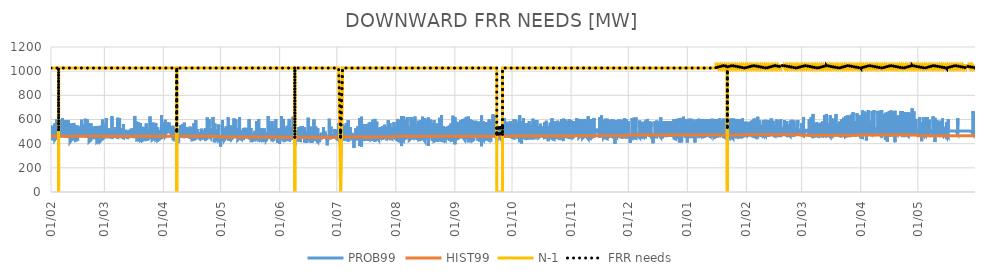
| Category | PROB99 | HIST99 | N-1 | FRR needs |
|---|---|---|---|---|
| 2019-02-01 | 463 | 461 | 1026 | 1026 |
| 2019-02-01 | 550 | 461 | 1026 | 1026 |
| 2019-02-01 | 533 | 461 | 1026 | 1026 |
| 2019-02-01 | 531 | 461 | 1026 | 1026 |
| 2019-02-01 | 492 | 461 | 1026 | 1026 |
| 2019-02-01 | 532 | 461 | 1026 | 1026 |
| 2019-02-02 | 429 | 461 | 1026 | 1026 |
| 2019-02-02 | 518 | 461 | 1026 | 1026 |
| 2019-02-02 | 534 | 461 | 1026 | 1026 |
| 2019-02-02 | 536 | 461 | 1026 | 1026 |
| 2019-02-02 | 517 | 461 | 1026 | 1026 |
| 2019-02-02 | 474 | 461 | 1026 | 1026 |
| 2019-02-03 | 460 | 461 | 1026 | 1026 |
| 2019-02-03 | 528 | 461 | 1026 | 1026 |
| 2019-02-03 | 566 | 461 | 1026 | 1026 |
| 2019-02-03 | 571 | 461 | 1026 | 1026 |
| 2019-02-03 | 517 | 461 | 1026 | 1026 |
| 2019-02-03 | 432 | 461 | 1026 | 1026 |
| 2019-02-04 | 455 | 461 | 1026 | 1026 |
| 2019-02-04 | 537 | 461 | 1026 | 1026 |
| 2019-02-04 | 601 | 461 | 1026 | 1026 |
| 2019-02-04 | 596 | 461 | 1026 | 1026 |
| 2019-02-04 | 525 | 461 | 1026 | 1026 |
| 2019-02-04 | 475 | 461 | 1026 | 1026 |
| 2019-02-05 | 465 | 461 | 1026 | 1026 |
| 2019-02-05 | 547 | 461 | 1026 | 1026 |
| 2019-02-05 | 516 | 461 | 0 | 516 |
| 2019-02-05 | 564 | 461 | 1026 | 1026 |
| 2019-02-05 | 507 | 461 | 1026 | 1026 |
| 2019-02-05 | 467 | 461 | 1026 | 1026 |
| 2019-02-06 | 465 | 461 | 1026 | 1026 |
| 2019-02-06 | 569 | 461 | 1026 | 1026 |
| 2019-02-06 | 597 | 461 | 1026 | 1026 |
| 2019-02-06 | 590 | 461 | 1026 | 1026 |
| 2019-02-06 | 515 | 461 | 1026 | 1026 |
| 2019-02-06 | 478 | 461 | 1026 | 1026 |
| 2019-02-07 | 470 | 461 | 1026 | 1026 |
| 2019-02-07 | 585 | 461 | 1026 | 1026 |
| 2019-02-07 | 611 | 461 | 1026 | 1026 |
| 2019-02-07 | 610 | 461 | 1026 | 1026 |
| 2019-02-07 | 522 | 461 | 1026 | 1026 |
| 2019-02-07 | 467 | 461 | 1026 | 1026 |
| 2019-02-08 | 463 | 461 | 1026 | 1026 |
| 2019-02-08 | 585 | 461 | 1026 | 1026 |
| 2019-02-08 | 596 | 461 | 1026 | 1026 |
| 2019-02-08 | 595 | 461 | 1026 | 1026 |
| 2019-02-08 | 522 | 461 | 1026 | 1026 |
| 2019-02-08 | 500 | 461 | 1026 | 1026 |
| 2019-02-09 | 454 | 461 | 1026 | 1026 |
| 2019-02-09 | 497 | 461 | 1026 | 1026 |
| 2019-02-09 | 593 | 461 | 1026 | 1026 |
| 2019-02-09 | 592 | 461 | 1026 | 1026 |
| 2019-02-09 | 530 | 461 | 1026 | 1026 |
| 2019-02-09 | 497 | 461 | 1026 | 1026 |
| 2019-02-10 | 473 | 461 | 1026 | 1026 |
| 2019-02-10 | 518 | 461 | 1026 | 1026 |
| 2019-02-10 | 593 | 461 | 1026 | 1026 |
| 2019-02-10 | 601 | 461 | 1026 | 1026 |
| 2019-02-10 | 536 | 461 | 1026 | 1026 |
| 2019-02-10 | 460 | 461 | 1026 | 1026 |
| 2019-02-11 | 464 | 461 | 1026 | 1026 |
| 2019-02-11 | 551 | 461 | 1026 | 1026 |
| 2019-02-11 | 567 | 461 | 1026 | 1026 |
| 2019-02-11 | 571 | 461 | 1026 | 1026 |
| 2019-02-11 | 518 | 461 | 1026 | 1026 |
| 2019-02-11 | 414 | 461 | 1026 | 1026 |
| 2019-02-12 | 436 | 461 | 1026 | 1026 |
| 2019-02-12 | 547 | 461 | 1026 | 1026 |
| 2019-02-12 | 567 | 461 | 1026 | 1026 |
| 2019-02-12 | 569 | 461 | 1026 | 1026 |
| 2019-02-12 | 513 | 461 | 1026 | 1026 |
| 2019-02-12 | 450 | 461 | 1026 | 1026 |
| 2019-02-13 | 438 | 461 | 1026 | 1026 |
| 2019-02-13 | 550 | 461 | 1026 | 1026 |
| 2019-02-13 | 572 | 461 | 1026 | 1026 |
| 2019-02-13 | 576 | 461 | 1026 | 1026 |
| 2019-02-13 | 523 | 461 | 1026 | 1026 |
| 2019-02-13 | 515 | 461 | 1026 | 1026 |
| 2019-02-14 | 434 | 461 | 1026 | 1026 |
| 2019-02-14 | 542 | 461 | 1026 | 1026 |
| 2019-02-14 | 554 | 461 | 1026 | 1026 |
| 2019-02-14 | 550 | 461 | 1026 | 1026 |
| 2019-02-14 | 510 | 461 | 1026 | 1026 |
| 2019-02-14 | 426 | 461 | 1026 | 1026 |
| 2019-02-15 | 433 | 461 | 1026 | 1026 |
| 2019-02-15 | 549 | 461 | 1026 | 1026 |
| 2019-02-15 | 549 | 461 | 1026 | 1026 |
| 2019-02-15 | 545 | 461 | 1026 | 1026 |
| 2019-02-15 | 511 | 461 | 1026 | 1026 |
| 2019-02-15 | 544 | 461 | 1026 | 1026 |
| 2019-02-16 | 466 | 461 | 1026 | 1026 |
| 2019-02-16 | 520 | 461 | 1026 | 1026 |
| 2019-02-16 | 538 | 461 | 1026 | 1026 |
| 2019-02-16 | 540 | 461 | 1026 | 1026 |
| 2019-02-16 | 514 | 461 | 1026 | 1026 |
| 2019-02-16 | 510 | 461 | 1026 | 1026 |
| 2019-02-17 | 465 | 461 | 1026 | 1026 |
| 2019-02-17 | 502 | 461 | 1026 | 1026 |
| 2019-02-17 | 598 | 461 | 1026 | 1026 |
| 2019-02-17 | 597 | 461 | 1026 | 1026 |
| 2019-02-17 | 527 | 461 | 1026 | 1026 |
| 2019-02-17 | 473 | 461 | 1026 | 1026 |
| 2019-02-18 | 473 | 461 | 1026 | 1026 |
| 2019-02-18 | 556 | 461 | 1026 | 1026 |
| 2019-02-18 | 542 | 461 | 1026 | 1026 |
| 2019-02-18 | 550 | 461 | 1026 | 1026 |
| 2019-02-18 | 507 | 461 | 1026 | 1026 |
| 2019-02-18 | 466 | 461 | 1026 | 1026 |
| 2019-02-19 | 469 | 461 | 1026 | 1026 |
| 2019-02-19 | 568 | 461 | 1026 | 1026 |
| 2019-02-19 | 606 | 461 | 1026 | 1026 |
| 2019-02-19 | 606 | 461 | 1026 | 1026 |
| 2019-02-19 | 512 | 461 | 1026 | 1026 |
| 2019-02-19 | 464 | 461 | 1026 | 1026 |
| 2019-02-20 | 461 | 461 | 1026 | 1026 |
| 2019-02-20 | 552 | 461 | 1026 | 1026 |
| 2019-02-20 | 564 | 461 | 1026 | 1026 |
| 2019-02-20 | 601 | 461 | 1026 | 1026 |
| 2019-02-20 | 528 | 461 | 1026 | 1026 |
| 2019-02-20 | 512 | 461 | 1026 | 1026 |
| 2019-02-21 | 457 | 461 | 1026 | 1026 |
| 2019-02-21 | 554 | 461 | 1026 | 1026 |
| 2019-02-21 | 568 | 461 | 1026 | 1026 |
| 2019-02-21 | 552 | 461 | 1026 | 1026 |
| 2019-02-21 | 497 | 461 | 1026 | 1026 |
| 2019-02-21 | 416 | 461 | 1026 | 1026 |
| 2019-02-22 | 431 | 461 | 1026 | 1026 |
| 2019-02-22 | 547 | 461 | 1026 | 1026 |
| 2019-02-22 | 567 | 461 | 1026 | 1026 |
| 2019-02-22 | 554 | 461 | 1026 | 1026 |
| 2019-02-22 | 508 | 461 | 1026 | 1026 |
| 2019-02-22 | 501 | 461 | 1026 | 1026 |
| 2019-02-23 | 440 | 461 | 1026 | 1026 |
| 2019-02-23 | 524 | 461 | 1026 | 1026 |
| 2019-02-23 | 525 | 461 | 1026 | 1026 |
| 2019-02-23 | 540 | 461 | 1026 | 1026 |
| 2019-02-23 | 513 | 461 | 1026 | 1026 |
| 2019-02-23 | 499 | 461 | 1026 | 1026 |
| 2019-02-24 | 438 | 461 | 1026 | 1026 |
| 2019-02-24 | 512 | 461 | 1026 | 1026 |
| 2019-02-24 | 527 | 461 | 1026 | 1026 |
| 2019-02-24 | 542 | 461 | 1026 | 1026 |
| 2019-02-24 | 512 | 461 | 1026 | 1026 |
| 2019-02-24 | 503 | 461 | 1026 | 1026 |
| 2019-02-25 | 437 | 461 | 1026 | 1026 |
| 2019-02-25 | 516 | 461 | 1026 | 1026 |
| 2019-02-25 | 529 | 461 | 1026 | 1026 |
| 2019-02-25 | 546 | 461 | 1026 | 1026 |
| 2019-02-25 | 521 | 461 | 1026 | 1026 |
| 2019-02-25 | 415 | 461 | 1026 | 1026 |
| 2019-02-26 | 431 | 461 | 1026 | 1026 |
| 2019-02-26 | 547 | 461 | 1026 | 1026 |
| 2019-02-26 | 548 | 461 | 1026 | 1026 |
| 2019-02-26 | 541 | 461 | 1026 | 1026 |
| 2019-02-26 | 510 | 461 | 1026 | 1026 |
| 2019-02-26 | 418 | 461 | 1026 | 1026 |
| 2019-02-27 | 435 | 461 | 1026 | 1026 |
| 2019-02-27 | 549 | 461 | 1026 | 1026 |
| 2019-02-27 | 548 | 461 | 1026 | 1026 |
| 2019-02-27 | 542 | 461 | 1026 | 1026 |
| 2019-02-27 | 517 | 461 | 1026 | 1026 |
| 2019-02-27 | 423 | 461 | 1026 | 1026 |
| 2019-02-28 | 442 | 461 | 1026 | 1026 |
| 2019-02-28 | 549 | 461 | 1026 | 1026 |
| 2019-02-28 | 599 | 461 | 1026 | 1026 |
| 2019-02-28 | 598 | 461 | 1026 | 1026 |
| 2019-02-28 | 542 | 461 | 1026 | 1026 |
| 2019-02-28 | 432 | 461 | 1026 | 1026 |
| 2019-03-01 | 468 | 461 | 1026 | 1026 |
| 2019-03-01 | 530 | 461 | 1026 | 1026 |
| 2019-03-01 | 556 | 461 | 1026 | 1026 |
| 2019-03-01 | 566 | 461 | 1026 | 1026 |
| 2019-03-01 | 504 | 461 | 1026 | 1026 |
| 2019-03-01 | 495 | 461 | 1026 | 1026 |
| 2019-03-02 | 457 | 461 | 1026 | 1026 |
| 2019-03-02 | 518 | 461 | 1026 | 1026 |
| 2019-03-02 | 611 | 461 | 1026 | 1026 |
| 2019-03-02 | 615 | 461 | 1026 | 1026 |
| 2019-03-02 | 484 | 461 | 1026 | 1026 |
| 2019-03-02 | 455 | 461 | 1026 | 1026 |
| 2019-03-03 | 458 | 461 | 1026 | 1026 |
| 2019-03-03 | 452 | 461 | 1026 | 1026 |
| 2019-03-03 | 508 | 461 | 1026 | 1026 |
| 2019-03-03 | 530 | 461 | 1026 | 1026 |
| 2019-03-03 | 494 | 461 | 1026 | 1026 |
| 2019-03-03 | 458 | 461 | 1026 | 1026 |
| 2019-03-04 | 458 | 461 | 1026 | 1026 |
| 2019-03-04 | 503 | 461 | 1026 | 1026 |
| 2019-03-04 | 514 | 461 | 1026 | 1026 |
| 2019-03-04 | 521 | 461 | 1026 | 1026 |
| 2019-03-04 | 497 | 461 | 1026 | 1026 |
| 2019-03-04 | 455 | 461 | 1026 | 1026 |
| 2019-03-05 | 451 | 461 | 1026 | 1026 |
| 2019-03-05 | 504 | 461 | 1026 | 1026 |
| 2019-03-05 | 579 | 461 | 1026 | 1026 |
| 2019-03-05 | 627 | 461 | 1026 | 1026 |
| 2019-03-05 | 507 | 461 | 1026 | 1026 |
| 2019-03-05 | 465 | 461 | 1026 | 1026 |
| 2019-03-06 | 466 | 461 | 1026 | 1026 |
| 2019-03-06 | 512 | 461 | 1026 | 1026 |
| 2019-03-06 | 515 | 461 | 1026 | 1026 |
| 2019-03-06 | 519 | 461 | 1026 | 1026 |
| 2019-03-06 | 481 | 461 | 1026 | 1026 |
| 2019-03-06 | 461 | 461 | 1026 | 1026 |
| 2019-03-07 | 471 | 461 | 1026 | 1026 |
| 2019-03-07 | 513 | 461 | 1026 | 1026 |
| 2019-03-07 | 536 | 461 | 1026 | 1026 |
| 2019-03-07 | 521 | 461 | 1026 | 1026 |
| 2019-03-07 | 491 | 461 | 1026 | 1026 |
| 2019-03-07 | 456 | 461 | 1026 | 1026 |
| 2019-03-08 | 451 | 461 | 1026 | 1026 |
| 2019-03-08 | 531 | 461 | 1026 | 1026 |
| 2019-03-08 | 577 | 461 | 1026 | 1026 |
| 2019-03-08 | 614 | 461 | 1026 | 1026 |
| 2019-03-08 | 519 | 461 | 1026 | 1026 |
| 2019-03-08 | 492 | 461 | 1026 | 1026 |
| 2019-03-09 | 452 | 461 | 1026 | 1026 |
| 2019-03-09 | 480 | 461 | 1026 | 1026 |
| 2019-03-09 | 519 | 461 | 1026 | 1026 |
| 2019-03-09 | 611 | 461 | 1026 | 1026 |
| 2019-03-09 | 504 | 461 | 1026 | 1026 |
| 2019-03-09 | 467 | 461 | 1026 | 1026 |
| 2019-03-10 | 471 | 461 | 1026 | 1026 |
| 2019-03-10 | 469 | 461 | 1026 | 1026 |
| 2019-03-10 | 508 | 461 | 1026 | 1026 |
| 2019-03-10 | 527 | 461 | 1026 | 1026 |
| 2019-03-10 | 494 | 461 | 1026 | 1026 |
| 2019-03-10 | 455 | 461 | 1026 | 1026 |
| 2019-03-11 | 448 | 461 | 1026 | 1026 |
| 2019-03-11 | 498 | 461 | 1026 | 1026 |
| 2019-03-11 | 562 | 461 | 1026 | 1026 |
| 2019-03-11 | 564 | 461 | 1026 | 1026 |
| 2019-03-11 | 510 | 461 | 1026 | 1026 |
| 2019-03-11 | 511 | 461 | 1026 | 1026 |
| 2019-03-12 | 456 | 461 | 1026 | 1026 |
| 2019-03-12 | 500 | 461 | 1026 | 1026 |
| 2019-03-12 | 515 | 461 | 1026 | 1026 |
| 2019-03-12 | 519 | 461 | 1026 | 1026 |
| 2019-03-12 | 478 | 461 | 1026 | 1026 |
| 2019-03-12 | 457 | 461 | 1026 | 1026 |
| 2019-03-13 | 451 | 461 | 1026 | 1026 |
| 2019-03-13 | 501 | 461 | 1026 | 1026 |
| 2019-03-13 | 514 | 461 | 1026 | 1026 |
| 2019-03-13 | 517 | 461 | 1026 | 1026 |
| 2019-03-13 | 478 | 461 | 1026 | 1026 |
| 2019-03-13 | 456 | 461 | 1026 | 1026 |
| 2019-03-14 | 456 | 461 | 1026 | 1026 |
| 2019-03-14 | 499 | 461 | 1026 | 1026 |
| 2019-03-14 | 514 | 461 | 1026 | 1026 |
| 2019-03-14 | 517 | 461 | 1026 | 1026 |
| 2019-03-14 | 487 | 461 | 1026 | 1026 |
| 2019-03-14 | 460 | 461 | 1026 | 1026 |
| 2019-03-15 | 468 | 461 | 1026 | 1026 |
| 2019-03-15 | 500 | 461 | 1026 | 1026 |
| 2019-03-15 | 513 | 461 | 1026 | 1026 |
| 2019-03-15 | 523 | 461 | 1026 | 1026 |
| 2019-03-15 | 472 | 461 | 1026 | 1026 |
| 2019-03-15 | 469 | 461 | 1026 | 1026 |
| 2019-03-16 | 480 | 461 | 1026 | 1026 |
| 2019-03-16 | 474 | 461 | 1026 | 1026 |
| 2019-03-16 | 513 | 461 | 1026 | 1026 |
| 2019-03-16 | 528 | 461 | 1026 | 1026 |
| 2019-03-16 | 504 | 461 | 1026 | 1026 |
| 2019-03-16 | 457 | 461 | 1026 | 1026 |
| 2019-03-17 | 456 | 461 | 1026 | 1026 |
| 2019-03-17 | 449 | 461 | 1026 | 1026 |
| 2019-03-17 | 547 | 461 | 1026 | 1026 |
| 2019-03-17 | 630 | 461 | 1026 | 1026 |
| 2019-03-17 | 507 | 461 | 1026 | 1026 |
| 2019-03-17 | 464 | 461 | 1026 | 1026 |
| 2019-03-18 | 461 | 461 | 1026 | 1026 |
| 2019-03-18 | 535 | 461 | 1026 | 1026 |
| 2019-03-18 | 582 | 461 | 1026 | 1026 |
| 2019-03-18 | 546 | 461 | 1026 | 1026 |
| 2019-03-18 | 528 | 461 | 1026 | 1026 |
| 2019-03-18 | 432 | 461 | 1026 | 1026 |
| 2019-03-19 | 439 | 461 | 1026 | 1026 |
| 2019-03-19 | 538 | 461 | 1026 | 1026 |
| 2019-03-19 | 575 | 461 | 1026 | 1026 |
| 2019-03-19 | 539 | 461 | 1026 | 1026 |
| 2019-03-19 | 526 | 461 | 1026 | 1026 |
| 2019-03-19 | 432 | 461 | 1026 | 1026 |
| 2019-03-20 | 442 | 461 | 1026 | 1026 |
| 2019-03-20 | 539 | 461 | 1026 | 1026 |
| 2019-03-20 | 571 | 461 | 1026 | 1026 |
| 2019-03-20 | 542 | 461 | 1026 | 1026 |
| 2019-03-20 | 519 | 461 | 1026 | 1026 |
| 2019-03-20 | 427 | 461 | 1026 | 1026 |
| 2019-03-21 | 437 | 461 | 1026 | 1026 |
| 2019-03-21 | 539 | 461 | 1026 | 1026 |
| 2019-03-21 | 547 | 461 | 1026 | 1026 |
| 2019-03-21 | 531 | 461 | 1026 | 1026 |
| 2019-03-21 | 523 | 461 | 1026 | 1026 |
| 2019-03-21 | 426 | 461 | 1026 | 1026 |
| 2019-03-22 | 437 | 461 | 1026 | 1026 |
| 2019-03-22 | 538 | 461 | 1026 | 1026 |
| 2019-03-22 | 531 | 461 | 1026 | 1026 |
| 2019-03-22 | 526 | 461 | 1026 | 1026 |
| 2019-03-22 | 524 | 461 | 1026 | 1026 |
| 2019-03-22 | 489 | 461 | 1026 | 1026 |
| 2019-03-23 | 439 | 461 | 1026 | 1026 |
| 2019-03-23 | 506 | 461 | 1026 | 1026 |
| 2019-03-23 | 567 | 461 | 1026 | 1026 |
| 2019-03-23 | 532 | 461 | 1026 | 1026 |
| 2019-03-23 | 503 | 461 | 1026 | 1026 |
| 2019-03-23 | 433 | 461 | 1026 | 1026 |
| 2019-03-24 | 438 | 461 | 1026 | 1026 |
| 2019-03-24 | 467 | 461 | 1026 | 1026 |
| 2019-03-24 | 521 | 461 | 1026 | 1026 |
| 2019-03-24 | 528 | 461 | 1026 | 1026 |
| 2019-03-24 | 525 | 461 | 1026 | 1026 |
| 2019-03-24 | 443 | 461 | 1026 | 1026 |
| 2019-03-25 | 453 | 461 | 1026 | 1026 |
| 2019-03-25 | 524 | 461 | 1026 | 1026 |
| 2019-03-25 | 625 | 461 | 1026 | 1026 |
| 2019-03-25 | 624 | 461 | 1026 | 1026 |
| 2019-03-25 | 517 | 461 | 1026 | 1026 |
| 2019-03-25 | 465 | 461 | 1026 | 1026 |
| 2019-03-26 | 450 | 461 | 1026 | 1026 |
| 2019-03-26 | 536 | 461 | 1026 | 1026 |
| 2019-03-26 | 573 | 461 | 1026 | 1026 |
| 2019-03-26 | 573 | 461 | 1026 | 1026 |
| 2019-03-26 | 530 | 461 | 1026 | 1026 |
| 2019-03-26 | 431 | 461 | 1026 | 1026 |
| 2019-03-27 | 444 | 461 | 1026 | 1026 |
| 2019-03-27 | 547 | 461 | 1026 | 1026 |
| 2019-03-27 | 574 | 461 | 1026 | 1026 |
| 2019-03-27 | 541 | 461 | 1026 | 1026 |
| 2019-03-27 | 532 | 461 | 1026 | 1026 |
| 2019-03-27 | 474 | 461 | 1026 | 1026 |
| 2019-03-28 | 437 | 461 | 1026 | 1026 |
| 2019-03-28 | 542 | 461 | 1026 | 1026 |
| 2019-03-28 | 571 | 461 | 1026 | 1026 |
| 2019-03-28 | 541 | 461 | 1026 | 1026 |
| 2019-03-28 | 531 | 461 | 1026 | 1026 |
| 2019-03-28 | 432 | 461 | 1026 | 1026 |
| 2019-03-29 | 444 | 461 | 1026 | 1026 |
| 2019-03-29 | 534 | 461 | 1026 | 1026 |
| 2019-03-29 | 524 | 461 | 1026 | 1026 |
| 2019-03-29 | 529 | 461 | 1026 | 1026 |
| 2019-03-29 | 523 | 461 | 1026 | 1026 |
| 2019-03-29 | 426 | 461 | 1026 | 1026 |
| 2019-03-30 | 438 | 461 | 1026 | 1026 |
| 2019-03-30 | 512 | 461 | 1026 | 1026 |
| 2019-03-30 | 511 | 461 | 1026 | 1026 |
| 2019-03-30 | 515 | 461 | 1026 | 1026 |
| 2019-03-30 | 494 | 461 | 1026 | 1026 |
| 2019-03-30 | 439 | 461 | 1026 | 1026 |
| 2019-03-31 | 449 | 461 | 1026 | 1026 |
| 2019-03-31 | 478 | 461 | 1026 | 1026 |
| 2019-03-31 | 625 | 461 | 1026 | 1026 |
| 2019-03-31 | 636 | 461 | 1026 | 1026 |
| 2019-03-31 | 618 | 461 | 1026 | 1026 |
| 2019-03-31 | 487 | 461 | 1026 | 1026 |
| 2019-04-01 | 465 | 461 | 1026 | 1026 |
| 2019-04-01 | 528 | 461 | 1026 | 1026 |
| 2019-04-01 | 578 | 461 | 1026 | 1026 |
| 2019-04-01 | 523 | 461 | 1026 | 1026 |
| 2019-04-01 | 527 | 461 | 1026 | 1026 |
| 2019-04-01 | 512 | 461 | 1026 | 1026 |
| 2019-04-02 | 445 | 461 | 1026 | 1026 |
| 2019-04-02 | 528 | 461 | 1026 | 1026 |
| 2019-04-02 | 571 | 461 | 1026 | 1026 |
| 2019-04-02 | 598 | 461 | 1026 | 1026 |
| 2019-04-02 | 589 | 461 | 1026 | 1026 |
| 2019-04-02 | 498 | 461 | 1026 | 1026 |
| 2019-04-03 | 513 | 461 | 1026 | 1026 |
| 2019-04-03 | 526 | 461 | 1026 | 1026 |
| 2019-04-03 | 576 | 461 | 1026 | 1026 |
| 2019-04-03 | 578 | 461 | 1026 | 1026 |
| 2019-04-03 | 546 | 461 | 1026 | 1026 |
| 2019-04-03 | 495 | 461 | 1026 | 1026 |
| 2019-04-04 | 509 | 461 | 1026 | 1026 |
| 2019-04-04 | 525 | 461 | 1026 | 1026 |
| 2019-04-04 | 575 | 461 | 1026 | 1026 |
| 2019-04-04 | 576 | 461 | 1026 | 1026 |
| 2019-04-04 | 541 | 461 | 1026 | 1026 |
| 2019-04-04 | 498 | 461 | 1026 | 1026 |
| 2019-04-05 | 485 | 461 | 1026 | 1026 |
| 2019-04-05 | 527 | 461 | 1026 | 1026 |
| 2019-04-05 | 545 | 461 | 1026 | 1026 |
| 2019-04-05 | 526 | 461 | 1026 | 1026 |
| 2019-04-05 | 527 | 461 | 1026 | 1026 |
| 2019-04-05 | 499 | 461 | 1026 | 1026 |
| 2019-04-06 | 447 | 461 | 1026 | 1026 |
| 2019-04-06 | 518 | 461 | 1026 | 1026 |
| 2019-04-06 | 548 | 461 | 1026 | 1026 |
| 2019-04-06 | 516 | 461 | 1026 | 1026 |
| 2019-04-06 | 507 | 461 | 1026 | 1026 |
| 2019-04-06 | 439 | 461 | 1026 | 1026 |
| 2019-04-07 | 441 | 461 | 1026 | 1026 |
| 2019-04-07 | 522 | 461 | 1026 | 1026 |
| 2019-04-07 | 500 | 461 | 1026 | 1026 |
| 2019-04-07 | 510 | 461 | 1026 | 1026 |
| 2019-04-07 | 493 | 461 | 1026 | 1026 |
| 2019-04-07 | 432 | 461 | 1026 | 1026 |
| 2019-04-08 | 436 | 461 | 1026 | 1026 |
| 2019-04-08 | 524 | 461 | 1026 | 1026 |
| 2019-04-08 | 521 | 461 | 0 | 521 |
| 2019-04-08 | 504 | 461 | 0 | 504 |
| 2019-04-08 | 476 | 461 | 1026 | 1026 |
| 2019-04-08 | 403 | 461 | 1026 | 1026 |
| 2019-04-09 | 415 | 461 | 1026 | 1026 |
| 2019-04-09 | 493 | 461 | 1026 | 1026 |
| 2019-04-09 | 529 | 461 | 1026 | 1026 |
| 2019-04-09 | 529 | 461 | 1026 | 1026 |
| 2019-04-09 | 485 | 461 | 1026 | 1026 |
| 2019-04-09 | 458 | 461 | 1026 | 1026 |
| 2019-04-10 | 459 | 461 | 1026 | 1026 |
| 2019-04-10 | 522 | 461 | 1026 | 1026 |
| 2019-04-10 | 529 | 461 | 1026 | 1026 |
| 2019-04-10 | 552 | 461 | 1026 | 1026 |
| 2019-04-10 | 538 | 461 | 1026 | 1026 |
| 2019-04-10 | 496 | 461 | 1026 | 1026 |
| 2019-04-11 | 455 | 461 | 1026 | 1026 |
| 2019-04-11 | 527 | 461 | 1026 | 1026 |
| 2019-04-11 | 562 | 461 | 1026 | 1026 |
| 2019-04-11 | 562 | 461 | 1026 | 1026 |
| 2019-04-11 | 525 | 461 | 1026 | 1026 |
| 2019-04-11 | 506 | 461 | 1026 | 1026 |
| 2019-04-12 | 446 | 461 | 1026 | 1026 |
| 2019-04-12 | 527 | 461 | 1026 | 1026 |
| 2019-04-12 | 574 | 461 | 1026 | 1026 |
| 2019-04-12 | 544 | 461 | 1026 | 1026 |
| 2019-04-12 | 545 | 461 | 1026 | 1026 |
| 2019-04-12 | 502 | 461 | 1026 | 1026 |
| 2019-04-13 | 448 | 461 | 1026 | 1026 |
| 2019-04-13 | 511 | 461 | 1026 | 1026 |
| 2019-04-13 | 537 | 461 | 1026 | 1026 |
| 2019-04-13 | 537 | 461 | 1026 | 1026 |
| 2019-04-13 | 532 | 461 | 1026 | 1026 |
| 2019-04-13 | 511 | 461 | 1026 | 1026 |
| 2019-04-14 | 450 | 461 | 1026 | 1026 |
| 2019-04-14 | 513 | 461 | 1026 | 1026 |
| 2019-04-14 | 518 | 461 | 1026 | 1026 |
| 2019-04-14 | 527 | 461 | 1026 | 1026 |
| 2019-04-14 | 530 | 461 | 1026 | 1026 |
| 2019-04-14 | 491 | 461 | 1026 | 1026 |
| 2019-04-15 | 442 | 461 | 1026 | 1026 |
| 2019-04-15 | 526 | 461 | 1026 | 1026 |
| 2019-04-15 | 541 | 461 | 1026 | 1026 |
| 2019-04-15 | 534 | 461 | 1026 | 1026 |
| 2019-04-15 | 529 | 461 | 1026 | 1026 |
| 2019-04-15 | 461 | 461 | 1026 | 1026 |
| 2019-04-16 | 467 | 461 | 1026 | 1026 |
| 2019-04-16 | 522 | 461 | 1026 | 1026 |
| 2019-04-16 | 533 | 461 | 1026 | 1026 |
| 2019-04-16 | 530 | 461 | 1026 | 1026 |
| 2019-04-16 | 526 | 461 | 1026 | 1026 |
| 2019-04-16 | 431 | 461 | 1026 | 1026 |
| 2019-04-17 | 435 | 461 | 1026 | 1026 |
| 2019-04-17 | 522 | 461 | 1026 | 1026 |
| 2019-04-17 | 570 | 461 | 1026 | 1026 |
| 2019-04-17 | 529 | 461 | 1026 | 1026 |
| 2019-04-17 | 507 | 461 | 1026 | 1026 |
| 2019-04-17 | 439 | 461 | 1026 | 1026 |
| 2019-04-18 | 442 | 461 | 1026 | 1026 |
| 2019-04-18 | 526 | 461 | 1026 | 1026 |
| 2019-04-18 | 521 | 461 | 1026 | 1026 |
| 2019-04-18 | 595 | 461 | 1026 | 1026 |
| 2019-04-18 | 591 | 461 | 1026 | 1026 |
| 2019-04-18 | 466 | 461 | 1026 | 1026 |
| 2019-04-19 | 471 | 461 | 1026 | 1026 |
| 2019-04-19 | 521 | 461 | 1026 | 1026 |
| 2019-04-19 | 510 | 461 | 1026 | 1026 |
| 2019-04-19 | 494 | 461 | 1026 | 1026 |
| 2019-04-19 | 481 | 461 | 1026 | 1026 |
| 2019-04-19 | 454 | 461 | 1026 | 1026 |
| 2019-04-20 | 441 | 461 | 1026 | 1026 |
| 2019-04-20 | 454 | 461 | 1026 | 1026 |
| 2019-04-20 | 495 | 461 | 1026 | 1026 |
| 2019-04-20 | 493 | 461 | 1026 | 1026 |
| 2019-04-20 | 483 | 461 | 1026 | 1026 |
| 2019-04-20 | 455 | 461 | 1026 | 1026 |
| 2019-04-21 | 460 | 461 | 1026 | 1026 |
| 2019-04-21 | 524 | 461 | 1026 | 1026 |
| 2019-04-21 | 488 | 461 | 1026 | 1026 |
| 2019-04-21 | 506 | 461 | 1026 | 1026 |
| 2019-04-21 | 492 | 461 | 1026 | 1026 |
| 2019-04-21 | 442 | 461 | 1026 | 1026 |
| 2019-04-22 | 447 | 461 | 1026 | 1026 |
| 2019-04-22 | 462 | 461 | 1026 | 1026 |
| 2019-04-22 | 492 | 461 | 1026 | 1026 |
| 2019-04-22 | 511 | 461 | 1026 | 1026 |
| 2019-04-22 | 491 | 461 | 1026 | 1026 |
| 2019-04-22 | 476 | 461 | 1026 | 1026 |
| 2019-04-23 | 474 | 461 | 1026 | 1026 |
| 2019-04-23 | 527 | 461 | 1026 | 1026 |
| 2019-04-23 | 517 | 461 | 1026 | 1026 |
| 2019-04-23 | 503 | 461 | 1026 | 1026 |
| 2019-04-23 | 483 | 461 | 1026 | 1026 |
| 2019-04-23 | 437 | 461 | 1026 | 1026 |
| 2019-04-24 | 443 | 461 | 1026 | 1026 |
| 2019-04-24 | 535 | 461 | 1026 | 1026 |
| 2019-04-24 | 606 | 461 | 1026 | 1026 |
| 2019-04-24 | 617 | 461 | 1026 | 1026 |
| 2019-04-24 | 591 | 461 | 1026 | 1026 |
| 2019-04-24 | 454 | 461 | 1026 | 1026 |
| 2019-04-25 | 478 | 461 | 1026 | 1026 |
| 2019-04-25 | 522 | 461 | 1026 | 1026 |
| 2019-04-25 | 602 | 461 | 1026 | 1026 |
| 2019-04-25 | 607 | 461 | 1026 | 1026 |
| 2019-04-25 | 592 | 461 | 1026 | 1026 |
| 2019-04-25 | 463 | 461 | 1026 | 1026 |
| 2019-04-26 | 443 | 461 | 1026 | 1026 |
| 2019-04-26 | 523 | 461 | 1026 | 1026 |
| 2019-04-26 | 513 | 461 | 1026 | 1026 |
| 2019-04-26 | 518 | 461 | 1026 | 1026 |
| 2019-04-26 | 521 | 461 | 1026 | 1026 |
| 2019-04-26 | 464 | 461 | 1026 | 1026 |
| 2019-04-27 | 463 | 461 | 1026 | 1026 |
| 2019-04-27 | 457 | 461 | 1026 | 1026 |
| 2019-04-27 | 565 | 461 | 1026 | 1026 |
| 2019-04-27 | 621 | 461 | 1026 | 1026 |
| 2019-04-27 | 545 | 461 | 1026 | 1026 |
| 2019-04-27 | 500 | 461 | 1026 | 1026 |
| 2019-04-28 | 461 | 461 | 1026 | 1026 |
| 2019-04-28 | 469 | 461 | 1026 | 1026 |
| 2019-04-28 | 566 | 461 | 1026 | 1026 |
| 2019-04-28 | 536 | 461 | 1026 | 1026 |
| 2019-04-28 | 411 | 461 | 1026 | 1026 |
| 2019-04-28 | 435 | 461 | 1026 | 1026 |
| 2019-04-29 | 432 | 461 | 1026 | 1026 |
| 2019-04-29 | 519 | 461 | 1026 | 1026 |
| 2019-04-29 | 527 | 461 | 1026 | 1026 |
| 2019-04-29 | 521 | 461 | 1026 | 1026 |
| 2019-04-29 | 524 | 461 | 1026 | 1026 |
| 2019-04-29 | 434 | 461 | 1026 | 1026 |
| 2019-04-30 | 436 | 461 | 1026 | 1026 |
| 2019-04-30 | 525 | 461 | 1026 | 1026 |
| 2019-04-30 | 558 | 461 | 1026 | 1026 |
| 2019-04-30 | 554 | 461 | 1026 | 1026 |
| 2019-04-30 | 496 | 461 | 1026 | 1026 |
| 2019-04-30 | 429 | 461 | 1026 | 1026 |
| 2019-05-01 | 447 | 455 | 1026 | 1026 |
| 2019-05-01 | 424 | 455 | 1026 | 1026 |
| 2019-05-01 | 442 | 455 | 1026 | 1026 |
| 2019-05-01 | 438 | 455 | 1026 | 1026 |
| 2019-05-01 | 377 | 455 | 1026 | 1026 |
| 2019-05-01 | 431 | 455 | 1026 | 1026 |
| 2019-05-02 | 432 | 455 | 1026 | 1026 |
| 2019-05-02 | 527 | 455 | 1026 | 1026 |
| 2019-05-02 | 530 | 455 | 1026 | 1026 |
| 2019-05-02 | 594 | 455 | 1026 | 1026 |
| 2019-05-02 | 593 | 455 | 1026 | 1026 |
| 2019-05-02 | 432 | 455 | 1026 | 1026 |
| 2019-05-03 | 434 | 455 | 1026 | 1026 |
| 2019-05-03 | 529 | 455 | 1026 | 1026 |
| 2019-05-03 | 519 | 455 | 1026 | 1026 |
| 2019-05-03 | 517 | 455 | 1026 | 1026 |
| 2019-05-03 | 490 | 455 | 1026 | 1026 |
| 2019-05-03 | 431 | 455 | 1026 | 1026 |
| 2019-05-04 | 455 | 455 | 1026 | 1026 |
| 2019-05-04 | 524 | 455 | 1026 | 1026 |
| 2019-05-04 | 526 | 455 | 1026 | 1026 |
| 2019-05-04 | 545 | 455 | 1026 | 1026 |
| 2019-05-04 | 523 | 455 | 1026 | 1026 |
| 2019-05-04 | 456 | 455 | 1026 | 1026 |
| 2019-05-05 | 454 | 455 | 1026 | 1026 |
| 2019-05-05 | 460 | 455 | 1026 | 1026 |
| 2019-05-05 | 609 | 455 | 1026 | 1026 |
| 2019-05-05 | 619 | 455 | 1026 | 1026 |
| 2019-05-05 | 605 | 455 | 1026 | 1026 |
| 2019-05-05 | 435 | 455 | 1026 | 1026 |
| 2019-05-06 | 432 | 455 | 1026 | 1026 |
| 2019-05-06 | 529 | 455 | 1026 | 1026 |
| 2019-05-06 | 552 | 455 | 1026 | 1026 |
| 2019-05-06 | 550 | 455 | 1026 | 1026 |
| 2019-05-06 | 538 | 455 | 1026 | 1026 |
| 2019-05-06 | 473 | 455 | 1026 | 1026 |
| 2019-05-07 | 436 | 455 | 1026 | 1026 |
| 2019-05-07 | 531 | 455 | 1026 | 1026 |
| 2019-05-07 | 546 | 455 | 1026 | 1026 |
| 2019-05-07 | 524 | 455 | 1026 | 1026 |
| 2019-05-07 | 534 | 455 | 1026 | 1026 |
| 2019-05-07 | 444 | 455 | 1026 | 1026 |
| 2019-05-08 | 468 | 455 | 1026 | 1026 |
| 2019-05-08 | 533 | 455 | 1026 | 1026 |
| 2019-05-08 | 609 | 455 | 1026 | 1026 |
| 2019-05-08 | 610 | 455 | 1026 | 1026 |
| 2019-05-08 | 544 | 455 | 1026 | 1026 |
| 2019-05-08 | 467 | 455 | 1026 | 1026 |
| 2019-05-09 | 471 | 455 | 1026 | 1026 |
| 2019-05-09 | 529 | 455 | 1026 | 1026 |
| 2019-05-09 | 519 | 455 | 1026 | 1026 |
| 2019-05-09 | 600 | 455 | 1026 | 1026 |
| 2019-05-09 | 591 | 455 | 1026 | 1026 |
| 2019-05-09 | 462 | 455 | 1026 | 1026 |
| 2019-05-10 | 453 | 455 | 1026 | 1026 |
| 2019-05-10 | 525 | 455 | 1026 | 1026 |
| 2019-05-10 | 518 | 455 | 1026 | 1026 |
| 2019-05-10 | 519 | 455 | 1026 | 1026 |
| 2019-05-10 | 478 | 455 | 1026 | 1026 |
| 2019-05-10 | 430 | 455 | 1026 | 1026 |
| 2019-05-11 | 446 | 455 | 1026 | 1026 |
| 2019-05-11 | 529 | 455 | 1026 | 1026 |
| 2019-05-11 | 589 | 455 | 1026 | 1026 |
| 2019-05-11 | 618 | 455 | 1026 | 1026 |
| 2019-05-11 | 612 | 455 | 1026 | 1026 |
| 2019-05-11 | 449 | 455 | 1026 | 1026 |
| 2019-05-12 | 436 | 455 | 1026 | 1026 |
| 2019-05-12 | 448 | 455 | 1026 | 1026 |
| 2019-05-12 | 509 | 455 | 1026 | 1026 |
| 2019-05-12 | 510 | 455 | 1026 | 1026 |
| 2019-05-12 | 497 | 455 | 1026 | 1026 |
| 2019-05-12 | 440 | 455 | 1026 | 1026 |
| 2019-05-13 | 440 | 455 | 1026 | 1026 |
| 2019-05-13 | 530 | 455 | 1026 | 1026 |
| 2019-05-13 | 507 | 455 | 1026 | 1026 |
| 2019-05-13 | 520 | 455 | 1026 | 1026 |
| 2019-05-13 | 506 | 455 | 1026 | 1026 |
| 2019-05-13 | 457 | 455 | 1026 | 1026 |
| 2019-05-14 | 456 | 455 | 1026 | 1026 |
| 2019-05-14 | 531 | 455 | 1026 | 1026 |
| 2019-05-14 | 512 | 455 | 1026 | 1026 |
| 2019-05-14 | 513 | 455 | 1026 | 1026 |
| 2019-05-14 | 509 | 455 | 1026 | 1026 |
| 2019-05-14 | 456 | 455 | 1026 | 1026 |
| 2019-05-15 | 456 | 455 | 1026 | 1026 |
| 2019-05-15 | 529 | 455 | 1026 | 1026 |
| 2019-05-15 | 502 | 455 | 1026 | 1026 |
| 2019-05-15 | 513 | 455 | 1026 | 1026 |
| 2019-05-15 | 505 | 455 | 1026 | 1026 |
| 2019-05-15 | 457 | 455 | 1026 | 1026 |
| 2019-05-16 | 455 | 455 | 1026 | 1026 |
| 2019-05-16 | 526 | 455 | 1026 | 1026 |
| 2019-05-16 | 512 | 455 | 1026 | 1026 |
| 2019-05-16 | 603 | 455 | 1026 | 1026 |
| 2019-05-16 | 491 | 455 | 1026 | 1026 |
| 2019-05-16 | 446 | 455 | 1026 | 1026 |
| 2019-05-17 | 447 | 455 | 1026 | 1026 |
| 2019-05-17 | 530 | 455 | 1026 | 1026 |
| 2019-05-17 | 514 | 455 | 1026 | 1026 |
| 2019-05-17 | 517 | 455 | 1026 | 1026 |
| 2019-05-17 | 480 | 455 | 1026 | 1026 |
| 2019-05-17 | 427 | 455 | 1026 | 1026 |
| 2019-05-18 | 434 | 455 | 1026 | 1026 |
| 2019-05-18 | 459 | 455 | 1026 | 1026 |
| 2019-05-18 | 487 | 455 | 1026 | 1026 |
| 2019-05-18 | 483 | 455 | 1026 | 1026 |
| 2019-05-18 | 472 | 455 | 1026 | 1026 |
| 2019-05-18 | 426 | 455 | 1026 | 1026 |
| 2019-05-19 | 434 | 455 | 1026 | 1026 |
| 2019-05-19 | 458 | 455 | 1026 | 1026 |
| 2019-05-19 | 492 | 455 | 1026 | 1026 |
| 2019-05-19 | 506 | 455 | 1026 | 1026 |
| 2019-05-19 | 487 | 455 | 1026 | 1026 |
| 2019-05-19 | 442 | 455 | 1026 | 1026 |
| 2019-05-20 | 448 | 455 | 1026 | 1026 |
| 2019-05-20 | 541 | 455 | 1026 | 1026 |
| 2019-05-20 | 524 | 455 | 1026 | 1026 |
| 2019-05-20 | 587 | 455 | 1026 | 1026 |
| 2019-05-20 | 582 | 455 | 1026 | 1026 |
| 2019-05-20 | 441 | 455 | 1026 | 1026 |
| 2019-05-21 | 457 | 455 | 1026 | 1026 |
| 2019-05-21 | 534 | 455 | 1026 | 1026 |
| 2019-05-21 | 545 | 455 | 1026 | 1026 |
| 2019-05-21 | 603 | 455 | 1026 | 1026 |
| 2019-05-21 | 589 | 455 | 1026 | 1026 |
| 2019-05-21 | 428 | 455 | 1026 | 1026 |
| 2019-05-22 | 432 | 455 | 1026 | 1026 |
| 2019-05-22 | 527 | 455 | 1026 | 1026 |
| 2019-05-22 | 504 | 455 | 1026 | 1026 |
| 2019-05-22 | 497 | 455 | 1026 | 1026 |
| 2019-05-22 | 494 | 455 | 1026 | 1026 |
| 2019-05-22 | 428 | 455 | 1026 | 1026 |
| 2019-05-23 | 433 | 455 | 1026 | 1026 |
| 2019-05-23 | 525 | 455 | 1026 | 1026 |
| 2019-05-23 | 500 | 455 | 1026 | 1026 |
| 2019-05-23 | 480 | 455 | 1026 | 1026 |
| 2019-05-23 | 473 | 455 | 1026 | 1026 |
| 2019-05-23 | 428 | 455 | 1026 | 1026 |
| 2019-05-24 | 437 | 455 | 1026 | 1026 |
| 2019-05-24 | 526 | 455 | 1026 | 1026 |
| 2019-05-24 | 494 | 455 | 1026 | 1026 |
| 2019-05-24 | 494 | 455 | 1026 | 1026 |
| 2019-05-24 | 484 | 455 | 1026 | 1026 |
| 2019-05-24 | 427 | 455 | 1026 | 1026 |
| 2019-05-25 | 433 | 455 | 1026 | 1026 |
| 2019-05-25 | 492 | 455 | 1026 | 1026 |
| 2019-05-25 | 494 | 455 | 1026 | 1026 |
| 2019-05-25 | 489 | 455 | 1026 | 1026 |
| 2019-05-25 | 486 | 455 | 1026 | 1026 |
| 2019-05-25 | 429 | 455 | 1026 | 1026 |
| 2019-05-26 | 453 | 455 | 1026 | 1026 |
| 2019-05-26 | 471 | 455 | 1026 | 1026 |
| 2019-05-26 | 615 | 455 | 1026 | 1026 |
| 2019-05-26 | 623 | 455 | 1026 | 1026 |
| 2019-05-26 | 626 | 455 | 1026 | 1026 |
| 2019-05-26 | 479 | 455 | 1026 | 1026 |
| 2019-05-27 | 472 | 455 | 1026 | 1026 |
| 2019-05-27 | 535 | 455 | 1026 | 1026 |
| 2019-05-27 | 505 | 455 | 1026 | 1026 |
| 2019-05-27 | 506 | 455 | 1026 | 1026 |
| 2019-05-27 | 484 | 455 | 1026 | 1026 |
| 2019-05-27 | 450 | 455 | 1026 | 1026 |
| 2019-05-28 | 435 | 455 | 1026 | 1026 |
| 2019-05-28 | 533 | 455 | 1026 | 1026 |
| 2019-05-28 | 516 | 455 | 1026 | 1026 |
| 2019-05-28 | 588 | 455 | 1026 | 1026 |
| 2019-05-28 | 589 | 455 | 1026 | 1026 |
| 2019-05-28 | 431 | 455 | 1026 | 1026 |
| 2019-05-29 | 434 | 455 | 1026 | 1026 |
| 2019-05-29 | 528 | 455 | 1026 | 1026 |
| 2019-05-29 | 504 | 455 | 1026 | 1026 |
| 2019-05-29 | 497 | 455 | 1026 | 1026 |
| 2019-05-29 | 496 | 455 | 1026 | 1026 |
| 2019-05-29 | 459 | 455 | 1026 | 1026 |
| 2019-05-30 | 465 | 455 | 1026 | 1026 |
| 2019-05-30 | 474 | 455 | 1026 | 1026 |
| 2019-05-30 | 528 | 455 | 1026 | 1026 |
| 2019-05-30 | 603 | 455 | 1026 | 1026 |
| 2019-05-30 | 515 | 455 | 1026 | 1026 |
| 2019-05-30 | 460 | 455 | 1026 | 1026 |
| 2019-05-31 | 468 | 455 | 1026 | 1026 |
| 2019-05-31 | 523 | 455 | 1026 | 1026 |
| 2019-05-31 | 513 | 455 | 1026 | 1026 |
| 2019-05-31 | 429 | 455 | 1026 | 1026 |
| 2019-05-31 | 408 | 455 | 1026 | 1026 |
| 2019-05-31 | 443 | 455 | 1026 | 1026 |
| 2019-06-01 | 527 | 454 | 1026 | 1026 |
| 2019-06-01 | 419 | 454 | 1026 | 1026 |
| 2019-06-01 | 510 | 454 | 1026 | 1026 |
| 2019-06-01 | 411 | 454 | 1026 | 1026 |
| 2019-06-01 | 397 | 454 | 1026 | 1026 |
| 2019-06-01 | 431 | 454 | 1026 | 1026 |
| 2019-06-02 | 460 | 454 | 1026 | 1026 |
| 2019-06-02 | 480 | 454 | 1026 | 1026 |
| 2019-06-02 | 626 | 454 | 1026 | 1026 |
| 2019-06-02 | 633 | 454 | 1026 | 1026 |
| 2019-06-02 | 620 | 454 | 1026 | 1026 |
| 2019-06-02 | 444 | 454 | 1026 | 1026 |
| 2019-06-03 | 454 | 454 | 1026 | 1026 |
| 2019-06-03 | 540 | 454 | 1026 | 1026 |
| 2019-06-03 | 506 | 454 | 1026 | 1026 |
| 2019-06-03 | 605 | 454 | 1026 | 1026 |
| 2019-06-03 | 613 | 454 | 1026 | 1026 |
| 2019-06-03 | 428 | 454 | 1026 | 1026 |
| 2019-06-04 | 429 | 454 | 1026 | 1026 |
| 2019-06-04 | 537 | 454 | 1026 | 1026 |
| 2019-06-04 | 479 | 454 | 1026 | 1026 |
| 2019-06-04 | 479 | 454 | 1026 | 1026 |
| 2019-06-04 | 473 | 454 | 1026 | 1026 |
| 2019-06-04 | 429 | 454 | 1026 | 1026 |
| 2019-06-05 | 438 | 454 | 1026 | 1026 |
| 2019-06-05 | 548 | 454 | 1026 | 1026 |
| 2019-06-05 | 513 | 454 | 1026 | 1026 |
| 2019-06-05 | 482 | 454 | 1026 | 1026 |
| 2019-06-05 | 483 | 454 | 1026 | 1026 |
| 2019-06-05 | 427 | 454 | 1026 | 1026 |
| 2019-06-06 | 482 | 454 | 1026 | 1026 |
| 2019-06-06 | 534 | 454 | 1026 | 1026 |
| 2019-06-06 | 593 | 454 | 1026 | 1026 |
| 2019-06-06 | 605 | 454 | 1026 | 1026 |
| 2019-06-06 | 504 | 454 | 1026 | 1026 |
| 2019-06-06 | 419 | 454 | 1026 | 1026 |
| 2019-06-07 | 451 | 454 | 1026 | 1026 |
| 2019-06-07 | 535 | 454 | 1026 | 1026 |
| 2019-06-07 | 528 | 454 | 1026 | 1026 |
| 2019-06-07 | 530 | 454 | 1026 | 1026 |
| 2019-06-07 | 539 | 454 | 1026 | 1026 |
| 2019-06-07 | 470 | 454 | 1026 | 1026 |
| 2019-06-08 | 449 | 454 | 1026 | 1026 |
| 2019-06-08 | 474 | 454 | 1026 | 1026 |
| 2019-06-08 | 551 | 454 | 1026 | 1026 |
| 2019-06-08 | 622 | 454 | 1026 | 1026 |
| 2019-06-08 | 613 | 454 | 1026 | 1026 |
| 2019-06-08 | 452 | 454 | 1026 | 1026 |
| 2019-06-09 | 465 | 454 | 1026 | 1026 |
| 2019-06-09 | 401 | 454 | 0 | 454 |
| 2019-06-09 | 506 | 454 | 1026 | 1026 |
| 2019-06-09 | 408 | 454 | 1026 | 1026 |
| 2019-06-09 | 380 | 454 | 1026 | 1026 |
| 2019-06-09 | 416 | 454 | 1026 | 1026 |
| 2019-06-10 | 435 | 454 | 1026 | 1026 |
| 2019-06-10 | 502 | 454 | 1026 | 1026 |
| 2019-06-10 | 477 | 454 | 1026 | 1026 |
| 2019-06-10 | 499 | 454 | 1026 | 1026 |
| 2019-06-10 | 490 | 454 | 1026 | 1026 |
| 2019-06-10 | 433 | 454 | 1026 | 1026 |
| 2019-06-11 | 429 | 454 | 1026 | 1026 |
| 2019-06-11 | 538 | 454 | 1026 | 1026 |
| 2019-06-11 | 534 | 454 | 1026 | 1026 |
| 2019-06-11 | 506 | 454 | 1026 | 1026 |
| 2019-06-11 | 490 | 454 | 1026 | 1026 |
| 2019-06-11 | 427 | 454 | 1026 | 1026 |
| 2019-06-12 | 424 | 454 | 1026 | 1026 |
| 2019-06-12 | 542 | 454 | 1026 | 1026 |
| 2019-06-12 | 535 | 454 | 1026 | 1026 |
| 2019-06-12 | 504 | 454 | 1026 | 1026 |
| 2019-06-12 | 520 | 454 | 1026 | 1026 |
| 2019-06-12 | 452 | 454 | 1026 | 1026 |
| 2019-06-13 | 481 | 454 | 1026 | 1026 |
| 2019-06-13 | 486 | 454 | 1026 | 1026 |
| 2019-06-13 | 531 | 454 | 1026 | 1026 |
| 2019-06-13 | 546 | 454 | 1026 | 1026 |
| 2019-06-13 | 541 | 454 | 1026 | 1026 |
| 2019-06-13 | 454 | 454 | 1026 | 1026 |
| 2019-06-14 | 450 | 454 | 1026 | 1026 |
| 2019-06-14 | 536 | 454 | 1026 | 1026 |
| 2019-06-14 | 488 | 454 | 1026 | 1026 |
| 2019-06-14 | 482 | 454 | 1026 | 1026 |
| 2019-06-14 | 476 | 454 | 1026 | 1026 |
| 2019-06-14 | 421 | 454 | 1026 | 1026 |
| 2019-06-15 | 421 | 454 | 1026 | 1026 |
| 2019-06-15 | 406 | 454 | 1026 | 1026 |
| 2019-06-15 | 501 | 454 | 1026 | 1026 |
| 2019-06-15 | 483 | 454 | 1026 | 1026 |
| 2019-06-15 | 478 | 454 | 1026 | 1026 |
| 2019-06-15 | 431 | 454 | 1026 | 1026 |
| 2019-06-16 | 474 | 454 | 1026 | 1026 |
| 2019-06-16 | 447 | 454 | 1026 | 1026 |
| 2019-06-16 | 529 | 454 | 1026 | 1026 |
| 2019-06-16 | 615 | 454 | 1026 | 1026 |
| 2019-06-16 | 467 | 454 | 1026 | 1026 |
| 2019-06-16 | 431 | 454 | 1026 | 1026 |
| 2019-06-17 | 425 | 454 | 1026 | 1026 |
| 2019-06-17 | 543 | 454 | 1026 | 1026 |
| 2019-06-17 | 486 | 454 | 1026 | 1026 |
| 2019-06-17 | 466 | 454 | 1026 | 1026 |
| 2019-06-17 | 470 | 454 | 1026 | 1026 |
| 2019-06-17 | 420 | 454 | 1026 | 1026 |
| 2019-06-18 | 421 | 454 | 1026 | 1026 |
| 2019-06-18 | 536 | 454 | 1026 | 1026 |
| 2019-06-18 | 501 | 454 | 1026 | 1026 |
| 2019-06-18 | 417 | 454 | 1026 | 1026 |
| 2019-06-18 | 408 | 454 | 1026 | 1026 |
| 2019-06-18 | 441 | 454 | 1026 | 1026 |
| 2019-06-19 | 437 | 454 | 1026 | 1026 |
| 2019-06-19 | 541 | 454 | 1026 | 1026 |
| 2019-06-19 | 474 | 454 | 1026 | 1026 |
| 2019-06-19 | 599 | 454 | 1026 | 1026 |
| 2019-06-19 | 598 | 454 | 1026 | 1026 |
| 2019-06-19 | 437 | 454 | 1026 | 1026 |
| 2019-06-20 | 431 | 454 | 1026 | 1026 |
| 2019-06-20 | 542 | 454 | 1026 | 1026 |
| 2019-06-20 | 487 | 454 | 1026 | 1026 |
| 2019-06-20 | 490 | 454 | 1026 | 1026 |
| 2019-06-20 | 487 | 454 | 1026 | 1026 |
| 2019-06-20 | 440 | 454 | 1026 | 1026 |
| 2019-06-21 | 419 | 454 | 1026 | 1026 |
| 2019-06-21 | 527 | 454 | 1026 | 1026 |
| 2019-06-21 | 493 | 454 | 1026 | 1026 |
| 2019-06-21 | 494 | 454 | 1026 | 1026 |
| 2019-06-21 | 491 | 454 | 1026 | 1026 |
| 2019-06-21 | 417 | 454 | 1026 | 1026 |
| 2019-06-22 | 422 | 454 | 1026 | 1026 |
| 2019-06-22 | 448 | 454 | 1026 | 1026 |
| 2019-06-22 | 483 | 454 | 1026 | 1026 |
| 2019-06-22 | 490 | 454 | 1026 | 1026 |
| 2019-06-22 | 487 | 454 | 1026 | 1026 |
| 2019-06-22 | 451 | 454 | 1026 | 1026 |
| 2019-06-23 | 449 | 454 | 1026 | 1026 |
| 2019-06-23 | 457 | 454 | 1026 | 1026 |
| 2019-06-23 | 476 | 454 | 1026 | 1026 |
| 2019-06-23 | 490 | 454 | 1026 | 1026 |
| 2019-06-23 | 482 | 454 | 1026 | 1026 |
| 2019-06-23 | 446 | 454 | 1026 | 1026 |
| 2019-06-24 | 453 | 454 | 1026 | 1026 |
| 2019-06-24 | 535 | 454 | 1026 | 1026 |
| 2019-06-24 | 470 | 454 | 1026 | 1026 |
| 2019-06-24 | 466 | 454 | 1026 | 1026 |
| 2019-06-24 | 469 | 454 | 1026 | 1026 |
| 2019-06-24 | 467 | 454 | 1026 | 1026 |
| 2019-06-25 | 486 | 454 | 1026 | 1026 |
| 2019-06-25 | 486 | 454 | 1026 | 1026 |
| 2019-06-25 | 486 | 454 | 1026 | 1026 |
| 2019-06-25 | 486 | 454 | 1026 | 1026 |
| 2019-06-25 | 486 | 454 | 1026 | 1026 |
| 2019-06-25 | 486 | 454 | 1026 | 1026 |
| 2019-06-26 | 412 | 454 | 1026 | 1026 |
| 2019-06-26 | 387 | 454 | 1026 | 1026 |
| 2019-06-26 | 389 | 454 | 1026 | 1026 |
| 2019-06-26 | 384 | 454 | 1026 | 1026 |
| 2019-06-26 | 408 | 454 | 1026 | 1026 |
| 2019-06-26 | 409 | 454 | 1026 | 1026 |
| 2019-06-27 | 477 | 454 | 1026 | 1026 |
| 2019-06-27 | 528 | 454 | 1026 | 1026 |
| 2019-06-27 | 606 | 454 | 1026 | 1026 |
| 2019-06-27 | 608 | 454 | 1026 | 1026 |
| 2019-06-27 | 596 | 454 | 1026 | 1026 |
| 2019-06-27 | 463 | 454 | 1026 | 1026 |
| 2019-06-28 | 456 | 454 | 1026 | 1026 |
| 2019-06-28 | 540 | 454 | 1026 | 1026 |
| 2019-06-28 | 495 | 454 | 1026 | 1026 |
| 2019-06-28 | 483 | 454 | 1026 | 1026 |
| 2019-06-28 | 483 | 454 | 1026 | 1026 |
| 2019-06-28 | 447 | 454 | 1026 | 1026 |
| 2019-06-29 | 453 | 454 | 1026 | 1026 |
| 2019-06-29 | 468 | 454 | 1026 | 1026 |
| 2019-06-29 | 471 | 454 | 1026 | 1026 |
| 2019-06-29 | 474 | 454 | 1026 | 1026 |
| 2019-06-29 | 475 | 454 | 1026 | 1026 |
| 2019-06-29 | 468 | 454 | 1026 | 1026 |
| 2019-06-30 | 478 | 454 | 1026 | 1026 |
| 2019-06-30 | 493 | 454 | 1026 | 1026 |
| 2019-06-30 | 522 | 454 | 1026 | 1026 |
| 2019-06-30 | 502 | 454 | 1026 | 1026 |
| 2019-06-30 | 502 | 454 | 1026 | 1026 |
| 2019-06-30 | 469 | 454 | 1026 | 1026 |
| 2019-07-01 | 453 | 456 | 1026 | 1026 |
| 2019-07-01 | 514 | 456 | 1026 | 1026 |
| 2019-07-01 | 517 | 456 | 1026 | 1026 |
| 2019-07-01 | 522 | 456 | 1026 | 1026 |
| 2019-07-01 | 438 | 456 | 1026 | 1026 |
| 2019-07-01 | 434 | 456 | 1026 | 1026 |
| 2019-07-02 | 430 | 456 | 1026 | 1026 |
| 2019-07-02 | 518 | 456 | 1026 | 1026 |
| 2019-07-02 | 536 | 456 | 1026 | 1026 |
| 2019-07-02 | 569 | 456 | 1026 | 1026 |
| 2019-07-02 | 576 | 456 | 1026 | 1026 |
| 2019-07-02 | 468 | 456 | 1026 | 1026 |
| 2019-07-03 | 397 | 456 | 0 | 456 |
| 2019-07-03 | 480 | 456 | 0 | 480 |
| 2019-07-03 | 493 | 456 | 0 | 493 |
| 2019-07-03 | 466 | 456 | 0 | 466 |
| 2019-07-03 | 370 | 456 | 0 | 456 |
| 2019-07-03 | 422 | 456 | 0 | 456 |
| 2019-07-04 | 442 | 456 | 1026 | 1026 |
| 2019-07-04 | 511 | 456 | 1026 | 1026 |
| 2019-07-04 | 527 | 456 | 1026 | 1026 |
| 2019-07-04 | 559 | 456 | 1026 | 1026 |
| 2019-07-04 | 562 | 456 | 1026 | 1026 |
| 2019-07-04 | 466 | 456 | 1026 | 1026 |
| 2019-07-05 | 427 | 456 | 1026 | 1026 |
| 2019-07-05 | 509 | 456 | 1026 | 1026 |
| 2019-07-05 | 524 | 456 | 1026 | 1026 |
| 2019-07-05 | 551 | 456 | 1026 | 1026 |
| 2019-07-05 | 540 | 456 | 1026 | 1026 |
| 2019-07-05 | 467 | 456 | 1026 | 1026 |
| 2019-07-06 | 428 | 456 | 1026 | 1026 |
| 2019-07-06 | 441 | 456 | 1026 | 1026 |
| 2019-07-06 | 514 | 456 | 1026 | 1026 |
| 2019-07-06 | 572 | 456 | 1026 | 1026 |
| 2019-07-06 | 548 | 456 | 1026 | 1026 |
| 2019-07-06 | 457 | 456 | 1026 | 1026 |
| 2019-07-07 | 426 | 456 | 1026 | 1026 |
| 2019-07-07 | 417 | 456 | 1026 | 1026 |
| 2019-07-07 | 524 | 456 | 1026 | 1026 |
| 2019-07-07 | 595 | 456 | 1026 | 1026 |
| 2019-07-07 | 588 | 456 | 1026 | 1026 |
| 2019-07-07 | 469 | 456 | 1026 | 1026 |
| 2019-07-08 | 428 | 456 | 1026 | 1026 |
| 2019-07-08 | 522 | 456 | 1026 | 1026 |
| 2019-07-08 | 508 | 456 | 1026 | 1026 |
| 2019-07-08 | 537 | 456 | 1026 | 1026 |
| 2019-07-08 | 440 | 456 | 1026 | 1026 |
| 2019-07-08 | 433 | 456 | 1026 | 1026 |
| 2019-07-09 | 489 | 456 | 1026 | 1026 |
| 2019-07-09 | 489 | 456 | 1026 | 1026 |
| 2019-07-09 | 489 | 456 | 1026 | 1026 |
| 2019-07-09 | 489 | 456 | 1026 | 1026 |
| 2019-07-09 | 489 | 456 | 1026 | 1026 |
| 2019-07-09 | 489 | 456 | 1026 | 1026 |
| 2019-07-10 | 407 | 456 | 1026 | 1026 |
| 2019-07-10 | 364 | 456 | 1026 | 1026 |
| 2019-07-10 | 365 | 456 | 1026 | 1026 |
| 2019-07-10 | 364 | 456 | 1026 | 1026 |
| 2019-07-10 | 412 | 456 | 1026 | 1026 |
| 2019-07-10 | 416 | 456 | 1026 | 1026 |
| 2019-07-11 | 440 | 456 | 1026 | 1026 |
| 2019-07-11 | 496 | 456 | 1026 | 1026 |
| 2019-07-11 | 526 | 456 | 1026 | 1026 |
| 2019-07-11 | 531 | 456 | 1026 | 1026 |
| 2019-07-11 | 528 | 456 | 1026 | 1026 |
| 2019-07-11 | 453 | 456 | 1026 | 1026 |
| 2019-07-12 | 439 | 456 | 1026 | 1026 |
| 2019-07-12 | 495 | 456 | 1026 | 1026 |
| 2019-07-12 | 528 | 456 | 1026 | 1026 |
| 2019-07-12 | 543 | 456 | 1026 | 1026 |
| 2019-07-12 | 547 | 456 | 1026 | 1026 |
| 2019-07-12 | 458 | 456 | 1026 | 1026 |
| 2019-07-13 | 437 | 456 | 1026 | 1026 |
| 2019-07-13 | 380 | 456 | 1026 | 1026 |
| 2019-07-13 | 531 | 456 | 1026 | 1026 |
| 2019-07-13 | 611 | 456 | 1026 | 1026 |
| 2019-07-13 | 613 | 456 | 1026 | 1026 |
| 2019-07-13 | 467 | 456 | 1026 | 1026 |
| 2019-07-14 | 433 | 456 | 1026 | 1026 |
| 2019-07-14 | 376 | 456 | 1026 | 1026 |
| 2019-07-14 | 537 | 456 | 1026 | 1026 |
| 2019-07-14 | 623 | 456 | 1026 | 1026 |
| 2019-07-14 | 616 | 456 | 1026 | 1026 |
| 2019-07-14 | 440 | 456 | 1026 | 1026 |
| 2019-07-15 | 435 | 456 | 1026 | 1026 |
| 2019-07-15 | 491 | 456 | 1026 | 1026 |
| 2019-07-15 | 541 | 456 | 1026 | 1026 |
| 2019-07-15 | 562 | 456 | 1026 | 1026 |
| 2019-07-15 | 563 | 456 | 1026 | 1026 |
| 2019-07-15 | 459 | 456 | 1026 | 1026 |
| 2019-07-16 | 427 | 456 | 1026 | 1026 |
| 2019-07-16 | 492 | 456 | 1026 | 1026 |
| 2019-07-16 | 531 | 456 | 1026 | 1026 |
| 2019-07-16 | 562 | 456 | 1026 | 1026 |
| 2019-07-16 | 566 | 456 | 1026 | 1026 |
| 2019-07-16 | 462 | 456 | 1026 | 1026 |
| 2019-07-17 | 425 | 456 | 1026 | 1026 |
| 2019-07-17 | 498 | 456 | 1026 | 1026 |
| 2019-07-17 | 524 | 456 | 1026 | 1026 |
| 2019-07-17 | 562 | 456 | 1026 | 1026 |
| 2019-07-17 | 565 | 456 | 1026 | 1026 |
| 2019-07-17 | 463 | 456 | 1026 | 1026 |
| 2019-07-18 | 427 | 456 | 1026 | 1026 |
| 2019-07-18 | 498 | 456 | 1026 | 1026 |
| 2019-07-18 | 547 | 456 | 1026 | 1026 |
| 2019-07-18 | 574 | 456 | 1026 | 1026 |
| 2019-07-18 | 576 | 456 | 1026 | 1026 |
| 2019-07-18 | 446 | 456 | 1026 | 1026 |
| 2019-07-19 | 442 | 456 | 1026 | 1026 |
| 2019-07-19 | 486 | 456 | 1026 | 1026 |
| 2019-07-19 | 522 | 456 | 1026 | 1026 |
| 2019-07-19 | 580 | 456 | 1026 | 1026 |
| 2019-07-19 | 547 | 456 | 1026 | 1026 |
| 2019-07-19 | 432 | 456 | 1026 | 1026 |
| 2019-07-20 | 441 | 456 | 1026 | 1026 |
| 2019-07-20 | 425 | 456 | 1026 | 1026 |
| 2019-07-20 | 559 | 456 | 1026 | 1026 |
| 2019-07-20 | 598 | 456 | 1026 | 1026 |
| 2019-07-20 | 571 | 456 | 1026 | 1026 |
| 2019-07-20 | 522 | 456 | 1026 | 1026 |
| 2019-07-21 | 455 | 456 | 1026 | 1026 |
| 2019-07-21 | 416 | 456 | 1026 | 1026 |
| 2019-07-21 | 523 | 456 | 1026 | 1026 |
| 2019-07-21 | 590 | 456 | 1026 | 1026 |
| 2019-07-21 | 605 | 456 | 1026 | 1026 |
| 2019-07-21 | 451 | 456 | 1026 | 1026 |
| 2019-07-22 | 441 | 456 | 1026 | 1026 |
| 2019-07-22 | 512 | 456 | 1026 | 1026 |
| 2019-07-22 | 559 | 456 | 1026 | 1026 |
| 2019-07-22 | 581 | 456 | 1026 | 1026 |
| 2019-07-22 | 559 | 456 | 1026 | 1026 |
| 2019-07-22 | 453 | 456 | 1026 | 1026 |
| 2019-07-23 | 431 | 456 | 1026 | 1026 |
| 2019-07-23 | 494 | 456 | 1026 | 1026 |
| 2019-07-23 | 522 | 456 | 1026 | 1026 |
| 2019-07-23 | 531 | 456 | 1026 | 1026 |
| 2019-07-23 | 536 | 456 | 1026 | 1026 |
| 2019-07-23 | 475 | 456 | 1026 | 1026 |
| 2019-07-24 | 454 | 456 | 1026 | 1026 |
| 2019-07-24 | 507 | 456 | 1026 | 1026 |
| 2019-07-24 | 519 | 456 | 1026 | 1026 |
| 2019-07-24 | 538 | 456 | 1026 | 1026 |
| 2019-07-24 | 539 | 456 | 1026 | 1026 |
| 2019-07-24 | 464 | 456 | 1026 | 1026 |
| 2019-07-25 | 432 | 456 | 1026 | 1026 |
| 2019-07-25 | 455 | 456 | 1026 | 1026 |
| 2019-07-25 | 533 | 456 | 1026 | 1026 |
| 2019-07-25 | 543 | 456 | 1026 | 1026 |
| 2019-07-25 | 543 | 456 | 1026 | 1026 |
| 2019-07-25 | 460 | 456 | 1026 | 1026 |
| 2019-07-26 | 452 | 456 | 1026 | 1026 |
| 2019-07-26 | 500 | 456 | 1026 | 1026 |
| 2019-07-26 | 521 | 456 | 1026 | 1026 |
| 2019-07-26 | 557 | 456 | 1026 | 1026 |
| 2019-07-26 | 560 | 456 | 1026 | 1026 |
| 2019-07-26 | 458 | 456 | 1026 | 1026 |
| 2019-07-27 | 443 | 456 | 1026 | 1026 |
| 2019-07-27 | 490 | 456 | 1026 | 1026 |
| 2019-07-27 | 543 | 456 | 1026 | 1026 |
| 2019-07-27 | 545 | 456 | 1026 | 1026 |
| 2019-07-27 | 479 | 456 | 1026 | 1026 |
| 2019-07-27 | 444 | 456 | 1026 | 1026 |
| 2019-07-28 | 453 | 456 | 1026 | 1026 |
| 2019-07-28 | 445 | 456 | 1026 | 1026 |
| 2019-07-28 | 547 | 456 | 1026 | 1026 |
| 2019-07-28 | 593 | 456 | 1026 | 1026 |
| 2019-07-28 | 520 | 456 | 1026 | 1026 |
| 2019-07-28 | 445 | 456 | 1026 | 1026 |
| 2019-07-29 | 440 | 456 | 1026 | 1026 |
| 2019-07-29 | 491 | 456 | 1026 | 1026 |
| 2019-07-29 | 528 | 456 | 1026 | 1026 |
| 2019-07-29 | 568 | 456 | 1026 | 1026 |
| 2019-07-29 | 548 | 456 | 1026 | 1026 |
| 2019-07-29 | 464 | 456 | 1026 | 1026 |
| 2019-07-30 | 446 | 456 | 1026 | 1026 |
| 2019-07-30 | 502 | 456 | 1026 | 1026 |
| 2019-07-30 | 521 | 456 | 1026 | 1026 |
| 2019-07-30 | 538 | 456 | 1026 | 1026 |
| 2019-07-30 | 524 | 456 | 1026 | 1026 |
| 2019-07-30 | 460 | 456 | 1026 | 1026 |
| 2019-07-31 | 458 | 456 | 1026 | 1026 |
| 2019-07-31 | 511 | 456 | 1026 | 1026 |
| 2019-07-31 | 580 | 456 | 1026 | 1026 |
| 2019-07-31 | 582 | 456 | 1026 | 1026 |
| 2019-07-31 | 577 | 456 | 1026 | 1026 |
| 2019-07-31 | 455 | 456 | 1026 | 1026 |
| 2019-08-01 | 453 | 461 | 1026 | 1026 |
| 2019-08-01 | 510 | 461 | 1026 | 1026 |
| 2019-08-01 | 531 | 461 | 1026 | 1026 |
| 2019-08-01 | 538 | 461 | 1026 | 1026 |
| 2019-08-01 | 543 | 461 | 1026 | 1026 |
| 2019-08-01 | 438 | 461 | 1026 | 1026 |
| 2019-08-02 | 428 | 461 | 1026 | 1026 |
| 2019-08-02 | 527 | 461 | 1026 | 1026 |
| 2019-08-02 | 553 | 461 | 1026 | 1026 |
| 2019-08-02 | 605 | 461 | 1026 | 1026 |
| 2019-08-02 | 606 | 461 | 1026 | 1026 |
| 2019-08-02 | 457 | 461 | 1026 | 1026 |
| 2019-08-03 | 430 | 461 | 1026 | 1026 |
| 2019-08-03 | 496 | 461 | 1026 | 1026 |
| 2019-08-03 | 525 | 461 | 1026 | 1026 |
| 2019-08-03 | 592 | 461 | 1026 | 1026 |
| 2019-08-03 | 595 | 461 | 1026 | 1026 |
| 2019-08-03 | 425 | 461 | 1026 | 1026 |
| 2019-08-04 | 424 | 461 | 1026 | 1026 |
| 2019-08-04 | 380 | 461 | 1026 | 1026 |
| 2019-08-04 | 521 | 461 | 1026 | 1026 |
| 2019-08-04 | 629 | 461 | 1026 | 1026 |
| 2019-08-04 | 588 | 461 | 1026 | 1026 |
| 2019-08-04 | 438 | 461 | 1026 | 1026 |
| 2019-08-05 | 424 | 461 | 1026 | 1026 |
| 2019-08-05 | 521 | 461 | 1026 | 1026 |
| 2019-08-05 | 537 | 461 | 1026 | 1026 |
| 2019-08-05 | 625 | 461 | 1026 | 1026 |
| 2019-08-05 | 531 | 461 | 1026 | 1026 |
| 2019-08-05 | 450 | 461 | 1026 | 1026 |
| 2019-08-06 | 451 | 461 | 1026 | 1026 |
| 2019-08-06 | 527 | 461 | 1026 | 1026 |
| 2019-08-06 | 537 | 461 | 1026 | 1026 |
| 2019-08-06 | 585 | 461 | 1026 | 1026 |
| 2019-08-06 | 597 | 461 | 1026 | 1026 |
| 2019-08-06 | 443 | 461 | 1026 | 1026 |
| 2019-08-07 | 450 | 461 | 1026 | 1026 |
| 2019-08-07 | 536 | 461 | 1026 | 1026 |
| 2019-08-07 | 555 | 461 | 1026 | 1026 |
| 2019-08-07 | 621 | 461 | 1026 | 1026 |
| 2019-08-07 | 576 | 461 | 1026 | 1026 |
| 2019-08-07 | 521 | 461 | 1026 | 1026 |
| 2019-08-08 | 453 | 461 | 1026 | 1026 |
| 2019-08-08 | 512 | 461 | 1026 | 1026 |
| 2019-08-08 | 535 | 461 | 1026 | 1026 |
| 2019-08-08 | 549 | 461 | 1026 | 1026 |
| 2019-08-08 | 544 | 461 | 1026 | 1026 |
| 2019-08-08 | 429 | 461 | 1026 | 1026 |
| 2019-08-09 | 442 | 461 | 1026 | 1026 |
| 2019-08-09 | 515 | 461 | 1026 | 1026 |
| 2019-08-09 | 590 | 461 | 1026 | 1026 |
| 2019-08-09 | 621 | 461 | 1026 | 1026 |
| 2019-08-09 | 575 | 461 | 1026 | 1026 |
| 2019-08-09 | 457 | 461 | 1026 | 1026 |
| 2019-08-10 | 446 | 461 | 1026 | 1026 |
| 2019-08-10 | 446 | 461 | 1026 | 1026 |
| 2019-08-10 | 565 | 461 | 1026 | 1026 |
| 2019-08-10 | 596 | 461 | 1026 | 1026 |
| 2019-08-10 | 579 | 461 | 1026 | 1026 |
| 2019-08-10 | 526 | 461 | 1026 | 1026 |
| 2019-08-11 | 448 | 461 | 1026 | 1026 |
| 2019-08-11 | 445 | 461 | 1026 | 1026 |
| 2019-08-11 | 603 | 461 | 1026 | 1026 |
| 2019-08-11 | 624 | 461 | 1026 | 1026 |
| 2019-08-11 | 575 | 461 | 1026 | 1026 |
| 2019-08-11 | 447 | 461 | 1026 | 1026 |
| 2019-08-12 | 447 | 461 | 1026 | 1026 |
| 2019-08-12 | 522 | 461 | 1026 | 1026 |
| 2019-08-12 | 542 | 461 | 1026 | 1026 |
| 2019-08-12 | 565 | 461 | 1026 | 1026 |
| 2019-08-12 | 515 | 461 | 1026 | 1026 |
| 2019-08-12 | 443 | 461 | 1026 | 1026 |
| 2019-08-13 | 442 | 461 | 1026 | 1026 |
| 2019-08-13 | 524 | 461 | 1026 | 1026 |
| 2019-08-13 | 548 | 461 | 1026 | 1026 |
| 2019-08-13 | 590 | 461 | 1026 | 1026 |
| 2019-08-13 | 586 | 461 | 1026 | 1026 |
| 2019-08-13 | 430 | 461 | 1026 | 1026 |
| 2019-08-14 | 434 | 461 | 1026 | 1026 |
| 2019-08-14 | 533 | 461 | 1026 | 1026 |
| 2019-08-14 | 550 | 461 | 1026 | 1026 |
| 2019-08-14 | 593 | 461 | 1026 | 1026 |
| 2019-08-14 | 525 | 461 | 1026 | 1026 |
| 2019-08-14 | 450 | 461 | 1026 | 1026 |
| 2019-08-15 | 453 | 461 | 1026 | 1026 |
| 2019-08-15 | 437 | 461 | 1026 | 1026 |
| 2019-08-15 | 589 | 461 | 1026 | 1026 |
| 2019-08-15 | 623 | 461 | 1026 | 1026 |
| 2019-08-15 | 580 | 461 | 1026 | 1026 |
| 2019-08-15 | 450 | 461 | 1026 | 1026 |
| 2019-08-16 | 426 | 461 | 1026 | 1026 |
| 2019-08-16 | 452 | 461 | 1026 | 1026 |
| 2019-08-16 | 562 | 461 | 1026 | 1026 |
| 2019-08-16 | 610 | 461 | 1026 | 1026 |
| 2019-08-16 | 535 | 461 | 1026 | 1026 |
| 2019-08-16 | 449 | 461 | 1026 | 1026 |
| 2019-08-17 | 466 | 461 | 1026 | 1026 |
| 2019-08-17 | 455 | 461 | 1026 | 1026 |
| 2019-08-17 | 567 | 461 | 1026 | 1026 |
| 2019-08-17 | 597 | 461 | 1026 | 1026 |
| 2019-08-17 | 583 | 461 | 1026 | 1026 |
| 2019-08-17 | 446 | 461 | 1026 | 1026 |
| 2019-08-18 | 450 | 461 | 1026 | 1026 |
| 2019-08-18 | 383 | 461 | 1026 | 1026 |
| 2019-08-18 | 500 | 461 | 1026 | 1026 |
| 2019-08-18 | 616 | 461 | 1026 | 1026 |
| 2019-08-18 | 609 | 461 | 1026 | 1026 |
| 2019-08-18 | 526 | 461 | 1026 | 1026 |
| 2019-08-19 | 449 | 461 | 1026 | 1026 |
| 2019-08-19 | 526 | 461 | 1026 | 1026 |
| 2019-08-19 | 588 | 461 | 1026 | 1026 |
| 2019-08-19 | 599 | 461 | 1026 | 1026 |
| 2019-08-19 | 576 | 461 | 1026 | 1026 |
| 2019-08-19 | 515 | 461 | 1026 | 1026 |
| 2019-08-20 | 449 | 461 | 1026 | 1026 |
| 2019-08-20 | 539 | 461 | 1026 | 1026 |
| 2019-08-20 | 545 | 461 | 1026 | 1026 |
| 2019-08-20 | 552 | 461 | 1026 | 1026 |
| 2019-08-20 | 572 | 461 | 1026 | 1026 |
| 2019-08-20 | 433 | 461 | 1026 | 1026 |
| 2019-08-21 | 429 | 461 | 1026 | 1026 |
| 2019-08-21 | 540 | 461 | 1026 | 1026 |
| 2019-08-21 | 541 | 461 | 1026 | 1026 |
| 2019-08-21 | 593 | 461 | 1026 | 1026 |
| 2019-08-21 | 578 | 461 | 1026 | 1026 |
| 2019-08-21 | 419 | 461 | 1026 | 1026 |
| 2019-08-22 | 427 | 461 | 1026 | 1026 |
| 2019-08-22 | 540 | 461 | 1026 | 1026 |
| 2019-08-22 | 530 | 461 | 1026 | 1026 |
| 2019-08-22 | 564 | 461 | 1026 | 1026 |
| 2019-08-22 | 567 | 461 | 1026 | 1026 |
| 2019-08-22 | 427 | 461 | 1026 | 1026 |
| 2019-08-23 | 427 | 461 | 1026 | 1026 |
| 2019-08-23 | 538 | 461 | 1026 | 1026 |
| 2019-08-23 | 534 | 461 | 1026 | 1026 |
| 2019-08-23 | 567 | 461 | 1026 | 1026 |
| 2019-08-23 | 562 | 461 | 1026 | 1026 |
| 2019-08-23 | 432 | 461 | 1026 | 1026 |
| 2019-08-24 | 431 | 461 | 1026 | 1026 |
| 2019-08-24 | 445 | 461 | 1026 | 1026 |
| 2019-08-24 | 528 | 461 | 1026 | 1026 |
| 2019-08-24 | 614 | 461 | 1026 | 1026 |
| 2019-08-24 | 579 | 461 | 1026 | 1026 |
| 2019-08-24 | 433 | 461 | 1026 | 1026 |
| 2019-08-25 | 427 | 461 | 1026 | 1026 |
| 2019-08-25 | 432 | 461 | 1026 | 1026 |
| 2019-08-25 | 520 | 461 | 1026 | 1026 |
| 2019-08-25 | 636 | 461 | 1026 | 1026 |
| 2019-08-25 | 590 | 461 | 1026 | 1026 |
| 2019-08-25 | 436 | 461 | 1026 | 1026 |
| 2019-08-26 | 425 | 461 | 1026 | 1026 |
| 2019-08-26 | 525 | 461 | 1026 | 1026 |
| 2019-08-26 | 532 | 461 | 1026 | 1026 |
| 2019-08-26 | 545 | 461 | 1026 | 1026 |
| 2019-08-26 | 550 | 461 | 1026 | 1026 |
| 2019-08-26 | 444 | 461 | 1026 | 1026 |
| 2019-08-27 | 428 | 461 | 1026 | 1026 |
| 2019-08-27 | 537 | 461 | 1026 | 1026 |
| 2019-08-27 | 527 | 461 | 1026 | 1026 |
| 2019-08-27 | 536 | 461 | 1026 | 1026 |
| 2019-08-27 | 537 | 461 | 1026 | 1026 |
| 2019-08-27 | 447 | 461 | 1026 | 1026 |
| 2019-08-28 | 447 | 461 | 1026 | 1026 |
| 2019-08-28 | 534 | 461 | 1026 | 1026 |
| 2019-08-28 | 525 | 461 | 1026 | 1026 |
| 2019-08-28 | 540 | 461 | 1026 | 1026 |
| 2019-08-28 | 494 | 461 | 1026 | 1026 |
| 2019-08-28 | 444 | 461 | 1026 | 1026 |
| 2019-08-29 | 443 | 461 | 1026 | 1026 |
| 2019-08-29 | 540 | 461 | 1026 | 1026 |
| 2019-08-29 | 536 | 461 | 1026 | 1026 |
| 2019-08-29 | 544 | 461 | 1026 | 1026 |
| 2019-08-29 | 549 | 461 | 1026 | 1026 |
| 2019-08-29 | 436 | 461 | 1026 | 1026 |
| 2019-08-30 | 439 | 461 | 1026 | 1026 |
| 2019-08-30 | 541 | 461 | 1026 | 1026 |
| 2019-08-30 | 536 | 461 | 1026 | 1026 |
| 2019-08-30 | 567 | 461 | 1026 | 1026 |
| 2019-08-30 | 557 | 461 | 1026 | 1026 |
| 2019-08-30 | 426 | 461 | 1026 | 1026 |
| 2019-08-31 | 430 | 461 | 1026 | 1026 |
| 2019-08-31 | 444 | 461 | 1026 | 1026 |
| 2019-08-31 | 530 | 461 | 1026 | 1026 |
| 2019-08-31 | 631 | 461 | 1026 | 1026 |
| 2019-08-31 | 559 | 461 | 1026 | 1026 |
| 2019-08-31 | 446 | 461 | 1026 | 1026 |
| 2019-09-01 | 452 | 462 | 1026 | 1026 |
| 2019-09-01 | 395 | 462 | 1026 | 1026 |
| 2019-09-01 | 505 | 462 | 1026 | 1026 |
| 2019-09-01 | 619 | 462 | 1026 | 1026 |
| 2019-09-01 | 531 | 462 | 1026 | 1026 |
| 2019-09-01 | 452 | 462 | 1026 | 1026 |
| 2019-09-02 | 447 | 462 | 1026 | 1026 |
| 2019-09-02 | 533 | 462 | 1026 | 1026 |
| 2019-09-02 | 565 | 462 | 1026 | 1026 |
| 2019-09-02 | 581 | 462 | 1026 | 1026 |
| 2019-09-02 | 530 | 462 | 1026 | 1026 |
| 2019-09-02 | 441 | 462 | 1026 | 1026 |
| 2019-09-03 | 453 | 462 | 1026 | 1026 |
| 2019-09-03 | 529 | 462 | 1026 | 1026 |
| 2019-09-03 | 574 | 462 | 1026 | 1026 |
| 2019-09-03 | 575 | 462 | 1026 | 1026 |
| 2019-09-03 | 526 | 462 | 1026 | 1026 |
| 2019-09-03 | 446 | 462 | 1026 | 1026 |
| 2019-09-04 | 455 | 462 | 1026 | 1026 |
| 2019-09-04 | 506 | 462 | 1026 | 1026 |
| 2019-09-04 | 582 | 462 | 1026 | 1026 |
| 2019-09-04 | 593 | 462 | 1026 | 1026 |
| 2019-09-04 | 534 | 462 | 1026 | 1026 |
| 2019-09-04 | 506 | 462 | 1026 | 1026 |
| 2019-09-05 | 459 | 462 | 1026 | 1026 |
| 2019-09-05 | 512 | 462 | 1026 | 1026 |
| 2019-09-05 | 591 | 462 | 1026 | 1026 |
| 2019-09-05 | 604 | 462 | 1026 | 1026 |
| 2019-09-05 | 549 | 462 | 1026 | 1026 |
| 2019-09-05 | 455 | 462 | 1026 | 1026 |
| 2019-09-06 | 434 | 462 | 1026 | 1026 |
| 2019-09-06 | 537 | 462 | 1026 | 1026 |
| 2019-09-06 | 606 | 462 | 1026 | 1026 |
| 2019-09-06 | 606 | 462 | 1026 | 1026 |
| 2019-09-06 | 525 | 462 | 1026 | 1026 |
| 2019-09-06 | 503 | 462 | 1026 | 1026 |
| 2019-09-07 | 438 | 462 | 1026 | 1026 |
| 2019-09-07 | 460 | 462 | 1026 | 1026 |
| 2019-09-07 | 538 | 462 | 1026 | 1026 |
| 2019-09-07 | 621 | 462 | 1026 | 1026 |
| 2019-09-07 | 541 | 462 | 1026 | 1026 |
| 2019-09-07 | 504 | 462 | 1026 | 1026 |
| 2019-09-08 | 449 | 462 | 1026 | 1026 |
| 2019-09-08 | 411 | 462 | 1026 | 1026 |
| 2019-09-08 | 519 | 462 | 1026 | 1026 |
| 2019-09-08 | 624 | 462 | 1026 | 1026 |
| 2019-09-08 | 563 | 462 | 1026 | 1026 |
| 2019-09-08 | 437 | 462 | 1026 | 1026 |
| 2019-09-09 | 431 | 462 | 1026 | 1026 |
| 2019-09-09 | 533 | 462 | 1026 | 1026 |
| 2019-09-09 | 572 | 462 | 1026 | 1026 |
| 2019-09-09 | 602 | 462 | 1026 | 1026 |
| 2019-09-09 | 540 | 462 | 1026 | 1026 |
| 2019-09-09 | 434 | 462 | 1026 | 1026 |
| 2019-09-10 | 431 | 462 | 1026 | 1026 |
| 2019-09-10 | 537 | 462 | 1026 | 1026 |
| 2019-09-10 | 520 | 462 | 1026 | 1026 |
| 2019-09-10 | 593 | 462 | 1026 | 1026 |
| 2019-09-10 | 541 | 462 | 1026 | 1026 |
| 2019-09-10 | 423 | 462 | 1026 | 1026 |
| 2019-09-11 | 434 | 462 | 1026 | 1026 |
| 2019-09-11 | 536 | 462 | 1026 | 1026 |
| 2019-09-11 | 586 | 462 | 1026 | 1026 |
| 2019-09-11 | 592 | 462 | 1026 | 1026 |
| 2019-09-11 | 537 | 462 | 1026 | 1026 |
| 2019-09-11 | 504 | 462 | 1026 | 1026 |
| 2019-09-12 | 467 | 462 | 1026 | 1026 |
| 2019-09-12 | 544 | 462 | 1026 | 1026 |
| 2019-09-12 | 524 | 462 | 1026 | 1026 |
| 2019-09-12 | 589 | 462 | 1026 | 1026 |
| 2019-09-12 | 513 | 462 | 1026 | 1026 |
| 2019-09-12 | 501 | 462 | 1026 | 1026 |
| 2019-09-13 | 460 | 462 | 1026 | 1026 |
| 2019-09-13 | 520 | 462 | 1026 | 1026 |
| 2019-09-13 | 503 | 462 | 1026 | 1026 |
| 2019-09-13 | 573 | 462 | 1026 | 1026 |
| 2019-09-13 | 575 | 462 | 1026 | 1026 |
| 2019-09-13 | 435 | 462 | 1026 | 1026 |
| 2019-09-14 | 432 | 462 | 1026 | 1026 |
| 2019-09-14 | 454 | 462 | 1026 | 1026 |
| 2019-09-14 | 515 | 462 | 1026 | 1026 |
| 2019-09-14 | 584 | 462 | 1026 | 1026 |
| 2019-09-14 | 525 | 462 | 1026 | 1026 |
| 2019-09-14 | 428 | 462 | 1026 | 1026 |
| 2019-09-15 | 432 | 462 | 1026 | 1026 |
| 2019-09-15 | 379 | 462 | 1026 | 1026 |
| 2019-09-15 | 510 | 462 | 1026 | 1026 |
| 2019-09-15 | 633 | 462 | 1026 | 1026 |
| 2019-09-15 | 517 | 462 | 1026 | 1026 |
| 2019-09-15 | 448 | 462 | 1026 | 1026 |
| 2019-09-16 | 430 | 462 | 1026 | 1026 |
| 2019-09-16 | 534 | 462 | 1026 | 1026 |
| 2019-09-16 | 575 | 462 | 1026 | 1026 |
| 2019-09-16 | 585 | 462 | 1026 | 1026 |
| 2019-09-16 | 516 | 462 | 1026 | 1026 |
| 2019-09-16 | 434 | 462 | 1026 | 1026 |
| 2019-09-17 | 435 | 462 | 1026 | 1026 |
| 2019-09-17 | 539 | 462 | 1026 | 1026 |
| 2019-09-17 | 537 | 462 | 1026 | 1026 |
| 2019-09-17 | 578 | 462 | 1026 | 1026 |
| 2019-09-17 | 535 | 462 | 1026 | 1026 |
| 2019-09-17 | 456 | 462 | 1026 | 1026 |
| 2019-09-18 | 440 | 462 | 1026 | 1026 |
| 2019-09-18 | 540 | 462 | 1026 | 1026 |
| 2019-09-18 | 534 | 462 | 1026 | 1026 |
| 2019-09-18 | 575 | 462 | 1026 | 1026 |
| 2019-09-18 | 540 | 462 | 1026 | 1026 |
| 2019-09-18 | 449 | 462 | 1026 | 1026 |
| 2019-09-19 | 432 | 462 | 1026 | 1026 |
| 2019-09-19 | 538 | 462 | 1026 | 1026 |
| 2019-09-19 | 528 | 462 | 1026 | 1026 |
| 2019-09-19 | 599 | 462 | 1026 | 1026 |
| 2019-09-19 | 545 | 462 | 1026 | 1026 |
| 2019-09-19 | 445 | 462 | 1026 | 1026 |
| 2019-09-20 | 434 | 462 | 1026 | 1026 |
| 2019-09-20 | 540 | 462 | 1026 | 1026 |
| 2019-09-20 | 523 | 462 | 1026 | 1026 |
| 2019-09-20 | 585 | 462 | 1026 | 1026 |
| 2019-09-20 | 531 | 462 | 1026 | 1026 |
| 2019-09-20 | 461 | 462 | 1026 | 1026 |
| 2019-09-21 | 468 | 462 | 1026 | 1026 |
| 2019-09-21 | 472 | 462 | 1026 | 1026 |
| 2019-09-21 | 527 | 462 | 1026 | 1026 |
| 2019-09-21 | 644 | 462 | 1026 | 1026 |
| 2019-09-21 | 504 | 462 | 1026 | 1026 |
| 2019-09-21 | 471 | 462 | 1026 | 1026 |
| 2019-09-22 | 474 | 462 | 1026 | 1026 |
| 2019-09-22 | 457 | 462 | 1026 | 1026 |
| 2019-09-22 | 529 | 462 | 1026 | 1026 |
| 2019-09-22 | 630 | 462 | 1026 | 1026 |
| 2019-09-22 | 519 | 462 | 1026 | 1026 |
| 2019-09-22 | 459 | 462 | 1026 | 1026 |
| 2019-09-23 | 439 | 462 | 1026 | 1026 |
| 2019-09-23 | 528 | 462 | 1026 | 1026 |
| 2019-09-23 | 489 | 462 | 0 | 489 |
| 2019-09-23 | 529 | 462 | 0 | 529 |
| 2019-09-23 | 479 | 462 | 0 | 479 |
| 2019-09-23 | 429 | 462 | 0 | 462 |
| 2019-09-24 | 445 | 462 | 0 | 462 |
| 2019-09-24 | 480 | 462 | 0 | 480 |
| 2019-09-24 | 531 | 462 | 0 | 531 |
| 2019-09-24 | 529 | 462 | 0 | 529 |
| 2019-09-24 | 508 | 462 | 0 | 508 |
| 2019-09-24 | 466 | 462 | 0 | 466 |
| 2019-09-25 | 441 | 462 | 0 | 462 |
| 2019-09-25 | 472 | 462 | 0 | 472 |
| 2019-09-25 | 535 | 462 | 0 | 535 |
| 2019-09-25 | 524 | 462 | 0 | 524 |
| 2019-09-25 | 509 | 462 | 0 | 509 |
| 2019-09-25 | 466 | 462 | 0 | 466 |
| 2019-09-26 | 445 | 462 | 0 | 462 |
| 2019-09-26 | 476 | 462 | 0 | 476 |
| 2019-09-26 | 534 | 462 | 0 | 534 |
| 2019-09-26 | 531 | 462 | 0 | 531 |
| 2019-09-26 | 499 | 462 | 0 | 499 |
| 2019-09-26 | 457 | 462 | 1026 | 1026 |
| 2019-09-27 | 459 | 462 | 1026 | 1026 |
| 2019-09-27 | 505 | 462 | 1026 | 1026 |
| 2019-09-27 | 594 | 462 | 1026 | 1026 |
| 2019-09-27 | 613 | 462 | 1026 | 1026 |
| 2019-09-27 | 524 | 462 | 1026 | 1026 |
| 2019-09-27 | 505 | 462 | 1026 | 1026 |
| 2019-09-28 | 456 | 462 | 1026 | 1026 |
| 2019-09-28 | 479 | 462 | 1026 | 1026 |
| 2019-09-28 | 581 | 462 | 1026 | 1026 |
| 2019-09-28 | 582 | 462 | 1026 | 1026 |
| 2019-09-28 | 535 | 462 | 1026 | 1026 |
| 2019-09-28 | 500 | 462 | 1026 | 1026 |
| 2019-09-29 | 462 | 462 | 1026 | 1026 |
| 2019-09-29 | 450 | 462 | 1026 | 1026 |
| 2019-09-29 | 574 | 462 | 1026 | 1026 |
| 2019-09-29 | 576 | 462 | 1026 | 1026 |
| 2019-09-29 | 526 | 462 | 1026 | 1026 |
| 2019-09-29 | 513 | 462 | 1026 | 1026 |
| 2019-09-30 | 452 | 462 | 1026 | 1026 |
| 2019-09-30 | 508 | 462 | 1026 | 1026 |
| 2019-09-30 | 559 | 462 | 1026 | 1026 |
| 2019-09-30 | 586 | 462 | 1026 | 1026 |
| 2019-09-30 | 528 | 462 | 1026 | 1026 |
| 2019-09-30 | 463 | 462 | 1026 | 1026 |
| 2019-10-01 | 463 | 464 | 1026 | 1026 |
| 2019-10-01 | 519 | 464 | 1026 | 1026 |
| 2019-10-01 | 548 | 464 | 1026 | 1026 |
| 2019-10-01 | 569 | 464 | 1026 | 1026 |
| 2019-10-01 | 544 | 464 | 1026 | 1026 |
| 2019-10-01 | 450 | 464 | 1026 | 1026 |
| 2019-10-02 | 445 | 464 | 1026 | 1026 |
| 2019-10-02 | 531 | 464 | 1026 | 1026 |
| 2019-10-02 | 568 | 464 | 1026 | 1026 |
| 2019-10-02 | 601 | 464 | 1026 | 1026 |
| 2019-10-02 | 545 | 464 | 1026 | 1026 |
| 2019-10-02 | 454 | 464 | 1026 | 1026 |
| 2019-10-03 | 453 | 464 | 1026 | 1026 |
| 2019-10-03 | 536 | 464 | 1026 | 1026 |
| 2019-10-03 | 560 | 464 | 1026 | 1026 |
| 2019-10-03 | 598 | 464 | 1026 | 1026 |
| 2019-10-03 | 546 | 464 | 1026 | 1026 |
| 2019-10-03 | 460 | 464 | 1026 | 1026 |
| 2019-10-04 | 453 | 464 | 1026 | 1026 |
| 2019-10-04 | 523 | 464 | 1026 | 1026 |
| 2019-10-04 | 563 | 464 | 1026 | 1026 |
| 2019-10-04 | 577 | 464 | 1026 | 1026 |
| 2019-10-04 | 550 | 464 | 1026 | 1026 |
| 2019-10-04 | 463 | 464 | 1026 | 1026 |
| 2019-10-05 | 439 | 464 | 1026 | 1026 |
| 2019-10-05 | 412 | 464 | 1026 | 1026 |
| 2019-10-05 | 553 | 464 | 1026 | 1026 |
| 2019-10-05 | 637 | 464 | 1026 | 1026 |
| 2019-10-05 | 559 | 464 | 1026 | 1026 |
| 2019-10-05 | 467 | 464 | 1026 | 1026 |
| 2019-10-06 | 449 | 464 | 1026 | 1026 |
| 2019-10-06 | 402 | 464 | 1026 | 1026 |
| 2019-10-06 | 506 | 464 | 1026 | 1026 |
| 2019-10-06 | 587 | 464 | 1026 | 1026 |
| 2019-10-06 | 552 | 464 | 1026 | 1026 |
| 2019-10-06 | 447 | 464 | 1026 | 1026 |
| 2019-10-07 | 453 | 464 | 1026 | 1026 |
| 2019-10-07 | 534 | 464 | 1026 | 1026 |
| 2019-10-07 | 513 | 464 | 1026 | 1026 |
| 2019-10-07 | 611 | 464 | 1026 | 1026 |
| 2019-10-07 | 550 | 464 | 1026 | 1026 |
| 2019-10-07 | 449 | 464 | 1026 | 1026 |
| 2019-10-08 | 448 | 464 | 1026 | 1026 |
| 2019-10-08 | 534 | 464 | 1026 | 1026 |
| 2019-10-08 | 545 | 464 | 1026 | 1026 |
| 2019-10-08 | 567 | 464 | 1026 | 1026 |
| 2019-10-08 | 551 | 464 | 1026 | 1026 |
| 2019-10-08 | 445 | 464 | 1026 | 1026 |
| 2019-10-09 | 447 | 464 | 1026 | 1026 |
| 2019-10-09 | 535 | 464 | 1026 | 1026 |
| 2019-10-09 | 570 | 464 | 1026 | 1026 |
| 2019-10-09 | 568 | 464 | 1026 | 1026 |
| 2019-10-09 | 555 | 464 | 1026 | 1026 |
| 2019-10-09 | 449 | 464 | 1026 | 1026 |
| 2019-10-10 | 461 | 464 | 1026 | 1026 |
| 2019-10-10 | 523 | 464 | 1026 | 1026 |
| 2019-10-10 | 586 | 464 | 1026 | 1026 |
| 2019-10-10 | 576 | 464 | 1026 | 1026 |
| 2019-10-10 | 538 | 464 | 1026 | 1026 |
| 2019-10-10 | 444 | 464 | 1026 | 1026 |
| 2019-10-11 | 444 | 464 | 1026 | 1026 |
| 2019-10-11 | 516 | 464 | 1026 | 1026 |
| 2019-10-11 | 552 | 464 | 1026 | 1026 |
| 2019-10-11 | 560 | 464 | 1026 | 1026 |
| 2019-10-11 | 539 | 464 | 1026 | 1026 |
| 2019-10-11 | 449 | 464 | 1026 | 1026 |
| 2019-10-12 | 445 | 464 | 1026 | 1026 |
| 2019-10-12 | 450 | 464 | 1026 | 1026 |
| 2019-10-12 | 565 | 464 | 1026 | 1026 |
| 2019-10-12 | 607 | 464 | 1026 | 1026 |
| 2019-10-12 | 519 | 464 | 1026 | 1026 |
| 2019-10-12 | 470 | 464 | 1026 | 1026 |
| 2019-10-13 | 456 | 464 | 1026 | 1026 |
| 2019-10-13 | 452 | 464 | 1026 | 1026 |
| 2019-10-13 | 564 | 464 | 1026 | 1026 |
| 2019-10-13 | 588 | 464 | 1026 | 1026 |
| 2019-10-13 | 543 | 464 | 1026 | 1026 |
| 2019-10-13 | 508 | 464 | 1026 | 1026 |
| 2019-10-14 | 454 | 464 | 1026 | 1026 |
| 2019-10-14 | 536 | 464 | 1026 | 1026 |
| 2019-10-14 | 519 | 464 | 1026 | 1026 |
| 2019-10-14 | 596 | 464 | 1026 | 1026 |
| 2019-10-14 | 546 | 464 | 1026 | 1026 |
| 2019-10-14 | 455 | 464 | 1026 | 1026 |
| 2019-10-15 | 462 | 464 | 1026 | 1026 |
| 2019-10-15 | 535 | 464 | 1026 | 1026 |
| 2019-10-15 | 502 | 464 | 1026 | 1026 |
| 2019-10-15 | 544 | 464 | 1026 | 1026 |
| 2019-10-15 | 548 | 464 | 1026 | 1026 |
| 2019-10-15 | 451 | 464 | 1026 | 1026 |
| 2019-10-16 | 464 | 464 | 1026 | 1026 |
| 2019-10-16 | 529 | 464 | 1026 | 1026 |
| 2019-10-16 | 552 | 464 | 1026 | 1026 |
| 2019-10-16 | 565 | 464 | 1026 | 1026 |
| 2019-10-16 | 552 | 464 | 1026 | 1026 |
| 2019-10-16 | 480 | 464 | 1026 | 1026 |
| 2019-10-17 | 466 | 464 | 1026 | 1026 |
| 2019-10-17 | 538 | 464 | 1026 | 1026 |
| 2019-10-17 | 491 | 464 | 1026 | 1026 |
| 2019-10-17 | 546 | 464 | 1026 | 1026 |
| 2019-10-17 | 546 | 464 | 1026 | 1026 |
| 2019-10-17 | 466 | 464 | 1026 | 1026 |
| 2019-10-18 | 457 | 464 | 1026 | 1026 |
| 2019-10-18 | 517 | 464 | 1026 | 1026 |
| 2019-10-18 | 554 | 464 | 1026 | 1026 |
| 2019-10-18 | 575 | 464 | 1026 | 1026 |
| 2019-10-18 | 534 | 464 | 1026 | 1026 |
| 2019-10-18 | 450 | 464 | 1026 | 1026 |
| 2019-10-19 | 457 | 464 | 1026 | 1026 |
| 2019-10-19 | 484 | 464 | 1026 | 1026 |
| 2019-10-19 | 589 | 464 | 1026 | 1026 |
| 2019-10-19 | 596 | 464 | 1026 | 1026 |
| 2019-10-19 | 529 | 464 | 1026 | 1026 |
| 2019-10-19 | 457 | 464 | 1026 | 1026 |
| 2019-10-20 | 444 | 464 | 1026 | 1026 |
| 2019-10-20 | 421 | 464 | 1026 | 1026 |
| 2019-10-20 | 477 | 464 | 1026 | 1026 |
| 2019-10-20 | 542 | 464 | 1026 | 1026 |
| 2019-10-20 | 545 | 464 | 1026 | 1026 |
| 2019-10-20 | 458 | 464 | 1026 | 1026 |
| 2019-10-21 | 456 | 464 | 1026 | 1026 |
| 2019-10-21 | 534 | 464 | 1026 | 1026 |
| 2019-10-21 | 548 | 464 | 1026 | 1026 |
| 2019-10-21 | 573 | 464 | 1026 | 1026 |
| 2019-10-21 | 546 | 464 | 1026 | 1026 |
| 2019-10-21 | 455 | 464 | 1026 | 1026 |
| 2019-10-22 | 445 | 464 | 1026 | 1026 |
| 2019-10-22 | 536 | 464 | 1026 | 1026 |
| 2019-10-22 | 550 | 464 | 1026 | 1026 |
| 2019-10-22 | 611 | 464 | 1026 | 1026 |
| 2019-10-22 | 542 | 464 | 1026 | 1026 |
| 2019-10-22 | 441 | 464 | 1026 | 1026 |
| 2019-10-23 | 434 | 464 | 1026 | 1026 |
| 2019-10-23 | 500 | 464 | 1026 | 1026 |
| 2019-10-23 | 559 | 464 | 1026 | 1026 |
| 2019-10-23 | 588 | 464 | 1026 | 1026 |
| 2019-10-23 | 526 | 464 | 1026 | 1026 |
| 2019-10-23 | 453 | 464 | 1026 | 1026 |
| 2019-10-24 | 450 | 464 | 1026 | 1026 |
| 2019-10-24 | 534 | 464 | 1026 | 1026 |
| 2019-10-24 | 553 | 464 | 1026 | 1026 |
| 2019-10-24 | 587 | 464 | 1026 | 1026 |
| 2019-10-24 | 540 | 464 | 1026 | 1026 |
| 2019-10-24 | 449 | 464 | 1026 | 1026 |
| 2019-10-25 | 452 | 464 | 1026 | 1026 |
| 2019-10-25 | 522 | 464 | 1026 | 1026 |
| 2019-10-25 | 564 | 464 | 1026 | 1026 |
| 2019-10-25 | 590 | 464 | 1026 | 1026 |
| 2019-10-25 | 536 | 464 | 1026 | 1026 |
| 2019-10-25 | 449 | 464 | 1026 | 1026 |
| 2019-10-26 | 443 | 464 | 1026 | 1026 |
| 2019-10-26 | 440 | 464 | 1026 | 1026 |
| 2019-10-26 | 567 | 464 | 1026 | 1026 |
| 2019-10-26 | 580 | 464 | 1026 | 1026 |
| 2019-10-26 | 531 | 464 | 1026 | 1026 |
| 2019-10-26 | 447 | 464 | 1026 | 1026 |
| 2019-10-27 | 456 | 464 | 1026 | 1026 |
| 2019-10-27 | 499 | 464 | 1026 | 1026 |
| 2019-10-27 | 535 | 464 | 1026 | 1026 |
| 2019-10-27 | 604 | 464 | 1026 | 1026 |
| 2019-10-27 | 538 | 464 | 1026 | 1026 |
| 2019-10-27 | 459 | 464 | 1026 | 1026 |
| 2019-10-28 | 422 | 464 | 1026 | 1026 |
| 2019-10-28 | 502 | 464 | 1026 | 1026 |
| 2019-10-28 | 562 | 464 | 1026 | 1026 |
| 2019-10-28 | 607 | 464 | 1026 | 1026 |
| 2019-10-28 | 534 | 464 | 1026 | 1026 |
| 2019-10-28 | 529 | 464 | 1026 | 1026 |
| 2019-10-29 | 450 | 464 | 1026 | 1026 |
| 2019-10-29 | 537 | 464 | 1026 | 1026 |
| 2019-10-29 | 560 | 464 | 1026 | 1026 |
| 2019-10-29 | 599 | 464 | 1026 | 1026 |
| 2019-10-29 | 542 | 464 | 1026 | 1026 |
| 2019-10-29 | 507 | 464 | 1026 | 1026 |
| 2019-10-30 | 448 | 464 | 1026 | 1026 |
| 2019-10-30 | 534 | 464 | 1026 | 1026 |
| 2019-10-30 | 579 | 464 | 1026 | 1026 |
| 2019-10-30 | 588 | 464 | 1026 | 1026 |
| 2019-10-30 | 539 | 464 | 1026 | 1026 |
| 2019-10-30 | 454 | 464 | 1026 | 1026 |
| 2019-10-31 | 450 | 464 | 1026 | 1026 |
| 2019-10-31 | 524 | 464 | 1026 | 1026 |
| 2019-10-31 | 602 | 464 | 1026 | 1026 |
| 2019-10-31 | 610 | 464 | 1026 | 1026 |
| 2019-10-31 | 542 | 464 | 1026 | 1026 |
| 2019-10-31 | 456 | 464 | 1026 | 1026 |
| 2019-11-01 | 453 | 466 | 1026 | 1026 |
| 2019-11-01 | 462 | 466 | 1026 | 1026 |
| 2019-11-01 | 592 | 466 | 1026 | 1026 |
| 2019-11-01 | 593 | 466 | 1026 | 1026 |
| 2019-11-01 | 521 | 466 | 1026 | 1026 |
| 2019-11-01 | 460 | 466 | 1026 | 1026 |
| 2019-11-02 | 463 | 466 | 1026 | 1026 |
| 2019-11-02 | 461 | 466 | 1026 | 1026 |
| 2019-11-02 | 587 | 466 | 1026 | 1026 |
| 2019-11-02 | 587 | 466 | 1026 | 1026 |
| 2019-11-02 | 576 | 466 | 1026 | 1026 |
| 2019-11-02 | 452 | 466 | 1026 | 1026 |
| 2019-11-03 | 467 | 466 | 1026 | 1026 |
| 2019-11-03 | 475 | 466 | 1026 | 1026 |
| 2019-11-03 | 563 | 466 | 1026 | 1026 |
| 2019-11-03 | 583 | 466 | 1026 | 1026 |
| 2019-11-03 | 541 | 466 | 1026 | 1026 |
| 2019-11-03 | 476 | 466 | 1026 | 1026 |
| 2019-11-04 | 471 | 466 | 1026 | 1026 |
| 2019-11-04 | 490 | 466 | 1026 | 1026 |
| 2019-11-04 | 602 | 466 | 1026 | 1026 |
| 2019-11-04 | 611 | 466 | 1026 | 1026 |
| 2019-11-04 | 533 | 466 | 1026 | 1026 |
| 2019-11-04 | 476 | 466 | 1026 | 1026 |
| 2019-11-05 | 470 | 466 | 1026 | 1026 |
| 2019-11-05 | 515 | 466 | 1026 | 1026 |
| 2019-11-05 | 601 | 466 | 1026 | 1026 |
| 2019-11-05 | 593 | 466 | 1026 | 1026 |
| 2019-11-05 | 518 | 466 | 1026 | 1026 |
| 2019-11-05 | 449 | 466 | 1026 | 1026 |
| 2019-11-06 | 465 | 466 | 1026 | 1026 |
| 2019-11-06 | 559 | 466 | 1026 | 1026 |
| 2019-11-06 | 605 | 466 | 1026 | 1026 |
| 2019-11-06 | 585 | 466 | 1026 | 1026 |
| 2019-11-06 | 519 | 466 | 1026 | 1026 |
| 2019-11-06 | 499 | 466 | 1026 | 1026 |
| 2019-11-07 | 464 | 466 | 1026 | 1026 |
| 2019-11-07 | 538 | 466 | 1026 | 1026 |
| 2019-11-07 | 587 | 466 | 1026 | 1026 |
| 2019-11-07 | 602 | 466 | 1026 | 1026 |
| 2019-11-07 | 579 | 466 | 1026 | 1026 |
| 2019-11-07 | 446 | 466 | 1026 | 1026 |
| 2019-11-08 | 462 | 466 | 1026 | 1026 |
| 2019-11-08 | 563 | 466 | 1026 | 1026 |
| 2019-11-08 | 603 | 466 | 1026 | 1026 |
| 2019-11-08 | 602 | 466 | 1026 | 1026 |
| 2019-11-08 | 541 | 466 | 1026 | 1026 |
| 2019-11-08 | 458 | 466 | 1026 | 1026 |
| 2019-11-09 | 466 | 466 | 1026 | 1026 |
| 2019-11-09 | 500 | 466 | 1026 | 1026 |
| 2019-11-09 | 603 | 466 | 1026 | 1026 |
| 2019-11-09 | 592 | 466 | 1026 | 1026 |
| 2019-11-09 | 543 | 466 | 1026 | 1026 |
| 2019-11-09 | 460 | 466 | 1026 | 1026 |
| 2019-11-10 | 440 | 466 | 1026 | 1026 |
| 2019-11-10 | 490 | 466 | 1026 | 1026 |
| 2019-11-10 | 603 | 466 | 1026 | 1026 |
| 2019-11-10 | 626 | 466 | 1026 | 1026 |
| 2019-11-10 | 538 | 466 | 1026 | 1026 |
| 2019-11-10 | 456 | 466 | 1026 | 1026 |
| 2019-11-11 | 446 | 466 | 1026 | 1026 |
| 2019-11-11 | 481 | 466 | 1026 | 1026 |
| 2019-11-11 | 591 | 466 | 1026 | 1026 |
| 2019-11-11 | 594 | 466 | 1026 | 1026 |
| 2019-11-11 | 581 | 466 | 1026 | 1026 |
| 2019-11-11 | 452 | 466 | 1026 | 1026 |
| 2019-11-12 | 459 | 466 | 1026 | 1026 |
| 2019-11-12 | 577 | 466 | 1026 | 1026 |
| 2019-11-12 | 604 | 466 | 1026 | 1026 |
| 2019-11-12 | 609 | 466 | 1026 | 1026 |
| 2019-11-12 | 582 | 466 | 1026 | 1026 |
| 2019-11-12 | 452 | 466 | 1026 | 1026 |
| 2019-11-13 | 462 | 466 | 1026 | 1026 |
| 2019-11-13 | 536 | 466 | 1026 | 1026 |
| 2019-11-13 | 613 | 466 | 1026 | 1026 |
| 2019-11-13 | 605 | 466 | 1026 | 1026 |
| 2019-11-13 | 531 | 466 | 1026 | 1026 |
| 2019-11-13 | 454 | 466 | 1026 | 1026 |
| 2019-11-14 | 515 | 466 | 1026 | 1026 |
| 2019-11-14 | 515 | 466 | 1026 | 1026 |
| 2019-11-14 | 515 | 466 | 1026 | 1026 |
| 2019-11-14 | 515 | 466 | 1026 | 1026 |
| 2019-11-14 | 515 | 466 | 1026 | 1026 |
| 2019-11-14 | 515 | 466 | 1026 | 1026 |
| 2019-11-15 | 515 | 466 | 1026 | 1026 |
| 2019-11-15 | 515 | 466 | 1026 | 1026 |
| 2019-11-15 | 515 | 466 | 1026 | 1026 |
| 2019-11-15 | 515 | 466 | 1026 | 1026 |
| 2019-11-15 | 515 | 466 | 1026 | 1026 |
| 2019-11-15 | 515 | 466 | 1026 | 1026 |
| 2019-11-16 | 451 | 466 | 1026 | 1026 |
| 2019-11-16 | 542 | 466 | 1026 | 1026 |
| 2019-11-16 | 595 | 466 | 1026 | 1026 |
| 2019-11-16 | 618 | 466 | 1026 | 1026 |
| 2019-11-16 | 538 | 466 | 1026 | 1026 |
| 2019-11-16 | 452 | 466 | 1026 | 1026 |
| 2019-11-17 | 492 | 466 | 1026 | 1026 |
| 2019-11-17 | 491 | 466 | 1026 | 1026 |
| 2019-11-17 | 600 | 466 | 1026 | 1026 |
| 2019-11-17 | 634 | 466 | 1026 | 1026 |
| 2019-11-17 | 538 | 466 | 1026 | 1026 |
| 2019-11-17 | 457 | 466 | 1026 | 1026 |
| 2019-11-18 | 515 | 466 | 1026 | 1026 |
| 2019-11-18 | 518 | 466 | 1026 | 1026 |
| 2019-11-18 | 597 | 466 | 1026 | 1026 |
| 2019-11-18 | 599 | 466 | 1026 | 1026 |
| 2019-11-18 | 587 | 466 | 1026 | 1026 |
| 2019-11-18 | 447 | 466 | 1026 | 1026 |
| 2019-11-19 | 466 | 466 | 1026 | 1026 |
| 2019-11-19 | 544 | 466 | 1026 | 1026 |
| 2019-11-19 | 606 | 466 | 1026 | 1026 |
| 2019-11-19 | 607 | 466 | 1026 | 1026 |
| 2019-11-19 | 530 | 466 | 1026 | 1026 |
| 2019-11-19 | 447 | 466 | 1026 | 1026 |
| 2019-11-20 | 440 | 466 | 1026 | 1026 |
| 2019-11-20 | 546 | 466 | 1026 | 1026 |
| 2019-11-20 | 606 | 466 | 1026 | 1026 |
| 2019-11-20 | 605 | 466 | 1026 | 1026 |
| 2019-11-20 | 537 | 466 | 1026 | 1026 |
| 2019-11-20 | 450 | 466 | 1026 | 1026 |
| 2019-11-21 | 458 | 466 | 1026 | 1026 |
| 2019-11-21 | 546 | 466 | 1026 | 1026 |
| 2019-11-21 | 592 | 466 | 1026 | 1026 |
| 2019-11-21 | 592 | 466 | 1026 | 1026 |
| 2019-11-21 | 536 | 466 | 1026 | 1026 |
| 2019-11-21 | 460 | 466 | 1026 | 1026 |
| 2019-11-22 | 466 | 466 | 1026 | 1026 |
| 2019-11-22 | 588 | 466 | 1026 | 1026 |
| 2019-11-22 | 599 | 466 | 1026 | 1026 |
| 2019-11-22 | 595 | 466 | 1026 | 1026 |
| 2019-11-22 | 583 | 466 | 1026 | 1026 |
| 2019-11-22 | 466 | 466 | 1026 | 1026 |
| 2019-11-23 | 454 | 466 | 1026 | 1026 |
| 2019-11-23 | 487 | 466 | 1026 | 1026 |
| 2019-11-23 | 600 | 466 | 1026 | 1026 |
| 2019-11-23 | 599 | 466 | 1026 | 1026 |
| 2019-11-23 | 533 | 466 | 1026 | 1026 |
| 2019-11-23 | 456 | 466 | 1026 | 1026 |
| 2019-11-24 | 446 | 466 | 1026 | 1026 |
| 2019-11-24 | 399 | 466 | 1026 | 1026 |
| 2019-11-24 | 594 | 466 | 1026 | 1026 |
| 2019-11-24 | 592 | 466 | 1026 | 1026 |
| 2019-11-24 | 537 | 466 | 1026 | 1026 |
| 2019-11-24 | 458 | 466 | 1026 | 1026 |
| 2019-11-25 | 448 | 466 | 1026 | 1026 |
| 2019-11-25 | 551 | 466 | 1026 | 1026 |
| 2019-11-25 | 589 | 466 | 1026 | 1026 |
| 2019-11-25 | 590 | 466 | 1026 | 1026 |
| 2019-11-25 | 536 | 466 | 1026 | 1026 |
| 2019-11-25 | 455 | 466 | 1026 | 1026 |
| 2019-11-26 | 463 | 466 | 1026 | 1026 |
| 2019-11-26 | 584 | 466 | 1026 | 1026 |
| 2019-11-26 | 600 | 466 | 1026 | 1026 |
| 2019-11-26 | 602 | 466 | 1026 | 1026 |
| 2019-11-26 | 587 | 466 | 1026 | 1026 |
| 2019-11-26 | 462 | 466 | 1026 | 1026 |
| 2019-11-27 | 465 | 466 | 1026 | 1026 |
| 2019-11-27 | 573 | 466 | 1026 | 1026 |
| 2019-11-27 | 597 | 466 | 1026 | 1026 |
| 2019-11-27 | 598 | 466 | 1026 | 1026 |
| 2019-11-27 | 580 | 466 | 1026 | 1026 |
| 2019-11-27 | 455 | 466 | 1026 | 1026 |
| 2019-11-28 | 454 | 466 | 1026 | 1026 |
| 2019-11-28 | 555 | 466 | 1026 | 1026 |
| 2019-11-28 | 598 | 466 | 1026 | 1026 |
| 2019-11-28 | 599 | 466 | 1026 | 1026 |
| 2019-11-28 | 593 | 466 | 1026 | 1026 |
| 2019-11-28 | 455 | 466 | 1026 | 1026 |
| 2019-11-29 | 457 | 466 | 1026 | 1026 |
| 2019-11-29 | 542 | 466 | 1026 | 1026 |
| 2019-11-29 | 610 | 466 | 1026 | 1026 |
| 2019-11-29 | 598 | 466 | 1026 | 1026 |
| 2019-11-29 | 534 | 466 | 1026 | 1026 |
| 2019-11-29 | 515 | 466 | 1026 | 1026 |
| 2019-11-30 | 442 | 466 | 1026 | 1026 |
| 2019-11-30 | 518 | 466 | 1026 | 1026 |
| 2019-11-30 | 593 | 466 | 1026 | 1026 |
| 2019-11-30 | 603 | 466 | 1026 | 1026 |
| 2019-11-30 | 537 | 466 | 1026 | 1026 |
| 2019-11-30 | 477 | 466 | 1026 | 1026 |
| 2019-12-01 | 527 | 471 | 1026 | 1026 |
| 2019-12-01 | 465 | 471 | 1026 | 1026 |
| 2019-12-01 | 586 | 471 | 1026 | 1026 |
| 2019-12-01 | 592 | 471 | 1026 | 1026 |
| 2019-12-01 | 539 | 471 | 1026 | 1026 |
| 2019-12-01 | 457 | 471 | 1026 | 1026 |
| 2019-12-02 | 447 | 471 | 1026 | 1026 |
| 2019-12-02 | 406 | 471 | 1026 | 1026 |
| 2019-12-02 | 406 | 471 | 1026 | 1026 |
| 2019-12-02 | 437 | 471 | 1026 | 1026 |
| 2019-12-02 | 444 | 471 | 1026 | 1026 |
| 2019-12-02 | 446 | 471 | 1026 | 1026 |
| 2019-12-03 | 441 | 471 | 1026 | 1026 |
| 2019-12-03 | 548 | 471 | 1026 | 1026 |
| 2019-12-03 | 610 | 471 | 1026 | 1026 |
| 2019-12-03 | 599 | 471 | 1026 | 1026 |
| 2019-12-03 | 534 | 471 | 1026 | 1026 |
| 2019-12-03 | 453 | 471 | 1026 | 1026 |
| 2019-12-04 | 447 | 471 | 1026 | 1026 |
| 2019-12-04 | 541 | 471 | 1026 | 1026 |
| 2019-12-04 | 614 | 471 | 1026 | 1026 |
| 2019-12-04 | 616 | 471 | 1026 | 1026 |
| 2019-12-04 | 535 | 471 | 1026 | 1026 |
| 2019-12-04 | 454 | 471 | 1026 | 1026 |
| 2019-12-05 | 446 | 471 | 1026 | 1026 |
| 2019-12-05 | 552 | 471 | 1026 | 1026 |
| 2019-12-05 | 617 | 471 | 1026 | 1026 |
| 2019-12-05 | 613 | 471 | 1026 | 1026 |
| 2019-12-05 | 539 | 471 | 1026 | 1026 |
| 2019-12-05 | 476 | 471 | 1026 | 1026 |
| 2019-12-06 | 462 | 471 | 1026 | 1026 |
| 2019-12-06 | 460 | 471 | 1026 | 1026 |
| 2019-12-06 | 456 | 471 | 1026 | 1026 |
| 2019-12-06 | 469 | 471 | 1026 | 1026 |
| 2019-12-06 | 468 | 471 | 1026 | 1026 |
| 2019-12-06 | 472 | 471 | 1026 | 1026 |
| 2019-12-07 | 452 | 471 | 1026 | 1026 |
| 2019-12-07 | 527 | 471 | 1026 | 1026 |
| 2019-12-07 | 591 | 471 | 1026 | 1026 |
| 2019-12-07 | 595 | 471 | 1026 | 1026 |
| 2019-12-07 | 539 | 471 | 1026 | 1026 |
| 2019-12-07 | 456 | 471 | 1026 | 1026 |
| 2019-12-08 | 452 | 471 | 1026 | 1026 |
| 2019-12-08 | 461 | 471 | 1026 | 1026 |
| 2019-12-08 | 560 | 471 | 1026 | 1026 |
| 2019-12-08 | 579 | 471 | 1026 | 1026 |
| 2019-12-08 | 553 | 471 | 1026 | 1026 |
| 2019-12-08 | 474 | 471 | 1026 | 1026 |
| 2019-12-09 | 457 | 471 | 1026 | 1026 |
| 2019-12-09 | 541 | 471 | 1026 | 1026 |
| 2019-12-09 | 581 | 471 | 1026 | 1026 |
| 2019-12-09 | 585 | 471 | 1026 | 1026 |
| 2019-12-09 | 539 | 471 | 1026 | 1026 |
| 2019-12-09 | 465 | 471 | 1026 | 1026 |
| 2019-12-10 | 457 | 471 | 1026 | 1026 |
| 2019-12-10 | 563 | 471 | 1026 | 1026 |
| 2019-12-10 | 582 | 471 | 1026 | 1026 |
| 2019-12-10 | 591 | 471 | 1026 | 1026 |
| 2019-12-10 | 539 | 471 | 1026 | 1026 |
| 2019-12-10 | 508 | 471 | 1026 | 1026 |
| 2019-12-11 | 470 | 471 | 1026 | 1026 |
| 2019-12-11 | 549 | 471 | 1026 | 1026 |
| 2019-12-11 | 575 | 471 | 1026 | 1026 |
| 2019-12-11 | 605 | 471 | 1026 | 1026 |
| 2019-12-11 | 550 | 471 | 1026 | 1026 |
| 2019-12-11 | 530 | 471 | 1026 | 1026 |
| 2019-12-12 | 460 | 471 | 1026 | 1026 |
| 2019-12-12 | 547 | 471 | 1026 | 1026 |
| 2019-12-12 | 584 | 471 | 1026 | 1026 |
| 2019-12-12 | 588 | 471 | 1026 | 1026 |
| 2019-12-12 | 538 | 471 | 1026 | 1026 |
| 2019-12-12 | 476 | 471 | 1026 | 1026 |
| 2019-12-13 | 454 | 471 | 1026 | 1026 |
| 2019-12-13 | 544 | 471 | 1026 | 1026 |
| 2019-12-13 | 582 | 471 | 1026 | 1026 |
| 2019-12-13 | 585 | 471 | 1026 | 1026 |
| 2019-12-13 | 538 | 471 | 1026 | 1026 |
| 2019-12-13 | 493 | 471 | 1026 | 1026 |
| 2019-12-14 | 446 | 471 | 1026 | 1026 |
| 2019-12-14 | 403 | 471 | 1026 | 1026 |
| 2019-12-14 | 399 | 471 | 1026 | 1026 |
| 2019-12-14 | 441 | 471 | 1026 | 1026 |
| 2019-12-14 | 444 | 471 | 1026 | 1026 |
| 2019-12-14 | 446 | 471 | 1026 | 1026 |
| 2019-12-15 | 460 | 471 | 1026 | 1026 |
| 2019-12-15 | 463 | 471 | 1026 | 1026 |
| 2019-12-15 | 585 | 471 | 1026 | 1026 |
| 2019-12-15 | 579 | 471 | 1026 | 1026 |
| 2019-12-15 | 541 | 471 | 1026 | 1026 |
| 2019-12-15 | 460 | 471 | 1026 | 1026 |
| 2019-12-16 | 455 | 471 | 1026 | 1026 |
| 2019-12-16 | 570 | 471 | 1026 | 1026 |
| 2019-12-16 | 591 | 471 | 1026 | 1026 |
| 2019-12-16 | 586 | 471 | 1026 | 1026 |
| 2019-12-16 | 529 | 471 | 1026 | 1026 |
| 2019-12-16 | 518 | 471 | 1026 | 1026 |
| 2019-12-17 | 466 | 471 | 1026 | 1026 |
| 2019-12-17 | 535 | 471 | 1026 | 1026 |
| 2019-12-17 | 581 | 471 | 1026 | 1026 |
| 2019-12-17 | 579 | 471 | 1026 | 1026 |
| 2019-12-17 | 571 | 471 | 1026 | 1026 |
| 2019-12-17 | 476 | 471 | 1026 | 1026 |
| 2019-12-18 | 454 | 471 | 1026 | 1026 |
| 2019-12-18 | 561 | 471 | 1026 | 1026 |
| 2019-12-18 | 618 | 471 | 1026 | 1026 |
| 2019-12-18 | 611 | 471 | 1026 | 1026 |
| 2019-12-18 | 537 | 471 | 1026 | 1026 |
| 2019-12-18 | 456 | 471 | 1026 | 1026 |
| 2019-12-19 | 454 | 471 | 1026 | 1026 |
| 2019-12-19 | 552 | 471 | 1026 | 1026 |
| 2019-12-19 | 583 | 471 | 1026 | 1026 |
| 2019-12-19 | 578 | 471 | 1026 | 1026 |
| 2019-12-19 | 530 | 471 | 1026 | 1026 |
| 2019-12-19 | 528 | 471 | 1026 | 1026 |
| 2019-12-20 | 455 | 471 | 1026 | 1026 |
| 2019-12-20 | 538 | 471 | 1026 | 1026 |
| 2019-12-20 | 586 | 471 | 1026 | 1026 |
| 2019-12-20 | 586 | 471 | 1026 | 1026 |
| 2019-12-20 | 540 | 471 | 1026 | 1026 |
| 2019-12-20 | 516 | 471 | 1026 | 1026 |
| 2019-12-21 | 457 | 471 | 1026 | 1026 |
| 2019-12-21 | 473 | 471 | 1026 | 1026 |
| 2019-12-21 | 583 | 471 | 1026 | 1026 |
| 2019-12-21 | 585 | 471 | 1026 | 1026 |
| 2019-12-21 | 544 | 471 | 1026 | 1026 |
| 2019-12-21 | 466 | 471 | 1026 | 1026 |
| 2019-12-22 | 471 | 471 | 1026 | 1026 |
| 2019-12-22 | 500 | 471 | 1026 | 1026 |
| 2019-12-22 | 586 | 471 | 1026 | 1026 |
| 2019-12-22 | 585 | 471 | 1026 | 1026 |
| 2019-12-22 | 546 | 471 | 1026 | 1026 |
| 2019-12-22 | 467 | 471 | 1026 | 1026 |
| 2019-12-23 | 469 | 471 | 1026 | 1026 |
| 2019-12-23 | 475 | 471 | 1026 | 1026 |
| 2019-12-23 | 586 | 471 | 1026 | 1026 |
| 2019-12-23 | 582 | 471 | 1026 | 1026 |
| 2019-12-23 | 542 | 471 | 1026 | 1026 |
| 2019-12-23 | 470 | 471 | 1026 | 1026 |
| 2019-12-24 | 466 | 471 | 1026 | 1026 |
| 2019-12-24 | 476 | 471 | 1026 | 1026 |
| 2019-12-24 | 584 | 471 | 1026 | 1026 |
| 2019-12-24 | 584 | 471 | 1026 | 1026 |
| 2019-12-24 | 546 | 471 | 1026 | 1026 |
| 2019-12-24 | 486 | 471 | 1026 | 1026 |
| 2019-12-25 | 469 | 471 | 1026 | 1026 |
| 2019-12-25 | 467 | 471 | 1026 | 1026 |
| 2019-12-25 | 587 | 471 | 1026 | 1026 |
| 2019-12-25 | 602 | 471 | 1026 | 1026 |
| 2019-12-25 | 531 | 471 | 1026 | 1026 |
| 2019-12-25 | 444 | 471 | 1026 | 1026 |
| 2019-12-26 | 437 | 471 | 1026 | 1026 |
| 2019-12-26 | 531 | 471 | 1026 | 1026 |
| 2019-12-26 | 602 | 471 | 1026 | 1026 |
| 2019-12-26 | 595 | 471 | 1026 | 1026 |
| 2019-12-26 | 542 | 471 | 1026 | 1026 |
| 2019-12-26 | 520 | 471 | 1026 | 1026 |
| 2019-12-27 | 442 | 471 | 1026 | 1026 |
| 2019-12-27 | 524 | 471 | 1026 | 1026 |
| 2019-12-27 | 606 | 471 | 1026 | 1026 |
| 2019-12-27 | 601 | 471 | 1026 | 1026 |
| 2019-12-27 | 526 | 471 | 1026 | 1026 |
| 2019-12-27 | 527 | 471 | 1026 | 1026 |
| 2019-12-28 | 440 | 471 | 1026 | 1026 |
| 2019-12-28 | 410 | 471 | 1026 | 1026 |
| 2019-12-28 | 611 | 471 | 1026 | 1026 |
| 2019-12-28 | 598 | 471 | 1026 | 1026 |
| 2019-12-28 | 527 | 471 | 1026 | 1026 |
| 2019-12-28 | 449 | 471 | 1026 | 1026 |
| 2019-12-29 | 520 | 471 | 1026 | 1026 |
| 2019-12-29 | 412 | 471 | 1026 | 1026 |
| 2019-12-29 | 613 | 471 | 1026 | 1026 |
| 2019-12-29 | 609 | 471 | 1026 | 1026 |
| 2019-12-29 | 537 | 471 | 1026 | 1026 |
| 2019-12-29 | 502 | 471 | 1026 | 1026 |
| 2019-12-30 | 463 | 471 | 1026 | 1026 |
| 2019-12-30 | 532 | 471 | 1026 | 1026 |
| 2019-12-30 | 623 | 471 | 1026 | 1026 |
| 2019-12-30 | 609 | 471 | 1026 | 1026 |
| 2019-12-30 | 545 | 471 | 1026 | 1026 |
| 2019-12-30 | 525 | 471 | 1026 | 1026 |
| 2019-12-31 | 450 | 471 | 1026 | 1026 |
| 2019-12-31 | 537 | 471 | 1026 | 1026 |
| 2019-12-31 | 602 | 471 | 1026 | 1026 |
| 2019-12-31 | 588 | 471 | 1026 | 1026 |
| 2019-12-31 | 533 | 471 | 1026 | 1026 |
| 2019-12-31 | 517 | 471 | 1026 | 1026 |
| 2020-01-01 | 464 | 472 | 1026 | 1026 |
| 2020-01-01 | 410 | 472 | 1026 | 1026 |
| 2020-01-01 | 544 | 472 | 1026 | 1026 |
| 2020-01-01 | 600 | 472 | 1026 | 1026 |
| 2020-01-01 | 538 | 472 | 1026 | 1026 |
| 2020-01-01 | 455 | 472 | 1026 | 1026 |
| 2020-01-02 | 528 | 472 | 1026 | 1026 |
| 2020-01-02 | 542 | 472 | 1026 | 1026 |
| 2020-01-02 | 606 | 472 | 1026 | 1026 |
| 2020-01-02 | 607 | 472 | 1026 | 1026 |
| 2020-01-02 | 599 | 472 | 1026 | 1026 |
| 2020-01-02 | 456 | 472 | 1026 | 1026 |
| 2020-01-03 | 461 | 472 | 1026 | 1026 |
| 2020-01-03 | 487 | 472 | 1026 | 1026 |
| 2020-01-03 | 606 | 472 | 1026 | 1026 |
| 2020-01-03 | 610 | 472 | 1026 | 1026 |
| 2020-01-03 | 599 | 472 | 1026 | 1026 |
| 2020-01-03 | 461 | 472 | 1026 | 1026 |
| 2020-01-04 | 468 | 472 | 1026 | 1026 |
| 2020-01-04 | 482 | 472 | 1026 | 1026 |
| 2020-01-04 | 600 | 472 | 1026 | 1026 |
| 2020-01-04 | 606 | 472 | 1026 | 1026 |
| 2020-01-04 | 587 | 472 | 1026 | 1026 |
| 2020-01-04 | 455 | 472 | 1026 | 1026 |
| 2020-01-05 | 455 | 472 | 1026 | 1026 |
| 2020-01-05 | 410 | 472 | 1026 | 1026 |
| 2020-01-05 | 586 | 472 | 1026 | 1026 |
| 2020-01-05 | 588 | 472 | 1026 | 1026 |
| 2020-01-05 | 540 | 472 | 1026 | 1026 |
| 2020-01-05 | 501 | 472 | 1026 | 1026 |
| 2020-01-06 | 454 | 472 | 1026 | 1026 |
| 2020-01-06 | 548 | 472 | 1026 | 1026 |
| 2020-01-06 | 587 | 472 | 1026 | 1026 |
| 2020-01-06 | 600 | 472 | 1026 | 1026 |
| 2020-01-06 | 596 | 472 | 1026 | 1026 |
| 2020-01-06 | 472 | 472 | 1026 | 1026 |
| 2020-01-07 | 505 | 472 | 1026 | 1026 |
| 2020-01-07 | 523 | 472 | 1026 | 1026 |
| 2020-01-07 | 606 | 472 | 1026 | 1026 |
| 2020-01-07 | 601 | 472 | 1026 | 1026 |
| 2020-01-07 | 597 | 472 | 1026 | 1026 |
| 2020-01-07 | 457 | 472 | 1026 | 1026 |
| 2020-01-08 | 461 | 472 | 1026 | 1026 |
| 2020-01-08 | 549 | 472 | 1026 | 1026 |
| 2020-01-08 | 603 | 472 | 1026 | 1026 |
| 2020-01-08 | 597 | 472 | 1026 | 1026 |
| 2020-01-08 | 536 | 472 | 1026 | 1026 |
| 2020-01-08 | 468 | 472 | 1026 | 1026 |
| 2020-01-09 | 470 | 472 | 1026 | 1026 |
| 2020-01-09 | 583 | 472 | 1026 | 1026 |
| 2020-01-09 | 605 | 472 | 1026 | 1026 |
| 2020-01-09 | 606 | 472 | 1026 | 1026 |
| 2020-01-09 | 595 | 472 | 1026 | 1026 |
| 2020-01-09 | 461 | 472 | 1026 | 1026 |
| 2020-01-10 | 475 | 472 | 1026 | 1026 |
| 2020-01-10 | 543 | 472 | 1026 | 1026 |
| 2020-01-10 | 601 | 472 | 1026 | 1026 |
| 2020-01-10 | 609 | 472 | 1026 | 1026 |
| 2020-01-10 | 540 | 472 | 1026 | 1026 |
| 2020-01-10 | 459 | 472 | 1026 | 1026 |
| 2020-01-11 | 464 | 472 | 1026 | 1026 |
| 2020-01-11 | 491 | 472 | 1026 | 1026 |
| 2020-01-11 | 599 | 472 | 1026 | 1026 |
| 2020-01-11 | 604 | 472 | 1026 | 1026 |
| 2020-01-11 | 594 | 472 | 1026 | 1026 |
| 2020-01-11 | 473 | 472 | 1026 | 1026 |
| 2020-01-12 | 468 | 472 | 1026 | 1026 |
| 2020-01-12 | 468 | 472 | 1026 | 1026 |
| 2020-01-12 | 602 | 472 | 1026 | 1026 |
| 2020-01-12 | 603 | 472 | 1026 | 1026 |
| 2020-01-12 | 592 | 472 | 1026 | 1026 |
| 2020-01-12 | 480 | 472 | 1026 | 1026 |
| 2020-01-13 | 463 | 472 | 1026 | 1026 |
| 2020-01-13 | 538 | 472 | 1026 | 1026 |
| 2020-01-13 | 604 | 472 | 1026 | 1026 |
| 2020-01-13 | 606 | 472 | 1026 | 1026 |
| 2020-01-13 | 593 | 472 | 1026 | 1026 |
| 2020-01-13 | 460 | 472 | 1026 | 1026 |
| 2020-01-14 | 463 | 472 | 1026 | 1026 |
| 2020-01-14 | 514 | 472 | 1026 | 1026 |
| 2020-01-14 | 606 | 472 | 1026 | 1026 |
| 2020-01-14 | 606 | 472 | 1026 | 1026 |
| 2020-01-14 | 587 | 472 | 1026 | 1026 |
| 2020-01-14 | 471 | 472 | 1026 | 1026 |
| 2020-01-15 | 459 | 472 | 1026 | 1026 |
| 2020-01-15 | 511 | 472 | 1026 | 1026 |
| 2020-01-15 | 605 | 472 | 1026 | 1026 |
| 2020-01-15 | 603 | 472 | 1026 | 1026 |
| 2020-01-15 | 593 | 472 | 1026 | 1026 |
| 2020-01-15 | 458 | 472 | 1026 | 1026 |
| 2020-01-16 | 481 | 472 | 1026 | 1026 |
| 2020-01-16 | 550 | 472 | 1026 | 1026 |
| 2020-01-16 | 602 | 472 | 1026 | 1026 |
| 2020-01-16 | 603 | 472 | 1026 | 1026 |
| 2020-01-16 | 592 | 472 | 1046 | 1046 |
| 2020-01-16 | 457 | 472 | 1046 | 1046 |
| 2020-01-17 | 461 | 472 | 1026 | 1026 |
| 2020-01-17 | 518 | 472 | 1026 | 1026 |
| 2020-01-17 | 604 | 472 | 1026 | 1026 |
| 2020-01-17 | 611 | 472 | 1026 | 1026 |
| 2020-01-17 | 592 | 472 | 1046 | 1046 |
| 2020-01-17 | 467 | 472 | 1046 | 1046 |
| 2020-01-18 | 464 | 472 | 1026 | 1026 |
| 2020-01-18 | 533 | 472 | 1026 | 1026 |
| 2020-01-18 | 610 | 472 | 1026 | 1026 |
| 2020-01-18 | 609 | 472 | 1026 | 1026 |
| 2020-01-18 | 540 | 472 | 1046 | 1046 |
| 2020-01-18 | 501 | 472 | 1046 | 1046 |
| 2020-01-19 | 468 | 472 | 1026 | 1026 |
| 2020-01-19 | 469 | 472 | 1026 | 1026 |
| 2020-01-19 | 590 | 472 | 1026 | 1026 |
| 2020-01-19 | 598 | 472 | 1026 | 1026 |
| 2020-01-19 | 536 | 472 | 1046 | 1046 |
| 2020-01-19 | 531 | 472 | 1046 | 1046 |
| 2020-01-20 | 449 | 472 | 1026 | 1026 |
| 2020-01-20 | 544 | 472 | 1026 | 1026 |
| 2020-01-20 | 607 | 472 | 1026 | 1026 |
| 2020-01-20 | 610 | 472 | 1026 | 1026 |
| 2020-01-20 | 539 | 472 | 1046 | 1046 |
| 2020-01-20 | 458 | 472 | 1046 | 1046 |
| 2020-01-21 | 447 | 472 | 1026 | 1026 |
| 2020-01-21 | 550 | 472 | 1026 | 1026 |
| 2020-01-21 | 607 | 472 | 1026 | 1026 |
| 2020-01-21 | 608 | 472 | 1026 | 1026 |
| 2020-01-21 | 539 | 472 | 1046 | 1046 |
| 2020-01-21 | 461 | 472 | 1046 | 1046 |
| 2020-01-22 | 445 | 472 | 1026 | 1026 |
| 2020-01-22 | 549 | 472 | 1026 | 1026 |
| 2020-01-22 | 536 | 472 | 0 | 536 |
| 2020-01-22 | 606 | 472 | 1026 | 1026 |
| 2020-01-22 | 487 | 472 | 1046 | 1046 |
| 2020-01-22 | 459 | 472 | 1046 | 1046 |
| 2020-01-23 | 445 | 472 | 1026 | 1026 |
| 2020-01-23 | 549 | 472 | 1026 | 1026 |
| 2020-01-23 | 607 | 472 | 1026 | 1026 |
| 2020-01-23 | 606 | 472 | 1026 | 1026 |
| 2020-01-23 | 539 | 472 | 1046 | 1046 |
| 2020-01-23 | 455 | 472 | 1046 | 1046 |
| 2020-01-24 | 448 | 472 | 1026 | 1026 |
| 2020-01-24 | 549 | 472 | 1026 | 1026 |
| 2020-01-24 | 606 | 472 | 1026 | 1026 |
| 2020-01-24 | 604 | 472 | 1026 | 1026 |
| 2020-01-24 | 528 | 472 | 1046 | 1046 |
| 2020-01-24 | 464 | 472 | 1046 | 1046 |
| 2020-01-25 | 444 | 472 | 1026 | 1026 |
| 2020-01-25 | 545 | 472 | 1026 | 1026 |
| 2020-01-25 | 609 | 472 | 1026 | 1026 |
| 2020-01-25 | 606 | 472 | 1026 | 1026 |
| 2020-01-25 | 532 | 472 | 1046 | 1046 |
| 2020-01-25 | 459 | 472 | 1046 | 1046 |
| 2020-01-26 | 458 | 472 | 1026 | 1026 |
| 2020-01-26 | 463 | 472 | 1026 | 1026 |
| 2020-01-26 | 591 | 472 | 1026 | 1026 |
| 2020-01-26 | 605 | 472 | 1026 | 1026 |
| 2020-01-26 | 531 | 472 | 1046 | 1046 |
| 2020-01-26 | 477 | 472 | 1046 | 1046 |
| 2020-01-27 | 461 | 472 | 1026 | 1026 |
| 2020-01-27 | 522 | 472 | 1026 | 1026 |
| 2020-01-27 | 605 | 472 | 1026 | 1026 |
| 2020-01-27 | 608 | 472 | 1026 | 1026 |
| 2020-01-27 | 541 | 472 | 1046 | 1046 |
| 2020-01-27 | 458 | 472 | 1046 | 1046 |
| 2020-01-28 | 462 | 472 | 1026 | 1026 |
| 2020-01-28 | 571 | 472 | 1026 | 1026 |
| 2020-01-28 | 600 | 472 | 1026 | 1026 |
| 2020-01-28 | 605 | 472 | 1026 | 1026 |
| 2020-01-28 | 593 | 472 | 1046 | 1046 |
| 2020-01-28 | 455 | 472 | 1046 | 1046 |
| 2020-01-29 | 459 | 472 | 1026 | 1026 |
| 2020-01-29 | 512 | 472 | 1026 | 1026 |
| 2020-01-29 | 603 | 472 | 1026 | 1026 |
| 2020-01-29 | 611 | 472 | 1026 | 1026 |
| 2020-01-29 | 592 | 472 | 1046 | 1046 |
| 2020-01-29 | 456 | 472 | 1046 | 1046 |
| 2020-01-30 | 461 | 472 | 1026 | 1026 |
| 2020-01-30 | 516 | 472 | 1026 | 1026 |
| 2020-01-30 | 608 | 472 | 1026 | 1026 |
| 2020-01-30 | 606 | 472 | 1026 | 1026 |
| 2020-01-30 | 592 | 472 | 1046 | 1046 |
| 2020-01-30 | 457 | 472 | 1046 | 1046 |
| 2020-01-31 | 464 | 472 | 1026 | 1026 |
| 2020-01-31 | 556 | 472 | 1026 | 1026 |
| 2020-01-31 | 582 | 472 | 1026 | 1026 |
| 2020-01-31 | 583 | 472 | 1026 | 1026 |
| 2020-01-31 | 526 | 472 | 1046 | 1046 |
| 2020-01-31 | 473 | 472 | 1046 | 1046 |
| 2020-02-01 | 465 | 473 | 1026 | 1026 |
| 2020-02-01 | 542 | 473 | 1026 | 1026 |
| 2020-02-01 | 582 | 473 | 1026 | 1026 |
| 2020-02-01 | 583 | 473 | 1026 | 1026 |
| 2020-02-01 | 534 | 473 | 1046 | 1046 |
| 2020-02-01 | 471 | 473 | 1046 | 1046 |
| 2020-02-02 | 471 | 473 | 1026 | 1026 |
| 2020-02-02 | 466 | 473 | 1026 | 1026 |
| 2020-02-02 | 577 | 473 | 1026 | 1026 |
| 2020-02-02 | 575 | 473 | 1026 | 1026 |
| 2020-02-02 | 535 | 473 | 1046 | 1046 |
| 2020-02-02 | 470 | 473 | 1046 | 1046 |
| 2020-02-03 | 477 | 473 | 1026 | 1026 |
| 2020-02-03 | 545 | 473 | 1026 | 1026 |
| 2020-02-03 | 582 | 473 | 1026 | 1026 |
| 2020-02-03 | 582 | 473 | 1026 | 1026 |
| 2020-02-03 | 524 | 473 | 1046 | 1046 |
| 2020-02-03 | 476 | 473 | 1046 | 1046 |
| 2020-02-04 | 466 | 473 | 1026 | 1026 |
| 2020-02-04 | 545 | 473 | 1026 | 1026 |
| 2020-02-04 | 582 | 473 | 1026 | 1026 |
| 2020-02-04 | 592 | 473 | 1026 | 1026 |
| 2020-02-04 | 589 | 473 | 1046 | 1046 |
| 2020-02-04 | 464 | 473 | 1046 | 1046 |
| 2020-02-05 | 461 | 473 | 1026 | 1026 |
| 2020-02-05 | 520 | 473 | 1026 | 1026 |
| 2020-02-05 | 607 | 473 | 1026 | 1026 |
| 2020-02-05 | 610 | 473 | 1026 | 1026 |
| 2020-02-05 | 552 | 473 | 1046 | 1046 |
| 2020-02-05 | 460 | 473 | 1046 | 1046 |
| 2020-02-06 | 451 | 473 | 1026 | 1026 |
| 2020-02-06 | 519 | 473 | 1026 | 1026 |
| 2020-02-06 | 608 | 473 | 1026 | 1026 |
| 2020-02-06 | 612 | 473 | 1026 | 1026 |
| 2020-02-06 | 553 | 473 | 1046 | 1046 |
| 2020-02-06 | 468 | 473 | 1046 | 1046 |
| 2020-02-07 | 458 | 473 | 1026 | 1026 |
| 2020-02-07 | 531 | 473 | 1026 | 1026 |
| 2020-02-07 | 612 | 473 | 1026 | 1026 |
| 2020-02-07 | 622 | 473 | 1026 | 1026 |
| 2020-02-07 | 547 | 473 | 1046 | 1046 |
| 2020-02-07 | 479 | 473 | 1046 | 1046 |
| 2020-02-08 | 471 | 473 | 1026 | 1026 |
| 2020-02-08 | 548 | 473 | 1026 | 1026 |
| 2020-02-08 | 592 | 473 | 1026 | 1026 |
| 2020-02-08 | 560 | 473 | 1026 | 1026 |
| 2020-02-08 | 545 | 473 | 1046 | 1046 |
| 2020-02-08 | 483 | 473 | 1046 | 1046 |
| 2020-02-09 | 468 | 473 | 1026 | 1026 |
| 2020-02-09 | 532 | 473 | 1026 | 1026 |
| 2020-02-09 | 556 | 473 | 1026 | 1026 |
| 2020-02-09 | 562 | 473 | 1026 | 1026 |
| 2020-02-09 | 541 | 473 | 1046 | 1046 |
| 2020-02-09 | 485 | 473 | 1046 | 1046 |
| 2020-02-10 | 466 | 473 | 1026 | 1026 |
| 2020-02-10 | 548 | 473 | 1026 | 1026 |
| 2020-02-10 | 595 | 473 | 1026 | 1026 |
| 2020-02-10 | 589 | 473 | 1026 | 1026 |
| 2020-02-10 | 533 | 473 | 1046 | 1046 |
| 2020-02-10 | 483 | 473 | 1046 | 1046 |
| 2020-02-11 | 465 | 473 | 1026 | 1026 |
| 2020-02-11 | 549 | 473 | 1026 | 1026 |
| 2020-02-11 | 597 | 473 | 1026 | 1026 |
| 2020-02-11 | 600 | 473 | 1026 | 1026 |
| 2020-02-11 | 529 | 473 | 1046 | 1046 |
| 2020-02-11 | 519 | 473 | 1046 | 1046 |
| 2020-02-12 | 467 | 473 | 1026 | 1026 |
| 2020-02-12 | 549 | 473 | 1026 | 1026 |
| 2020-02-12 | 596 | 473 | 1026 | 1026 |
| 2020-02-12 | 600 | 473 | 1026 | 1026 |
| 2020-02-12 | 529 | 473 | 1046 | 1046 |
| 2020-02-12 | 468 | 473 | 1046 | 1046 |
| 2020-02-13 | 470 | 473 | 1026 | 1026 |
| 2020-02-13 | 561 | 473 | 1026 | 1026 |
| 2020-02-13 | 583 | 473 | 1026 | 1026 |
| 2020-02-13 | 592 | 473 | 1026 | 1026 |
| 2020-02-13 | 533 | 473 | 1046 | 1046 |
| 2020-02-13 | 471 | 473 | 1046 | 1046 |
| 2020-02-14 | 474 | 473 | 1026 | 1026 |
| 2020-02-14 | 530 | 473 | 1026 | 1026 |
| 2020-02-14 | 608 | 473 | 1026 | 1026 |
| 2020-02-14 | 606 | 473 | 1026 | 1026 |
| 2020-02-14 | 531 | 473 | 1046 | 1046 |
| 2020-02-14 | 484 | 473 | 1046 | 1046 |
| 2020-02-15 | 471 | 473 | 1026 | 1026 |
| 2020-02-15 | 540 | 473 | 1026 | 1026 |
| 2020-02-15 | 590 | 473 | 1026 | 1026 |
| 2020-02-15 | 587 | 473 | 1026 | 1026 |
| 2020-02-15 | 538 | 473 | 1046 | 1046 |
| 2020-02-15 | 482 | 473 | 1046 | 1046 |
| 2020-02-16 | 467 | 473 | 1026 | 1026 |
| 2020-02-16 | 476 | 473 | 1026 | 1026 |
| 2020-02-16 | 551 | 473 | 1026 | 1026 |
| 2020-02-16 | 535 | 473 | 1026 | 1026 |
| 2020-02-16 | 537 | 473 | 1046 | 1046 |
| 2020-02-16 | 474 | 473 | 1046 | 1046 |
| 2020-02-17 | 467 | 473 | 1026 | 1026 |
| 2020-02-17 | 550 | 473 | 1026 | 1026 |
| 2020-02-17 | 599 | 473 | 1026 | 1026 |
| 2020-02-17 | 568 | 473 | 1026 | 1026 |
| 2020-02-17 | 529 | 473 | 1046 | 1046 |
| 2020-02-17 | 470 | 473 | 1046 | 1046 |
| 2020-02-18 | 467 | 473 | 1026 | 1026 |
| 2020-02-18 | 555 | 473 | 1026 | 1026 |
| 2020-02-18 | 593 | 473 | 1026 | 1026 |
| 2020-02-18 | 590 | 473 | 1026 | 1026 |
| 2020-02-18 | 529 | 473 | 1046 | 1046 |
| 2020-02-18 | 472 | 473 | 1046 | 1046 |
| 2020-02-19 | 467 | 473 | 1026 | 1026 |
| 2020-02-19 | 557 | 473 | 1026 | 1026 |
| 2020-02-19 | 602 | 473 | 1026 | 1026 |
| 2020-02-19 | 602 | 473 | 1026 | 1026 |
| 2020-02-19 | 529 | 473 | 1046 | 1046 |
| 2020-02-19 | 471 | 473 | 1046 | 1046 |
| 2020-02-20 | 512 | 473 | 1046 | 1046 |
| 2020-02-20 | 512 | 473 | 1046 | 1046 |
| 2020-02-20 | 512 | 473 | 1046 | 1046 |
| 2020-02-20 | 512 | 473 | 1046 | 1046 |
| 2020-02-20 | 512 | 473 | 1046 | 1046 |
| 2020-02-20 | 512 | 473 | 1046 | 1046 |
| 2020-02-21 | 469 | 473 | 1026 | 1026 |
| 2020-02-21 | 562 | 473 | 1026 | 1026 |
| 2020-02-21 | 595 | 473 | 1026 | 1026 |
| 2020-02-21 | 573 | 473 | 1026 | 1026 |
| 2020-02-21 | 535 | 473 | 1046 | 1046 |
| 2020-02-21 | 477 | 473 | 1046 | 1046 |
| 2020-02-22 | 469 | 473 | 1026 | 1026 |
| 2020-02-22 | 533 | 473 | 1026 | 1026 |
| 2020-02-22 | 587 | 473 | 1026 | 1026 |
| 2020-02-22 | 542 | 473 | 1026 | 1026 |
| 2020-02-22 | 538 | 473 | 1046 | 1046 |
| 2020-02-22 | 474 | 473 | 1046 | 1046 |
| 2020-02-23 | 468 | 473 | 1026 | 1026 |
| 2020-02-23 | 473 | 473 | 1026 | 1026 |
| 2020-02-23 | 558 | 473 | 1026 | 1026 |
| 2020-02-23 | 554 | 473 | 1026 | 1026 |
| 2020-02-23 | 537 | 473 | 1046 | 1046 |
| 2020-02-23 | 476 | 473 | 1046 | 1046 |
| 2020-02-24 | 461 | 473 | 1026 | 1026 |
| 2020-02-24 | 551 | 473 | 1026 | 1026 |
| 2020-02-24 | 590 | 473 | 1026 | 1026 |
| 2020-02-24 | 583 | 473 | 1026 | 1026 |
| 2020-02-24 | 536 | 473 | 1046 | 1046 |
| 2020-02-24 | 471 | 473 | 1046 | 1046 |
| 2020-02-25 | 469 | 473 | 1026 | 1026 |
| 2020-02-25 | 555 | 473 | 1026 | 1026 |
| 2020-02-25 | 597 | 473 | 1026 | 1026 |
| 2020-02-25 | 598 | 473 | 1026 | 1026 |
| 2020-02-25 | 526 | 473 | 1046 | 1046 |
| 2020-02-25 | 471 | 473 | 1046 | 1046 |
| 2020-02-26 | 468 | 473 | 1026 | 1026 |
| 2020-02-26 | 557 | 473 | 1026 | 1026 |
| 2020-02-26 | 591 | 473 | 1026 | 1026 |
| 2020-02-26 | 599 | 473 | 1026 | 1026 |
| 2020-02-26 | 528 | 473 | 1046 | 1046 |
| 2020-02-26 | 478 | 473 | 1046 | 1046 |
| 2020-02-27 | 516 | 473 | 1026 | 1026 |
| 2020-02-27 | 516 | 473 | 1026 | 1026 |
| 2020-02-27 | 516 | 473 | 1026 | 1026 |
| 2020-02-27 | 516 | 473 | 1026 | 1026 |
| 2020-02-27 | 516 | 473 | 1046 | 1046 |
| 2020-02-27 | 516 | 473 | 1046 | 1046 |
| 2020-02-28 | 467 | 473 | 1026 | 1026 |
| 2020-02-28 | 520 | 473 | 1026 | 1026 |
| 2020-02-28 | 586 | 473 | 1026 | 1026 |
| 2020-02-28 | 595 | 473 | 1026 | 1026 |
| 2020-02-28 | 545 | 473 | 1046 | 1046 |
| 2020-02-28 | 517 | 473 | 1046 | 1046 |
| 2020-02-29 | 512 | 473 | 1026 | 1026 |
| 2020-02-29 | 512 | 473 | 1026 | 1026 |
| 2020-02-29 | 512 | 473 | 1026 | 1026 |
| 2020-02-29 | 512 | 473 | 1026 | 1026 |
| 2020-02-29 | 512 | 473 | 1046 | 1046 |
| 2020-02-29 | 512 | 473 | 1046 | 1046 |
| 2020-03-01 | 464 | 470 | 1026 | 1026 |
| 2020-03-01 | 473 | 470 | 1026 | 1026 |
| 2020-03-01 | 570 | 470 | 1026 | 1026 |
| 2020-03-01 | 559 | 470 | 1026 | 1026 |
| 2020-03-01 | 532 | 470 | 1046 | 1046 |
| 2020-03-01 | 472 | 470 | 1046 | 1046 |
| 2020-03-02 | 463 | 470 | 1026 | 1026 |
| 2020-03-02 | 538 | 470 | 1026 | 1026 |
| 2020-03-02 | 604 | 470 | 1026 | 1026 |
| 2020-03-02 | 621 | 470 | 1026 | 1026 |
| 2020-03-02 | 551 | 470 | 1046 | 1046 |
| 2020-03-02 | 462 | 470 | 1046 | 1046 |
| 2020-03-03 | 512 | 470 | 1026 | 1026 |
| 2020-03-03 | 512 | 470 | 1026 | 1026 |
| 2020-03-03 | 512 | 470 | 1026 | 1026 |
| 2020-03-03 | 512 | 470 | 1026 | 1026 |
| 2020-03-03 | 512 | 470 | 1046 | 1046 |
| 2020-03-03 | 512 | 470 | 1046 | 1046 |
| 2020-03-04 | 512 | 470 | 1026 | 1026 |
| 2020-03-04 | 512 | 470 | 1026 | 1026 |
| 2020-03-04 | 512 | 470 | 1026 | 1026 |
| 2020-03-04 | 512 | 470 | 1026 | 1026 |
| 2020-03-04 | 512 | 470 | 1046 | 1046 |
| 2020-03-04 | 512 | 470 | 1046 | 1046 |
| 2020-03-05 | 469 | 470 | 1026 | 1026 |
| 2020-03-05 | 583 | 470 | 1026 | 1026 |
| 2020-03-05 | 602 | 470 | 1026 | 1026 |
| 2020-03-05 | 590 | 470 | 1026 | 1026 |
| 2020-03-05 | 515 | 470 | 1046 | 1046 |
| 2020-03-05 | 469 | 470 | 1046 | 1046 |
| 2020-03-06 | 467 | 470 | 1026 | 1026 |
| 2020-03-06 | 551 | 470 | 1026 | 1026 |
| 2020-03-06 | 583 | 470 | 1026 | 1026 |
| 2020-03-06 | 621 | 470 | 1026 | 1026 |
| 2020-03-06 | 560 | 470 | 1046 | 1046 |
| 2020-03-06 | 489 | 470 | 1046 | 1046 |
| 2020-03-07 | 446 | 470 | 1026 | 1026 |
| 2020-03-07 | 473 | 470 | 1026 | 1026 |
| 2020-03-07 | 581 | 470 | 1026 | 1026 |
| 2020-03-07 | 646 | 470 | 1026 | 1026 |
| 2020-03-07 | 513 | 470 | 1046 | 1046 |
| 2020-03-07 | 473 | 470 | 1046 | 1046 |
| 2020-03-08 | 465 | 470 | 1026 | 1026 |
| 2020-03-08 | 474 | 470 | 1026 | 1026 |
| 2020-03-08 | 561 | 470 | 1026 | 1026 |
| 2020-03-08 | 566 | 470 | 1026 | 1026 |
| 2020-03-08 | 535 | 470 | 1046 | 1046 |
| 2020-03-08 | 484 | 470 | 1046 | 1046 |
| 2020-03-09 | 470 | 470 | 1026 | 1026 |
| 2020-03-09 | 536 | 470 | 1026 | 1026 |
| 2020-03-09 | 578 | 470 | 1026 | 1026 |
| 2020-03-09 | 574 | 470 | 1026 | 1026 |
| 2020-03-09 | 534 | 470 | 1046 | 1046 |
| 2020-03-09 | 473 | 470 | 1046 | 1046 |
| 2020-03-10 | 462 | 470 | 1026 | 1026 |
| 2020-03-10 | 536 | 470 | 1026 | 1026 |
| 2020-03-10 | 567 | 470 | 1026 | 1026 |
| 2020-03-10 | 557 | 470 | 1026 | 1026 |
| 2020-03-10 | 532 | 470 | 1046 | 1046 |
| 2020-03-10 | 470 | 470 | 1046 | 1046 |
| 2020-03-11 | 466 | 470 | 1026 | 1026 |
| 2020-03-11 | 528 | 470 | 1026 | 1026 |
| 2020-03-11 | 573 | 470 | 1026 | 1026 |
| 2020-03-11 | 570 | 470 | 1026 | 1026 |
| 2020-03-11 | 531 | 470 | 1046 | 1046 |
| 2020-03-11 | 468 | 470 | 1046 | 1046 |
| 2020-03-12 | 463 | 470 | 1026 | 1026 |
| 2020-03-12 | 536 | 470 | 1026 | 1026 |
| 2020-03-12 | 584 | 470 | 1026 | 1026 |
| 2020-03-12 | 575 | 470 | 1026 | 1026 |
| 2020-03-12 | 520 | 470 | 1046 | 1046 |
| 2020-03-12 | 466 | 470 | 1046 | 1046 |
| 2020-03-13 | 466 | 470 | 1026 | 1026 |
| 2020-03-13 | 535 | 470 | 1026 | 1026 |
| 2020-03-13 | 581 | 470 | 1026 | 1026 |
| 2020-03-13 | 638 | 470 | 1026 | 1026 |
| 2020-03-13 | 548 | 470 | 1046 | 1046 |
| 2020-03-13 | 500 | 470 | 1046 | 1046 |
| 2020-03-14 | 452 | 470 | 1026 | 1026 |
| 2020-03-14 | 481 | 470 | 1026 | 1026 |
| 2020-03-14 | 589 | 470 | 1026 | 1026 |
| 2020-03-14 | 646 | 470 | 1026 | 1026 |
| 2020-03-14 | 528 | 470 | 1046 | 1046 |
| 2020-03-14 | 473 | 470 | 1046 | 1046 |
| 2020-03-15 | 471 | 470 | 1026 | 1026 |
| 2020-03-15 | 478 | 470 | 1026 | 1026 |
| 2020-03-15 | 568 | 470 | 1026 | 1026 |
| 2020-03-15 | 556 | 470 | 1026 | 1026 |
| 2020-03-15 | 521 | 470 | 1046 | 1046 |
| 2020-03-15 | 476 | 470 | 1046 | 1046 |
| 2020-03-16 | 457 | 470 | 1026 | 1026 |
| 2020-03-16 | 510 | 470 | 1026 | 1026 |
| 2020-03-16 | 577 | 470 | 1026 | 1026 |
| 2020-03-16 | 635 | 470 | 1026 | 1026 |
| 2020-03-16 | 551 | 470 | 1046 | 1046 |
| 2020-03-16 | 464 | 470 | 1046 | 1046 |
| 2020-03-17 | 458 | 470 | 1026 | 1026 |
| 2020-03-17 | 563 | 470 | 1026 | 1026 |
| 2020-03-17 | 587 | 470 | 1026 | 1026 |
| 2020-03-17 | 609 | 470 | 1026 | 1026 |
| 2020-03-17 | 526 | 470 | 1046 | 1046 |
| 2020-03-17 | 469 | 470 | 1046 | 1046 |
| 2020-03-18 | 473 | 470 | 1026 | 1026 |
| 2020-03-18 | 551 | 470 | 1026 | 1026 |
| 2020-03-18 | 588 | 470 | 1026 | 1026 |
| 2020-03-18 | 605 | 470 | 1026 | 1026 |
| 2020-03-18 | 521 | 470 | 1046 | 1046 |
| 2020-03-18 | 471 | 470 | 1046 | 1046 |
| 2020-03-19 | 475 | 470 | 1026 | 1026 |
| 2020-03-19 | 552 | 470 | 1026 | 1026 |
| 2020-03-19 | 611 | 470 | 1026 | 1026 |
| 2020-03-19 | 645 | 470 | 1026 | 1026 |
| 2020-03-19 | 536 | 470 | 1046 | 1046 |
| 2020-03-19 | 473 | 470 | 1046 | 1046 |
| 2020-03-20 | 476 | 470 | 1026 | 1026 |
| 2020-03-20 | 541 | 470 | 1026 | 1026 |
| 2020-03-20 | 560 | 470 | 1026 | 1026 |
| 2020-03-20 | 553 | 470 | 1026 | 1026 |
| 2020-03-20 | 521 | 470 | 1046 | 1046 |
| 2020-03-20 | 472 | 470 | 1046 | 1046 |
| 2020-03-21 | 465 | 470 | 1026 | 1026 |
| 2020-03-21 | 525 | 470 | 1026 | 1026 |
| 2020-03-21 | 583 | 470 | 1026 | 1026 |
| 2020-03-21 | 582 | 470 | 1026 | 1026 |
| 2020-03-21 | 525 | 470 | 1046 | 1046 |
| 2020-03-21 | 466 | 470 | 1046 | 1046 |
| 2020-03-22 | 464 | 470 | 1026 | 1026 |
| 2020-03-22 | 520 | 470 | 1026 | 1026 |
| 2020-03-22 | 588 | 470 | 1026 | 1026 |
| 2020-03-22 | 600 | 470 | 1026 | 1026 |
| 2020-03-22 | 525 | 470 | 1046 | 1046 |
| 2020-03-22 | 472 | 470 | 1046 | 1046 |
| 2020-03-23 | 470 | 470 | 1026 | 1026 |
| 2020-03-23 | 552 | 470 | 1026 | 1026 |
| 2020-03-23 | 597 | 470 | 1026 | 1026 |
| 2020-03-23 | 615 | 470 | 1026 | 1026 |
| 2020-03-23 | 534 | 470 | 1046 | 1046 |
| 2020-03-23 | 467 | 470 | 1046 | 1046 |
| 2020-03-24 | 464 | 470 | 1026 | 1026 |
| 2020-03-24 | 574 | 470 | 1026 | 1026 |
| 2020-03-24 | 586 | 470 | 1026 | 1026 |
| 2020-03-24 | 626 | 470 | 1026 | 1026 |
| 2020-03-24 | 547 | 470 | 1046 | 1046 |
| 2020-03-24 | 458 | 470 | 1046 | 1046 |
| 2020-03-25 | 468 | 470 | 1026 | 1026 |
| 2020-03-25 | 568 | 470 | 1026 | 1026 |
| 2020-03-25 | 587 | 470 | 1026 | 1026 |
| 2020-03-25 | 634 | 470 | 1026 | 1026 |
| 2020-03-25 | 550 | 470 | 1046 | 1046 |
| 2020-03-25 | 465 | 470 | 1046 | 1046 |
| 2020-03-26 | 468 | 470 | 1026 | 1026 |
| 2020-03-26 | 482 | 470 | 1026 | 1026 |
| 2020-03-26 | 595 | 470 | 1026 | 1026 |
| 2020-03-26 | 631 | 470 | 1026 | 1026 |
| 2020-03-26 | 533 | 470 | 1046 | 1046 |
| 2020-03-26 | 467 | 470 | 1046 | 1046 |
| 2020-03-27 | 471 | 470 | 1026 | 1026 |
| 2020-03-27 | 520 | 470 | 1026 | 1026 |
| 2020-03-27 | 581 | 470 | 1026 | 1026 |
| 2020-03-27 | 640 | 470 | 1026 | 1026 |
| 2020-03-27 | 521 | 470 | 1046 | 1046 |
| 2020-03-27 | 469 | 470 | 1046 | 1046 |
| 2020-03-28 | 478 | 470 | 1026 | 1026 |
| 2020-03-28 | 487 | 470 | 1026 | 1026 |
| 2020-03-28 | 599 | 470 | 1026 | 1026 |
| 2020-03-28 | 661 | 470 | 1026 | 1026 |
| 2020-03-28 | 523 | 470 | 1046 | 1046 |
| 2020-03-28 | 473 | 470 | 1046 | 1046 |
| 2020-03-29 | 469 | 470 | 1026 | 1026 |
| 2020-03-29 | 482 | 470 | 1026 | 1026 |
| 2020-03-29 | 587 | 470 | 1026 | 1026 |
| 2020-03-29 | 592 | 470 | 1026 | 1026 |
| 2020-03-29 | 531 | 470 | 1046 | 1046 |
| 2020-03-29 | 472 | 470 | 1046 | 1046 |
| 2020-03-30 | 478 | 470 | 1026 | 1026 |
| 2020-03-30 | 515 | 470 | 1026 | 1026 |
| 2020-03-30 | 594 | 470 | 1026 | 1026 |
| 2020-03-30 | 652 | 470 | 1026 | 1026 |
| 2020-03-30 | 637 | 470 | 1046 | 1046 |
| 2020-03-30 | 518 | 470 | 1046 | 1046 |
| 2020-03-31 | 474 | 470 | 1026 | 1026 |
| 2020-03-31 | 523 | 470 | 1026 | 1026 |
| 2020-03-31 | 567 | 470 | 1026 | 1026 |
| 2020-03-31 | 636 | 470 | 1026 | 1026 |
| 2020-03-31 | 637 | 470 | 1046 | 1046 |
| 2020-03-31 | 501 | 470 | 1046 | 1046 |
| 2020-04-01 | 457 | 472 | 1026 | 1026 |
| 2020-04-01 | 517 | 472 | 1026 | 1026 |
| 2020-04-01 | 568 | 472 | 1026 | 1026 |
| 2020-04-01 | 638 | 472 | 1026 | 1026 |
| 2020-04-01 | 633 | 472 | 1046 | 1046 |
| 2020-04-01 | 452 | 472 | 1046 | 1046 |
| 2020-04-02 | 449 | 472 | 1026 | 1026 |
| 2020-04-02 | 520 | 472 | 1026 | 1026 |
| 2020-04-02 | 591 | 472 | 1026 | 1026 |
| 2020-04-02 | 675 | 472 | 1026 | 1026 |
| 2020-04-02 | 560 | 472 | 1046 | 1046 |
| 2020-04-02 | 479 | 472 | 1046 | 1046 |
| 2020-04-03 | 483 | 472 | 1026 | 1026 |
| 2020-04-03 | 531 | 472 | 1026 | 1026 |
| 2020-04-03 | 590 | 472 | 1026 | 1026 |
| 2020-04-03 | 666 | 472 | 1026 | 1026 |
| 2020-04-03 | 656 | 472 | 1046 | 1046 |
| 2020-04-03 | 508 | 472 | 1046 | 1046 |
| 2020-04-04 | 463 | 472 | 1026 | 1026 |
| 2020-04-04 | 427 | 472 | 1026 | 1026 |
| 2020-04-04 | 548 | 472 | 1026 | 1026 |
| 2020-04-04 | 657 | 472 | 1026 | 1026 |
| 2020-04-04 | 652 | 472 | 1046 | 1046 |
| 2020-04-04 | 506 | 472 | 1046 | 1046 |
| 2020-04-05 | 478 | 472 | 1026 | 1026 |
| 2020-04-05 | 520 | 472 | 1026 | 1026 |
| 2020-04-05 | 581 | 472 | 1026 | 1026 |
| 2020-04-05 | 678 | 472 | 1026 | 1026 |
| 2020-04-05 | 676 | 472 | 1046 | 1046 |
| 2020-04-05 | 496 | 472 | 1046 | 1046 |
| 2020-04-06 | 483 | 472 | 1026 | 1026 |
| 2020-04-06 | 558 | 472 | 1026 | 1026 |
| 2020-04-06 | 573 | 472 | 1026 | 1026 |
| 2020-04-06 | 589 | 472 | 1026 | 1026 |
| 2020-04-06 | 534 | 472 | 1046 | 1046 |
| 2020-04-06 | 516 | 472 | 1046 | 1046 |
| 2020-04-07 | 463 | 472 | 1026 | 1026 |
| 2020-04-07 | 512 | 472 | 1026 | 1026 |
| 2020-04-07 | 543 | 472 | 1026 | 1026 |
| 2020-04-07 | 671 | 472 | 1026 | 1026 |
| 2020-04-07 | 644 | 472 | 1046 | 1046 |
| 2020-04-07 | 478 | 472 | 1046 | 1046 |
| 2020-04-08 | 475 | 472 | 1026 | 1026 |
| 2020-04-08 | 507 | 472 | 1026 | 1026 |
| 2020-04-08 | 538 | 472 | 1026 | 1026 |
| 2020-04-08 | 676 | 472 | 1026 | 1026 |
| 2020-04-08 | 638 | 472 | 1046 | 1046 |
| 2020-04-08 | 490 | 472 | 1046 | 1046 |
| 2020-04-09 | 516 | 472 | 1026 | 1026 |
| 2020-04-09 | 516 | 472 | 1026 | 1026 |
| 2020-04-09 | 516 | 472 | 1026 | 1026 |
| 2020-04-09 | 516 | 472 | 1026 | 1026 |
| 2020-04-09 | 516 | 472 | 1046 | 1046 |
| 2020-04-09 | 516 | 472 | 1046 | 1046 |
| 2020-04-10 | 483 | 472 | 1026 | 1026 |
| 2020-04-10 | 512 | 472 | 1026 | 1026 |
| 2020-04-10 | 541 | 472 | 1026 | 1026 |
| 2020-04-10 | 671 | 472 | 1026 | 1026 |
| 2020-04-10 | 659 | 472 | 1046 | 1046 |
| 2020-04-10 | 480 | 472 | 1046 | 1046 |
| 2020-04-11 | 487 | 472 | 1026 | 1026 |
| 2020-04-11 | 511 | 472 | 1026 | 1026 |
| 2020-04-11 | 534 | 472 | 1026 | 1026 |
| 2020-04-11 | 673 | 472 | 1026 | 1026 |
| 2020-04-11 | 635 | 472 | 1046 | 1046 |
| 2020-04-11 | 473 | 472 | 1046 | 1046 |
| 2020-04-12 | 464 | 472 | 1026 | 1026 |
| 2020-04-12 | 508 | 472 | 1026 | 1026 |
| 2020-04-12 | 553 | 472 | 1026 | 1026 |
| 2020-04-12 | 676 | 472 | 1026 | 1026 |
| 2020-04-12 | 664 | 472 | 1046 | 1046 |
| 2020-04-12 | 467 | 472 | 1046 | 1046 |
| 2020-04-13 | 482 | 472 | 1026 | 1026 |
| 2020-04-13 | 488 | 472 | 1026 | 1026 |
| 2020-04-13 | 595 | 472 | 1026 | 1026 |
| 2020-04-13 | 645 | 472 | 1026 | 1026 |
| 2020-04-13 | 612 | 472 | 1046 | 1046 |
| 2020-04-13 | 517 | 472 | 1046 | 1046 |
| 2020-04-14 | 473 | 472 | 1026 | 1026 |
| 2020-04-14 | 431 | 472 | 1026 | 1026 |
| 2020-04-14 | 572 | 472 | 1026 | 1026 |
| 2020-04-14 | 655 | 472 | 1026 | 1026 |
| 2020-04-14 | 633 | 472 | 1046 | 1046 |
| 2020-04-14 | 481 | 472 | 1046 | 1046 |
| 2020-04-15 | 459 | 472 | 1026 | 1026 |
| 2020-04-15 | 415 | 472 | 1026 | 1026 |
| 2020-04-15 | 548 | 472 | 1026 | 1026 |
| 2020-04-15 | 659 | 472 | 1026 | 1026 |
| 2020-04-15 | 628 | 472 | 1046 | 1046 |
| 2020-04-15 | 476 | 472 | 1046 | 1046 |
| 2020-04-16 | 480 | 472 | 1026 | 1026 |
| 2020-04-16 | 455 | 472 | 1026 | 1026 |
| 2020-04-16 | 539 | 472 | 1026 | 1026 |
| 2020-04-16 | 671 | 472 | 1026 | 1026 |
| 2020-04-16 | 634 | 472 | 1046 | 1046 |
| 2020-04-16 | 469 | 472 | 1046 | 1046 |
| 2020-04-17 | 477 | 472 | 1026 | 1026 |
| 2020-04-17 | 493 | 472 | 1026 | 1026 |
| 2020-04-17 | 570 | 472 | 1026 | 1026 |
| 2020-04-17 | 674 | 472 | 1026 | 1026 |
| 2020-04-17 | 640 | 472 | 1046 | 1046 |
| 2020-04-17 | 482 | 472 | 1046 | 1046 |
| 2020-04-18 | 479 | 472 | 1026 | 1026 |
| 2020-04-18 | 491 | 472 | 1026 | 1026 |
| 2020-04-18 | 502 | 472 | 1026 | 1026 |
| 2020-04-18 | 660 | 472 | 1026 | 1026 |
| 2020-04-18 | 645 | 472 | 1046 | 1046 |
| 2020-04-18 | 466 | 472 | 1046 | 1046 |
| 2020-04-19 | 462 | 472 | 1026 | 1026 |
| 2020-04-19 | 412 | 472 | 1026 | 1026 |
| 2020-04-19 | 542 | 472 | 1026 | 1026 |
| 2020-04-19 | 672 | 472 | 1026 | 1026 |
| 2020-04-19 | 664 | 472 | 1046 | 1046 |
| 2020-04-19 | 513 | 472 | 1046 | 1046 |
| 2020-04-20 | 487 | 472 | 1026 | 1026 |
| 2020-04-20 | 483 | 472 | 1026 | 1026 |
| 2020-04-20 | 594 | 472 | 1026 | 1026 |
| 2020-04-20 | 634 | 472 | 1026 | 1026 |
| 2020-04-20 | 625 | 472 | 1046 | 1046 |
| 2020-04-20 | 528 | 472 | 1046 | 1046 |
| 2020-04-21 | 479 | 472 | 1026 | 1026 |
| 2020-04-21 | 490 | 472 | 1026 | 1026 |
| 2020-04-21 | 597 | 472 | 1026 | 1026 |
| 2020-04-21 | 632 | 472 | 1026 | 1026 |
| 2020-04-21 | 624 | 472 | 1046 | 1046 |
| 2020-04-21 | 513 | 472 | 1046 | 1046 |
| 2020-04-22 | 482 | 472 | 1026 | 1026 |
| 2020-04-22 | 485 | 472 | 1026 | 1026 |
| 2020-04-22 | 592 | 472 | 1026 | 1026 |
| 2020-04-22 | 670 | 472 | 1026 | 1026 |
| 2020-04-22 | 660 | 472 | 1046 | 1046 |
| 2020-04-22 | 491 | 472 | 1046 | 1046 |
| 2020-04-23 | 485 | 472 | 1026 | 1026 |
| 2020-04-23 | 516 | 472 | 1026 | 1026 |
| 2020-04-23 | 539 | 472 | 1026 | 1026 |
| 2020-04-23 | 668 | 472 | 1026 | 1026 |
| 2020-04-23 | 632 | 472 | 1046 | 1046 |
| 2020-04-23 | 466 | 472 | 1046 | 1046 |
| 2020-04-24 | 466 | 472 | 1026 | 1026 |
| 2020-04-24 | 463 | 472 | 1026 | 1026 |
| 2020-04-24 | 537 | 472 | 1026 | 1026 |
| 2020-04-24 | 660 | 472 | 1026 | 1026 |
| 2020-04-24 | 633 | 472 | 1046 | 1046 |
| 2020-04-24 | 478 | 472 | 1046 | 1046 |
| 2020-04-25 | 471 | 472 | 1026 | 1026 |
| 2020-04-25 | 500 | 472 | 1026 | 1026 |
| 2020-04-25 | 536 | 472 | 1026 | 1026 |
| 2020-04-25 | 659 | 472 | 1026 | 1026 |
| 2020-04-25 | 630 | 472 | 1046 | 1046 |
| 2020-04-25 | 477 | 472 | 1046 | 1046 |
| 2020-04-26 | 462 | 472 | 1026 | 1026 |
| 2020-04-26 | 475 | 472 | 1026 | 1026 |
| 2020-04-26 | 538 | 472 | 1026 | 1026 |
| 2020-04-26 | 660 | 472 | 1026 | 1026 |
| 2020-04-26 | 634 | 472 | 1046 | 1046 |
| 2020-04-26 | 514 | 472 | 1046 | 1046 |
| 2020-04-27 | 462 | 472 | 1026 | 1026 |
| 2020-04-27 | 466 | 472 | 1026 | 1026 |
| 2020-04-27 | 536 | 472 | 1026 | 1026 |
| 2020-04-27 | 653 | 472 | 1026 | 1026 |
| 2020-04-27 | 628 | 472 | 1046 | 1046 |
| 2020-04-27 | 499 | 472 | 1046 | 1046 |
| 2020-04-28 | 478 | 472 | 1026 | 1026 |
| 2020-04-28 | 468 | 472 | 1026 | 1026 |
| 2020-04-28 | 604 | 472 | 1026 | 1026 |
| 2020-04-28 | 693 | 472 | 1026 | 1026 |
| 2020-04-28 | 693 | 472 | 1046 | 1046 |
| 2020-04-28 | 486 | 472 | 1046 | 1046 |
| 2020-04-29 | 486 | 472 | 1026 | 1026 |
| 2020-04-29 | 517 | 472 | 1026 | 1026 |
| 2020-04-29 | 578 | 472 | 1026 | 1026 |
| 2020-04-29 | 667 | 472 | 1026 | 1026 |
| 2020-04-29 | 638 | 472 | 1046 | 1046 |
| 2020-04-29 | 494 | 472 | 1046 | 1046 |
| 2020-04-30 | 465 | 472 | 1026 | 1026 |
| 2020-04-30 | 531 | 472 | 1026 | 1026 |
| 2020-04-30 | 589 | 472 | 1026 | 1026 |
| 2020-04-30 | 605 | 472 | 1026 | 1026 |
| 2020-04-30 | 550 | 472 | 1046 | 1046 |
| 2020-04-30 | 506 | 472 | 1046 | 1046 |
| 2020-05-01 | 505 | 465 | 1026 | 1026 |
| 2020-05-01 | 505 | 465 | 1026 | 1026 |
| 2020-05-01 | 505 | 465 | 1026 | 1026 |
| 2020-05-01 | 505 | 465 | 1026 | 1026 |
| 2020-05-01 | 505 | 465 | 1046 | 1046 |
| 2020-05-01 | 505 | 465 | 1046 | 1046 |
| 2020-05-02 | 463 | 465 | 1026 | 1026 |
| 2020-05-02 | 556 | 465 | 1026 | 1026 |
| 2020-05-02 | 550 | 465 | 1026 | 1026 |
| 2020-05-02 | 618 | 465 | 1026 | 1026 |
| 2020-05-02 | 598 | 465 | 1046 | 1046 |
| 2020-05-02 | 473 | 465 | 1046 | 1046 |
| 2020-05-03 | 468 | 465 | 1026 | 1026 |
| 2020-05-03 | 421 | 465 | 1026 | 1026 |
| 2020-05-03 | 529 | 465 | 1026 | 1026 |
| 2020-05-03 | 580 | 465 | 1026 | 1026 |
| 2020-05-03 | 550 | 465 | 1046 | 1046 |
| 2020-05-03 | 496 | 465 | 1046 | 1046 |
| 2020-05-04 | 473 | 465 | 1026 | 1026 |
| 2020-05-04 | 475 | 465 | 1026 | 1026 |
| 2020-05-04 | 519 | 465 | 1026 | 1026 |
| 2020-05-04 | 617 | 465 | 1026 | 1026 |
| 2020-05-04 | 566 | 465 | 1046 | 1046 |
| 2020-05-04 | 487 | 465 | 1046 | 1046 |
| 2020-05-05 | 468 | 465 | 1026 | 1026 |
| 2020-05-05 | 553 | 465 | 1026 | 1026 |
| 2020-05-05 | 548 | 465 | 1026 | 1026 |
| 2020-05-05 | 617 | 465 | 1026 | 1026 |
| 2020-05-05 | 555 | 465 | 1046 | 1046 |
| 2020-05-05 | 499 | 465 | 1046 | 1046 |
| 2020-05-06 | 462 | 465 | 1026 | 1026 |
| 2020-05-06 | 522 | 465 | 1026 | 1026 |
| 2020-05-06 | 540 | 465 | 1026 | 1026 |
| 2020-05-06 | 619 | 465 | 1026 | 1026 |
| 2020-05-06 | 545 | 465 | 1046 | 1046 |
| 2020-05-06 | 484 | 465 | 1046 | 1046 |
| 2020-05-07 | 472 | 465 | 1026 | 1026 |
| 2020-05-07 | 507 | 465 | 1026 | 1026 |
| 2020-05-07 | 535 | 465 | 1026 | 1026 |
| 2020-05-07 | 598 | 465 | 1026 | 1026 |
| 2020-05-07 | 540 | 465 | 1046 | 1046 |
| 2020-05-07 | 495 | 465 | 1046 | 1046 |
| 2020-05-08 | 504 | 465 | 1026 | 1026 |
| 2020-05-08 | 504 | 465 | 1026 | 1026 |
| 2020-05-08 | 504 | 465 | 1026 | 1026 |
| 2020-05-08 | 504 | 465 | 1026 | 1026 |
| 2020-05-08 | 504 | 465 | 1046 | 1046 |
| 2020-05-08 | 504 | 465 | 1046 | 1046 |
| 2020-05-09 | 468 | 465 | 1026 | 1026 |
| 2020-05-09 | 501 | 465 | 1026 | 1026 |
| 2020-05-09 | 521 | 465 | 1026 | 1026 |
| 2020-05-09 | 625 | 465 | 1026 | 1026 |
| 2020-05-09 | 549 | 465 | 1046 | 1046 |
| 2020-05-09 | 474 | 465 | 1046 | 1046 |
| 2020-05-10 | 459 | 465 | 1026 | 1026 |
| 2020-05-10 | 413 | 465 | 1026 | 1026 |
| 2020-05-10 | 578 | 465 | 1026 | 1026 |
| 2020-05-10 | 614 | 465 | 1026 | 1026 |
| 2020-05-10 | 547 | 465 | 1046 | 1046 |
| 2020-05-10 | 514 | 465 | 1046 | 1046 |
| 2020-05-11 | 460 | 465 | 1026 | 1026 |
| 2020-05-11 | 534 | 465 | 1026 | 1026 |
| 2020-05-11 | 595 | 465 | 1026 | 1026 |
| 2020-05-11 | 598 | 465 | 1026 | 1026 |
| 2020-05-11 | 536 | 465 | 1046 | 1046 |
| 2020-05-11 | 511 | 465 | 1046 | 1046 |
| 2020-05-12 | 475 | 465 | 1026 | 1026 |
| 2020-05-12 | 495 | 465 | 1026 | 1026 |
| 2020-05-12 | 553 | 465 | 1026 | 1026 |
| 2020-05-12 | 579 | 465 | 1026 | 1026 |
| 2020-05-12 | 544 | 465 | 1046 | 1046 |
| 2020-05-12 | 485 | 465 | 1046 | 1046 |
| 2020-05-13 | 455 | 465 | 1026 | 1026 |
| 2020-05-13 | 493 | 465 | 1026 | 1026 |
| 2020-05-13 | 551 | 465 | 1026 | 1026 |
| 2020-05-13 | 590 | 465 | 1026 | 1026 |
| 2020-05-13 | 561 | 465 | 1046 | 1046 |
| 2020-05-13 | 483 | 465 | 1046 | 1046 |
| 2020-05-14 | 466 | 465 | 1026 | 1026 |
| 2020-05-14 | 551 | 465 | 1026 | 1026 |
| 2020-05-14 | 551 | 465 | 1026 | 1026 |
| 2020-05-14 | 608 | 465 | 1026 | 1026 |
| 2020-05-14 | 552 | 465 | 1046 | 1046 |
| 2020-05-14 | 502 | 465 | 1046 | 1046 |
| 2020-05-15 | 475 | 465 | 1026 | 1026 |
| 2020-05-15 | 509 | 465 | 1026 | 1026 |
| 2020-05-15 | 540 | 465 | 1026 | 1026 |
| 2020-05-15 | 545 | 465 | 1026 | 1026 |
| 2020-05-15 | 535 | 465 | 1046 | 1046 |
| 2020-05-15 | 484 | 465 | 1046 | 1046 |
| 2020-05-16 | 457 | 465 | 1026 | 1026 |
| 2020-05-16 | 517 | 465 | 1026 | 1026 |
| 2020-05-16 | 550 | 465 | 1026 | 1026 |
| 2020-05-16 | 580 | 465 | 1026 | 1026 |
| 2020-05-16 | 543 | 465 | 1046 | 1046 |
| 2020-05-16 | 479 | 465 | 1046 | 1046 |
| 2020-05-17 | 457 | 465 | 1026 | 1026 |
| 2020-05-17 | 503 | 465 | 1026 | 1026 |
| 2020-05-17 | 567 | 465 | 1026 | 1026 |
| 2020-05-17 | 604 | 465 | 1026 | 1026 |
| 2020-05-17 | 575 | 465 | 1046 | 1046 |
| 2020-05-17 | 507 | 465 | 1046 | 1046 |
| 2020-05-18 | 504 | 465 | 1026 | 1026 |
| 2020-05-18 | 504 | 465 | 1026 | 1026 |
| 2020-05-18 | 504 | 465 | 1026 | 1026 |
| 2020-05-18 | 504 | 465 | 1026 | 1026 |
| 2020-05-18 | 504 | 465 | 1046 | 1046 |
| 2020-05-18 | 504 | 465 | 1046 | 1046 |
| 2020-05-19 | 504 | 465 | 1026 | 1026 |
| 2020-05-19 | 504 | 465 | 1026 | 1026 |
| 2020-05-19 | 504 | 465 | 1026 | 1026 |
| 2020-05-19 | 504 | 465 | 1026 | 1026 |
| 2020-05-19 | 504 | 465 | 1046 | 1046 |
| 2020-05-19 | 504 | 465 | 1046 | 1046 |
| 2020-05-20 | 504 | 465 | 1026 | 1026 |
| 2020-05-20 | 504 | 465 | 1026 | 1026 |
| 2020-05-20 | 504 | 465 | 1026 | 1026 |
| 2020-05-20 | 504 | 465 | 1026 | 1026 |
| 2020-05-20 | 504 | 465 | 1046 | 1046 |
| 2020-05-20 | 504 | 465 | 1046 | 1046 |
| 2020-05-21 | 504 | 465 | 1026 | 1026 |
| 2020-05-21 | 504 | 465 | 1026 | 1026 |
| 2020-05-21 | 504 | 465 | 1026 | 1026 |
| 2020-05-21 | 504 | 465 | 1026 | 1026 |
| 2020-05-21 | 504 | 465 | 1046 | 1046 |
| 2020-05-21 | 504 | 465 | 1046 | 1046 |
| 2020-05-22 | 479 | 465 | 1026 | 1026 |
| 2020-05-22 | 520 | 465 | 1026 | 1026 |
| 2020-05-22 | 611 | 465 | 1026 | 1026 |
| 2020-05-22 | 604 | 465 | 1026 | 1026 |
| 2020-05-22 | 551 | 465 | 1046 | 1046 |
| 2020-05-22 | 496 | 465 | 1046 | 1046 |
| 2020-05-23 | 504 | 465 | 1026 | 1026 |
| 2020-05-23 | 504 | 465 | 1026 | 1026 |
| 2020-05-23 | 504 | 465 | 1026 | 1026 |
| 2020-05-23 | 504 | 465 | 1026 | 1026 |
| 2020-05-23 | 504 | 465 | 1046 | 1046 |
| 2020-05-23 | 504 | 465 | 1046 | 1046 |
| 2020-05-24 | 504 | 465 | 1026 | 1026 |
| 2020-05-24 | 504 | 465 | 1026 | 1026 |
| 2020-05-24 | 504 | 465 | 1026 | 1026 |
| 2020-05-24 | 504 | 465 | 1026 | 1026 |
| 2020-05-24 | 504 | 465 | 1046 | 1046 |
| 2020-05-24 | 504 | 465 | 1046 | 1046 |
| 2020-05-25 | 504 | 465 | 1026 | 1026 |
| 2020-05-25 | 504 | 465 | 1026 | 1026 |
| 2020-05-25 | 504 | 465 | 1026 | 1026 |
| 2020-05-25 | 504 | 465 | 1026 | 1026 |
| 2020-05-25 | 504 | 465 | 1046 | 1046 |
| 2020-05-25 | 504 | 465 | 1046 | 1046 |
| 2020-05-26 | 504 | 465 | 1026 | 1026 |
| 2020-05-26 | 504 | 465 | 1026 | 1026 |
| 2020-05-26 | 504 | 465 | 1026 | 1026 |
| 2020-05-26 | 504 | 465 | 1026 | 1026 |
| 2020-05-26 | 504 | 465 | 1046 | 1046 |
| 2020-05-26 | 504 | 465 | 1046 | 1046 |
| 2020-05-27 | 504 | 465 | 1046 | 1046 |
| 2020-05-27 | 504 | 465 | 1046 | 1046 |
| 2020-05-27 | 504 | 465 | 1046 | 1046 |
| 2020-05-27 | 504 | 465 | 1046 | 1046 |
| 2020-05-27 | 504 | 465 | 1046 | 1046 |
| 2020-05-27 | 504 | 465 | 1046 | 1046 |
| 2020-05-28 | 504 | 465 | 1026 | 1026 |
| 2020-05-28 | 504 | 465 | 1026 | 1026 |
| 2020-05-28 | 504 | 465 | 1026 | 1026 |
| 2020-05-28 | 504 | 465 | 1026 | 1026 |
| 2020-05-28 | 504 | 465 | 1046 | 1046 |
| 2020-05-28 | 504 | 465 | 1046 | 1046 |
| 2020-05-29 | 503 | 465 | 1026 | 1026 |
| 2020-05-29 | 504 | 465 | 1026 | 1026 |
| 2020-05-29 | 504 | 465 | 1026 | 1026 |
| 2020-05-29 | 503 | 465 | 1026 | 1026 |
| 2020-05-29 | 504 | 465 | 1046 | 1046 |
| 2020-05-29 | 504 | 465 | 1046 | 1046 |
| 2020-05-30 | 478 | 465 | 1026 | 1026 |
| 2020-05-30 | 499 | 465 | 1026 | 1026 |
| 2020-05-30 | 552 | 465 | 1026 | 1026 |
| 2020-05-30 | 669 | 465 | 1026 | 1026 |
| 2020-05-30 | 647 | 465 | 1046 | 1046 |
| 2020-05-30 | 519 | 465 | 1046 | 1046 |
| 2020-05-31 | 478 | 465 | 1026 | 1026 |
| 2020-05-31 | 499 | 465 | 1026 | 1026 |
| 2020-05-31 | 552 | 465 | 1026 | 1026 |
| 2020-05-31 | 669 | 465 | 1026 | 1026 |
| 2020-05-31 | 647 | 465 | 1046 | 1046 |
| 2020-05-31 | 519 | 465 | 1046 | 1046 |